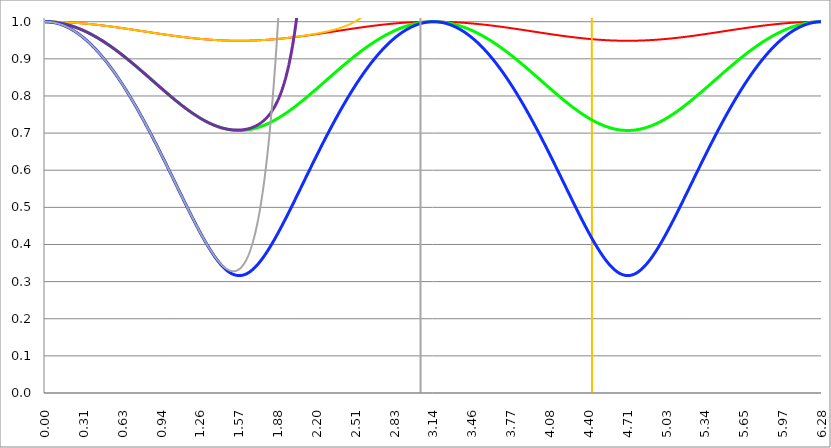
| Category | Series 1 | Series 0 | Series 3 | Series 4 | Series 5 | Series 2 |
|---|---|---|---|---|---|---|
| 0.0 | 1 | 1 | 1 | 1 | 1 | 1 |
| 0.00314159265358979 | 1 | 1 | 1 | 1 | 1 | 1 |
| 0.00628318530717958 | 1 | 1 | 1 | 1 | 1 | 1 |
| 0.00942477796076938 | 1 | 1 | 1 | 1 | 1 | 1 |
| 0.0125663706143592 | 1 | 1 | 1 | 1 | 1 | 1 |
| 0.015707963267949 | 1 | 1 | 1 | 1 | 1 | 1 |
| 0.0188495559215388 | 1 | 1 | 1 | 1 | 1 | 1 |
| 0.0219911485751285 | 1 | 1 | 1 | 1 | 1 | 1 |
| 0.0251327412287183 | 1 | 1 | 1 | 1 | 1 | 1 |
| 0.0282743338823081 | 1 | 1 | 1 | 1 | 1 | 1 |
| 0.0314159265358979 | 1 | 1 | 1 | 1 | 1 | 1 |
| 0.0345575191894877 | 1 | 1 | 1 | 1 | 0.999 | 0.999 |
| 0.0376991118430775 | 1 | 1 | 1 | 1 | 0.999 | 0.999 |
| 0.0408407044966673 | 1 | 1 | 1 | 1 | 0.999 | 0.999 |
| 0.0439822971502571 | 1 | 1 | 1 | 1 | 0.999 | 0.999 |
| 0.0471238898038469 | 1 | 1 | 0.999 | 0.999 | 0.999 | 0.999 |
| 0.0502654824574367 | 1 | 1 | 0.999 | 0.999 | 0.999 | 0.999 |
| 0.0534070751110265 | 1 | 1 | 0.999 | 0.999 | 0.999 | 0.999 |
| 0.0565486677646163 | 1 | 1 | 0.999 | 0.999 | 0.999 | 0.999 |
| 0.059690260418206 | 1 | 1 | 0.999 | 0.999 | 0.998 | 0.998 |
| 0.0628318530717958 | 1 | 1 | 0.999 | 0.999 | 0.998 | 0.998 |
| 0.0659734457253856 | 1 | 1 | 0.999 | 0.999 | 0.998 | 0.998 |
| 0.0691150383789754 | 1 | 1 | 0.999 | 0.999 | 0.998 | 0.998 |
| 0.0722566310325652 | 1 | 1 | 0.999 | 0.999 | 0.998 | 0.998 |
| 0.075398223686155 | 1 | 1 | 0.999 | 0.999 | 0.997 | 0.997 |
| 0.0785398163397448 | 1 | 1 | 0.998 | 0.998 | 0.997 | 0.997 |
| 0.0816814089933346 | 1 | 1 | 0.998 | 0.998 | 0.997 | 0.997 |
| 0.0848230016469244 | 1 | 1 | 0.998 | 0.998 | 0.997 | 0.997 |
| 0.0879645943005142 | 1 | 1 | 0.998 | 0.998 | 0.997 | 0.997 |
| 0.091106186954104 | 1 | 1 | 0.998 | 0.998 | 0.996 | 0.996 |
| 0.0942477796076937 | 1 | 1 | 0.998 | 0.998 | 0.996 | 0.996 |
| 0.0973893722612835 | 1 | 1 | 0.998 | 0.998 | 0.996 | 0.996 |
| 0.100530964914873 | 0.999 | 0.999 | 0.997 | 0.997 | 0.995 | 0.995 |
| 0.103672557568463 | 0.999 | 0.999 | 0.997 | 0.997 | 0.995 | 0.995 |
| 0.106814150222053 | 0.999 | 0.999 | 0.997 | 0.997 | 0.995 | 0.995 |
| 0.109955742875643 | 0.999 | 0.999 | 0.997 | 0.997 | 0.995 | 0.995 |
| 0.113097335529233 | 0.999 | 0.999 | 0.997 | 0.997 | 0.994 | 0.994 |
| 0.116238928182822 | 0.999 | 0.999 | 0.997 | 0.997 | 0.994 | 0.994 |
| 0.119380520836412 | 0.999 | 0.999 | 0.996 | 0.996 | 0.994 | 0.994 |
| 0.122522113490002 | 0.999 | 0.999 | 0.996 | 0.996 | 0.993 | 0.993 |
| 0.125663706143592 | 0.999 | 0.999 | 0.996 | 0.996 | 0.993 | 0.993 |
| 0.128805298797181 | 0.999 | 0.999 | 0.996 | 0.996 | 0.993 | 0.993 |
| 0.131946891450771 | 0.999 | 0.999 | 0.996 | 0.996 | 0.992 | 0.992 |
| 0.135088484104361 | 0.999 | 0.999 | 0.995 | 0.995 | 0.992 | 0.992 |
| 0.138230076757951 | 0.999 | 0.999 | 0.995 | 0.995 | 0.991 | 0.991 |
| 0.141371669411541 | 0.999 | 0.999 | 0.995 | 0.995 | 0.991 | 0.991 |
| 0.14451326206513 | 0.999 | 0.999 | 0.995 | 0.995 | 0.991 | 0.991 |
| 0.14765485471872 | 0.999 | 0.999 | 0.995 | 0.995 | 0.99 | 0.99 |
| 0.15079644737231 | 0.999 | 0.999 | 0.994 | 0.994 | 0.99 | 0.99 |
| 0.1539380400259 | 0.999 | 0.999 | 0.994 | 0.994 | 0.989 | 0.989 |
| 0.15707963267949 | 0.999 | 0.999 | 0.994 | 0.994 | 0.989 | 0.989 |
| 0.160221225333079 | 0.999 | 0.999 | 0.994 | 0.994 | 0.988 | 0.988 |
| 0.163362817986669 | 0.999 | 0.999 | 0.993 | 0.993 | 0.988 | 0.988 |
| 0.166504410640259 | 0.999 | 0.999 | 0.993 | 0.993 | 0.988 | 0.988 |
| 0.169646003293849 | 0.999 | 0.999 | 0.993 | 0.993 | 0.987 | 0.987 |
| 0.172787595947439 | 0.999 | 0.999 | 0.993 | 0.993 | 0.987 | 0.987 |
| 0.175929188601028 | 0.998 | 0.998 | 0.992 | 0.992 | 0.986 | 0.986 |
| 0.179070781254618 | 0.998 | 0.998 | 0.992 | 0.992 | 0.986 | 0.986 |
| 0.182212373908208 | 0.998 | 0.998 | 0.992 | 0.992 | 0.985 | 0.985 |
| 0.185353966561798 | 0.998 | 0.998 | 0.991 | 0.991 | 0.985 | 0.985 |
| 0.188495559215388 | 0.998 | 0.998 | 0.991 | 0.991 | 0.984 | 0.984 |
| 0.191637151868977 | 0.998 | 0.998 | 0.991 | 0.991 | 0.984 | 0.984 |
| 0.194778744522567 | 0.998 | 0.998 | 0.991 | 0.991 | 0.983 | 0.983 |
| 0.197920337176157 | 0.998 | 0.998 | 0.99 | 0.99 | 0.982 | 0.982 |
| 0.201061929829747 | 0.998 | 0.998 | 0.99 | 0.99 | 0.982 | 0.982 |
| 0.204203522483336 | 0.998 | 0.998 | 0.99 | 0.99 | 0.981 | 0.981 |
| 0.207345115136926 | 0.998 | 0.998 | 0.989 | 0.989 | 0.981 | 0.981 |
| 0.210486707790516 | 0.998 | 0.998 | 0.989 | 0.989 | 0.98 | 0.98 |
| 0.213628300444106 | 0.998 | 0.998 | 0.989 | 0.989 | 0.98 | 0.98 |
| 0.216769893097696 | 0.998 | 0.998 | 0.988 | 0.988 | 0.979 | 0.979 |
| 0.219911485751285 | 0.998 | 0.998 | 0.988 | 0.988 | 0.978 | 0.978 |
| 0.223053078404875 | 0.998 | 0.998 | 0.988 | 0.988 | 0.978 | 0.978 |
| 0.226194671058465 | 0.997 | 0.997 | 0.987 | 0.987 | 0.977 | 0.977 |
| 0.229336263712055 | 0.997 | 0.997 | 0.987 | 0.987 | 0.976 | 0.976 |
| 0.232477856365645 | 0.997 | 0.997 | 0.987 | 0.987 | 0.976 | 0.976 |
| 0.235619449019234 | 0.997 | 0.997 | 0.986 | 0.986 | 0.975 | 0.975 |
| 0.238761041672824 | 0.997 | 0.997 | 0.986 | 0.986 | 0.975 | 0.975 |
| 0.241902634326414 | 0.997 | 0.997 | 0.986 | 0.986 | 0.974 | 0.974 |
| 0.245044226980004 | 0.997 | 0.997 | 0.985 | 0.985 | 0.973 | 0.973 |
| 0.248185819633594 | 0.997 | 0.997 | 0.985 | 0.985 | 0.972 | 0.972 |
| 0.251327412287183 | 0.997 | 0.997 | 0.984 | 0.984 | 0.972 | 0.972 |
| 0.254469004940773 | 0.997 | 0.997 | 0.984 | 0.984 | 0.971 | 0.971 |
| 0.257610597594363 | 0.997 | 0.997 | 0.984 | 0.984 | 0.97 | 0.97 |
| 0.260752190247953 | 0.997 | 0.997 | 0.983 | 0.983 | 0.97 | 0.97 |
| 0.263893782901543 | 0.997 | 0.997 | 0.983 | 0.983 | 0.969 | 0.969 |
| 0.267035375555132 | 0.997 | 0.997 | 0.982 | 0.982 | 0.968 | 0.968 |
| 0.270176968208722 | 0.996 | 0.996 | 0.982 | 0.982 | 0.967 | 0.967 |
| 0.273318560862312 | 0.996 | 0.996 | 0.982 | 0.982 | 0.967 | 0.967 |
| 0.276460153515902 | 0.996 | 0.996 | 0.981 | 0.981 | 0.966 | 0.966 |
| 0.279601746169492 | 0.996 | 0.996 | 0.981 | 0.981 | 0.965 | 0.965 |
| 0.282743338823082 | 0.996 | 0.996 | 0.98 | 0.98 | 0.964 | 0.964 |
| 0.285884931476671 | 0.996 | 0.996 | 0.98 | 0.98 | 0.964 | 0.964 |
| 0.289026524130261 | 0.996 | 0.996 | 0.979 | 0.979 | 0.963 | 0.963 |
| 0.292168116783851 | 0.996 | 0.996 | 0.979 | 0.979 | 0.962 | 0.962 |
| 0.295309709437441 | 0.996 | 0.996 | 0.979 | 0.979 | 0.961 | 0.961 |
| 0.298451302091031 | 0.996 | 0.996 | 0.978 | 0.978 | 0.96 | 0.96 |
| 0.30159289474462 | 0.996 | 0.996 | 0.978 | 0.978 | 0.959 | 0.959 |
| 0.30473448739821 | 0.995 | 0.995 | 0.977 | 0.977 | 0.959 | 0.959 |
| 0.3078760800518 | 0.995 | 0.995 | 0.977 | 0.977 | 0.958 | 0.958 |
| 0.31101767270539 | 0.995 | 0.995 | 0.976 | 0.976 | 0.957 | 0.957 |
| 0.31415926535898 | 0.995 | 0.995 | 0.976 | 0.976 | 0.956 | 0.956 |
| 0.31730085801257 | 0.995 | 0.995 | 0.975 | 0.975 | 0.955 | 0.955 |
| 0.320442450666159 | 0.995 | 0.995 | 0.975 | 0.975 | 0.954 | 0.954 |
| 0.323584043319749 | 0.995 | 0.995 | 0.974 | 0.974 | 0.953 | 0.953 |
| 0.326725635973339 | 0.995 | 0.995 | 0.974 | 0.974 | 0.953 | 0.953 |
| 0.329867228626929 | 0.995 | 0.995 | 0.973 | 0.973 | 0.952 | 0.952 |
| 0.333008821280519 | 0.995 | 0.995 | 0.973 | 0.973 | 0.951 | 0.951 |
| 0.336150413934108 | 0.995 | 0.995 | 0.972 | 0.972 | 0.95 | 0.95 |
| 0.339292006587698 | 0.994 | 0.994 | 0.972 | 0.972 | 0.949 | 0.949 |
| 0.342433599241288 | 0.994 | 0.994 | 0.971 | 0.971 | 0.948 | 0.948 |
| 0.345575191894878 | 0.994 | 0.994 | 0.971 | 0.971 | 0.947 | 0.947 |
| 0.348716784548468 | 0.994 | 0.994 | 0.97 | 0.97 | 0.946 | 0.946 |
| 0.351858377202058 | 0.994 | 0.994 | 0.97 | 0.97 | 0.945 | 0.945 |
| 0.354999969855647 | 0.994 | 0.994 | 0.969 | 0.969 | 0.944 | 0.944 |
| 0.358141562509237 | 0.994 | 0.994 | 0.969 | 0.969 | 0.943 | 0.943 |
| 0.361283155162827 | 0.994 | 0.994 | 0.968 | 0.968 | 0.942 | 0.942 |
| 0.364424747816417 | 0.994 | 0.994 | 0.968 | 0.968 | 0.941 | 0.941 |
| 0.367566340470007 | 0.994 | 0.994 | 0.967 | 0.967 | 0.94 | 0.94 |
| 0.370707933123597 | 0.993 | 0.993 | 0.967 | 0.967 | 0.939 | 0.939 |
| 0.373849525777186 | 0.993 | 0.993 | 0.966 | 0.966 | 0.938 | 0.938 |
| 0.376991118430776 | 0.993 | 0.993 | 0.966 | 0.966 | 0.937 | 0.937 |
| 0.380132711084366 | 0.993 | 0.993 | 0.965 | 0.965 | 0.936 | 0.936 |
| 0.383274303737956 | 0.993 | 0.993 | 0.964 | 0.964 | 0.935 | 0.935 |
| 0.386415896391546 | 0.993 | 0.993 | 0.964 | 0.964 | 0.934 | 0.934 |
| 0.389557489045135 | 0.993 | 0.993 | 0.963 | 0.963 | 0.933 | 0.933 |
| 0.392699081698725 | 0.993 | 0.993 | 0.963 | 0.963 | 0.932 | 0.932 |
| 0.395840674352315 | 0.993 | 0.993 | 0.962 | 0.962 | 0.931 | 0.931 |
| 0.398982267005905 | 0.992 | 0.992 | 0.962 | 0.962 | 0.93 | 0.93 |
| 0.402123859659495 | 0.992 | 0.992 | 0.961 | 0.961 | 0.929 | 0.929 |
| 0.405265452313085 | 0.992 | 0.992 | 0.96 | 0.96 | 0.927 | 0.927 |
| 0.408407044966674 | 0.992 | 0.992 | 0.96 | 0.96 | 0.926 | 0.926 |
| 0.411548637620264 | 0.992 | 0.992 | 0.959 | 0.959 | 0.925 | 0.925 |
| 0.414690230273854 | 0.992 | 0.992 | 0.959 | 0.959 | 0.924 | 0.924 |
| 0.417831822927444 | 0.992 | 0.992 | 0.958 | 0.958 | 0.923 | 0.923 |
| 0.420973415581034 | 0.992 | 0.992 | 0.957 | 0.957 | 0.922 | 0.922 |
| 0.424115008234623 | 0.991 | 0.991 | 0.957 | 0.957 | 0.921 | 0.921 |
| 0.427256600888213 | 0.991 | 0.991 | 0.956 | 0.956 | 0.919 | 0.919 |
| 0.430398193541803 | 0.991 | 0.991 | 0.955 | 0.955 | 0.918 | 0.918 |
| 0.433539786195393 | 0.991 | 0.991 | 0.955 | 0.955 | 0.917 | 0.917 |
| 0.436681378848983 | 0.991 | 0.991 | 0.954 | 0.954 | 0.916 | 0.916 |
| 0.439822971502573 | 0.991 | 0.991 | 0.954 | 0.954 | 0.915 | 0.915 |
| 0.442964564156162 | 0.991 | 0.991 | 0.953 | 0.953 | 0.914 | 0.914 |
| 0.446106156809752 | 0.991 | 0.991 | 0.952 | 0.952 | 0.912 | 0.912 |
| 0.449247749463342 | 0.991 | 0.991 | 0.952 | 0.952 | 0.911 | 0.911 |
| 0.452389342116932 | 0.99 | 0.99 | 0.951 | 0.951 | 0.91 | 0.91 |
| 0.455530934770522 | 0.99 | 0.99 | 0.95 | 0.95 | 0.909 | 0.909 |
| 0.458672527424111 | 0.99 | 0.99 | 0.95 | 0.95 | 0.908 | 0.908 |
| 0.461814120077701 | 0.99 | 0.99 | 0.949 | 0.949 | 0.906 | 0.906 |
| 0.464955712731291 | 0.99 | 0.99 | 0.948 | 0.948 | 0.905 | 0.905 |
| 0.468097305384881 | 0.99 | 0.99 | 0.948 | 0.948 | 0.904 | 0.904 |
| 0.471238898038471 | 0.99 | 0.99 | 0.947 | 0.947 | 0.902 | 0.902 |
| 0.474380490692061 | 0.99 | 0.99 | 0.946 | 0.946 | 0.901 | 0.901 |
| 0.47752208334565 | 0.989 | 0.989 | 0.946 | 0.946 | 0.9 | 0.9 |
| 0.48066367599924 | 0.989 | 0.989 | 0.945 | 0.945 | 0.899 | 0.899 |
| 0.48380526865283 | 0.989 | 0.989 | 0.944 | 0.944 | 0.897 | 0.897 |
| 0.48694686130642 | 0.989 | 0.989 | 0.944 | 0.944 | 0.896 | 0.896 |
| 0.49008845396001 | 0.989 | 0.989 | 0.943 | 0.943 | 0.895 | 0.895 |
| 0.493230046613599 | 0.989 | 0.989 | 0.942 | 0.942 | 0.893 | 0.893 |
| 0.496371639267189 | 0.989 | 0.989 | 0.942 | 0.942 | 0.892 | 0.892 |
| 0.499513231920779 | 0.988 | 0.988 | 0.941 | 0.941 | 0.891 | 0.891 |
| 0.502654824574369 | 0.988 | 0.988 | 0.94 | 0.94 | 0.889 | 0.889 |
| 0.505796417227959 | 0.988 | 0.988 | 0.939 | 0.939 | 0.888 | 0.888 |
| 0.508938009881549 | 0.988 | 0.988 | 0.939 | 0.939 | 0.887 | 0.887 |
| 0.512079602535138 | 0.988 | 0.988 | 0.938 | 0.938 | 0.885 | 0.885 |
| 0.515221195188728 | 0.988 | 0.988 | 0.937 | 0.937 | 0.884 | 0.884 |
| 0.518362787842318 | 0.988 | 0.988 | 0.937 | 0.937 | 0.883 | 0.883 |
| 0.521504380495908 | 0.988 | 0.988 | 0.936 | 0.936 | 0.881 | 0.881 |
| 0.524645973149498 | 0.987 | 0.987 | 0.935 | 0.935 | 0.88 | 0.88 |
| 0.527787565803087 | 0.987 | 0.987 | 0.934 | 0.934 | 0.878 | 0.878 |
| 0.530929158456677 | 0.987 | 0.987 | 0.934 | 0.934 | 0.877 | 0.877 |
| 0.534070751110267 | 0.987 | 0.987 | 0.933 | 0.933 | 0.876 | 0.876 |
| 0.537212343763857 | 0.987 | 0.987 | 0.932 | 0.932 | 0.874 | 0.874 |
| 0.540353936417447 | 0.987 | 0.987 | 0.931 | 0.931 | 0.873 | 0.873 |
| 0.543495529071037 | 0.987 | 0.987 | 0.931 | 0.931 | 0.871 | 0.871 |
| 0.546637121724626 | 0.986 | 0.986 | 0.93 | 0.93 | 0.87 | 0.87 |
| 0.549778714378216 | 0.986 | 0.986 | 0.929 | 0.929 | 0.869 | 0.869 |
| 0.552920307031806 | 0.986 | 0.986 | 0.928 | 0.928 | 0.867 | 0.867 |
| 0.556061899685396 | 0.986 | 0.986 | 0.928 | 0.928 | 0.866 | 0.866 |
| 0.559203492338986 | 0.986 | 0.986 | 0.927 | 0.927 | 0.864 | 0.864 |
| 0.562345084992576 | 0.986 | 0.986 | 0.926 | 0.926 | 0.863 | 0.863 |
| 0.565486677646165 | 0.986 | 0.986 | 0.925 | 0.925 | 0.861 | 0.861 |
| 0.568628270299755 | 0.985 | 0.985 | 0.925 | 0.925 | 0.86 | 0.86 |
| 0.571769862953345 | 0.985 | 0.985 | 0.924 | 0.924 | 0.858 | 0.858 |
| 0.574911455606935 | 0.985 | 0.985 | 0.923 | 0.923 | 0.857 | 0.857 |
| 0.578053048260525 | 0.985 | 0.985 | 0.922 | 0.922 | 0.855 | 0.855 |
| 0.581194640914114 | 0.985 | 0.985 | 0.922 | 0.922 | 0.854 | 0.854 |
| 0.584336233567704 | 0.985 | 0.985 | 0.921 | 0.921 | 0.852 | 0.852 |
| 0.587477826221294 | 0.985 | 0.985 | 0.92 | 0.92 | 0.851 | 0.851 |
| 0.590619418874884 | 0.984 | 0.984 | 0.919 | 0.919 | 0.849 | 0.849 |
| 0.593761011528474 | 0.984 | 0.984 | 0.918 | 0.918 | 0.848 | 0.848 |
| 0.596902604182064 | 0.984 | 0.984 | 0.918 | 0.918 | 0.846 | 0.846 |
| 0.600044196835653 | 0.984 | 0.984 | 0.917 | 0.917 | 0.844 | 0.844 |
| 0.603185789489243 | 0.984 | 0.984 | 0.916 | 0.916 | 0.843 | 0.843 |
| 0.606327382142833 | 0.984 | 0.984 | 0.915 | 0.915 | 0.841 | 0.841 |
| 0.609468974796423 | 0.983 | 0.983 | 0.914 | 0.914 | 0.84 | 0.84 |
| 0.612610567450013 | 0.983 | 0.983 | 0.914 | 0.914 | 0.838 | 0.838 |
| 0.615752160103602 | 0.983 | 0.983 | 0.913 | 0.913 | 0.837 | 0.837 |
| 0.618893752757192 | 0.983 | 0.983 | 0.912 | 0.912 | 0.835 | 0.835 |
| 0.622035345410782 | 0.983 | 0.983 | 0.911 | 0.911 | 0.833 | 0.833 |
| 0.625176938064372 | 0.983 | 0.983 | 0.91 | 0.91 | 0.832 | 0.832 |
| 0.628318530717962 | 0.983 | 0.983 | 0.91 | 0.91 | 0.83 | 0.83 |
| 0.631460123371551 | 0.982 | 0.982 | 0.909 | 0.909 | 0.828 | 0.828 |
| 0.634601716025141 | 0.982 | 0.982 | 0.908 | 0.908 | 0.827 | 0.827 |
| 0.637743308678731 | 0.982 | 0.982 | 0.907 | 0.907 | 0.825 | 0.825 |
| 0.640884901332321 | 0.982 | 0.982 | 0.906 | 0.906 | 0.824 | 0.824 |
| 0.644026493985911 | 0.982 | 0.982 | 0.905 | 0.905 | 0.822 | 0.822 |
| 0.647168086639501 | 0.982 | 0.982 | 0.905 | 0.905 | 0.82 | 0.82 |
| 0.65030967929309 | 0.982 | 0.982 | 0.904 | 0.904 | 0.819 | 0.819 |
| 0.65345127194668 | 0.981 | 0.981 | 0.903 | 0.903 | 0.817 | 0.817 |
| 0.65659286460027 | 0.981 | 0.981 | 0.902 | 0.902 | 0.815 | 0.815 |
| 0.65973445725386 | 0.981 | 0.981 | 0.901 | 0.901 | 0.814 | 0.814 |
| 0.66287604990745 | 0.981 | 0.981 | 0.9 | 0.9 | 0.812 | 0.812 |
| 0.666017642561039 | 0.981 | 0.981 | 0.9 | 0.9 | 0.81 | 0.81 |
| 0.669159235214629 | 0.981 | 0.981 | 0.899 | 0.899 | 0.809 | 0.809 |
| 0.672300827868219 | 0.98 | 0.98 | 0.898 | 0.898 | 0.807 | 0.807 |
| 0.675442420521809 | 0.98 | 0.98 | 0.897 | 0.897 | 0.805 | 0.805 |
| 0.678584013175399 | 0.98 | 0.98 | 0.896 | 0.896 | 0.803 | 0.803 |
| 0.681725605828989 | 0.98 | 0.98 | 0.895 | 0.895 | 0.802 | 0.802 |
| 0.684867198482578 | 0.98 | 0.98 | 0.894 | 0.894 | 0.8 | 0.8 |
| 0.688008791136168 | 0.98 | 0.98 | 0.894 | 0.894 | 0.798 | 0.798 |
| 0.691150383789758 | 0.979 | 0.979 | 0.893 | 0.893 | 0.796 | 0.796 |
| 0.694291976443348 | 0.979 | 0.979 | 0.892 | 0.892 | 0.795 | 0.795 |
| 0.697433569096938 | 0.979 | 0.979 | 0.891 | 0.891 | 0.793 | 0.793 |
| 0.700575161750528 | 0.979 | 0.979 | 0.89 | 0.89 | 0.791 | 0.791 |
| 0.703716754404117 | 0.979 | 0.979 | 0.889 | 0.889 | 0.789 | 0.789 |
| 0.706858347057707 | 0.979 | 0.979 | 0.888 | 0.888 | 0.788 | 0.788 |
| 0.709999939711297 | 0.979 | 0.979 | 0.887 | 0.887 | 0.786 | 0.786 |
| 0.713141532364887 | 0.978 | 0.978 | 0.887 | 0.887 | 0.784 | 0.784 |
| 0.716283125018477 | 0.978 | 0.978 | 0.886 | 0.886 | 0.782 | 0.782 |
| 0.719424717672066 | 0.978 | 0.978 | 0.885 | 0.885 | 0.781 | 0.781 |
| 0.722566310325656 | 0.978 | 0.978 | 0.884 | 0.884 | 0.779 | 0.779 |
| 0.725707902979246 | 0.978 | 0.978 | 0.883 | 0.883 | 0.777 | 0.777 |
| 0.728849495632836 | 0.978 | 0.978 | 0.882 | 0.882 | 0.775 | 0.775 |
| 0.731991088286426 | 0.977 | 0.977 | 0.881 | 0.881 | 0.773 | 0.773 |
| 0.735132680940016 | 0.977 | 0.977 | 0.88 | 0.88 | 0.771 | 0.771 |
| 0.738274273593605 | 0.977 | 0.977 | 0.88 | 0.88 | 0.77 | 0.77 |
| 0.741415866247195 | 0.977 | 0.977 | 0.879 | 0.879 | 0.768 | 0.768 |
| 0.744557458900785 | 0.977 | 0.977 | 0.878 | 0.878 | 0.766 | 0.766 |
| 0.747699051554375 | 0.977 | 0.977 | 0.877 | 0.877 | 0.764 | 0.764 |
| 0.750840644207965 | 0.976 | 0.976 | 0.876 | 0.876 | 0.762 | 0.762 |
| 0.753982236861554 | 0.976 | 0.976 | 0.875 | 0.875 | 0.76 | 0.76 |
| 0.757123829515144 | 0.976 | 0.976 | 0.874 | 0.874 | 0.759 | 0.759 |
| 0.760265422168734 | 0.976 | 0.976 | 0.873 | 0.873 | 0.757 | 0.757 |
| 0.763407014822324 | 0.976 | 0.976 | 0.872 | 0.872 | 0.755 | 0.755 |
| 0.766548607475914 | 0.976 | 0.976 | 0.871 | 0.871 | 0.753 | 0.753 |
| 0.769690200129504 | 0.975 | 0.975 | 0.871 | 0.871 | 0.751 | 0.751 |
| 0.772831792783093 | 0.975 | 0.975 | 0.87 | 0.87 | 0.749 | 0.749 |
| 0.775973385436683 | 0.975 | 0.975 | 0.869 | 0.869 | 0.747 | 0.747 |
| 0.779114978090273 | 0.975 | 0.975 | 0.868 | 0.868 | 0.745 | 0.745 |
| 0.782256570743863 | 0.975 | 0.975 | 0.867 | 0.867 | 0.744 | 0.744 |
| 0.785398163397453 | 0.975 | 0.975 | 0.866 | 0.866 | 0.742 | 0.742 |
| 0.788539756051042 | 0.975 | 0.975 | 0.865 | 0.865 | 0.74 | 0.74 |
| 0.791681348704632 | 0.974 | 0.974 | 0.864 | 0.864 | 0.738 | 0.738 |
| 0.794822941358222 | 0.974 | 0.974 | 0.863 | 0.863 | 0.736 | 0.736 |
| 0.797964534011812 | 0.974 | 0.974 | 0.862 | 0.862 | 0.734 | 0.734 |
| 0.801106126665402 | 0.974 | 0.974 | 0.861 | 0.861 | 0.732 | 0.732 |
| 0.804247719318992 | 0.974 | 0.974 | 0.861 | 0.861 | 0.73 | 0.73 |
| 0.807389311972581 | 0.974 | 0.974 | 0.86 | 0.86 | 0.728 | 0.728 |
| 0.810530904626171 | 0.973 | 0.973 | 0.859 | 0.859 | 0.726 | 0.726 |
| 0.813672497279761 | 0.973 | 0.973 | 0.858 | 0.858 | 0.724 | 0.724 |
| 0.816814089933351 | 0.973 | 0.973 | 0.857 | 0.857 | 0.722 | 0.722 |
| 0.819955682586941 | 0.973 | 0.973 | 0.856 | 0.856 | 0.72 | 0.72 |
| 0.823097275240531 | 0.973 | 0.973 | 0.855 | 0.855 | 0.718 | 0.718 |
| 0.82623886789412 | 0.973 | 0.973 | 0.854 | 0.854 | 0.716 | 0.716 |
| 0.82938046054771 | 0.972 | 0.972 | 0.853 | 0.853 | 0.714 | 0.714 |
| 0.8325220532013 | 0.972 | 0.972 | 0.852 | 0.852 | 0.712 | 0.712 |
| 0.83566364585489 | 0.972 | 0.972 | 0.851 | 0.851 | 0.711 | 0.711 |
| 0.83880523850848 | 0.972 | 0.972 | 0.85 | 0.85 | 0.709 | 0.709 |
| 0.841946831162069 | 0.972 | 0.972 | 0.85 | 0.85 | 0.707 | 0.707 |
| 0.845088423815659 | 0.972 | 0.972 | 0.849 | 0.849 | 0.705 | 0.705 |
| 0.848230016469249 | 0.971 | 0.971 | 0.848 | 0.848 | 0.703 | 0.703 |
| 0.851371609122839 | 0.971 | 0.971 | 0.847 | 0.847 | 0.701 | 0.701 |
| 0.854513201776429 | 0.971 | 0.971 | 0.846 | 0.846 | 0.699 | 0.699 |
| 0.857654794430019 | 0.971 | 0.971 | 0.845 | 0.845 | 0.697 | 0.697 |
| 0.860796387083608 | 0.971 | 0.971 | 0.844 | 0.844 | 0.695 | 0.695 |
| 0.863937979737198 | 0.971 | 0.971 | 0.843 | 0.843 | 0.693 | 0.693 |
| 0.867079572390788 | 0.97 | 0.97 | 0.842 | 0.842 | 0.691 | 0.691 |
| 0.870221165044378 | 0.97 | 0.97 | 0.841 | 0.841 | 0.688 | 0.688 |
| 0.873362757697968 | 0.97 | 0.97 | 0.84 | 0.84 | 0.686 | 0.686 |
| 0.876504350351557 | 0.97 | 0.97 | 0.839 | 0.839 | 0.684 | 0.684 |
| 0.879645943005147 | 0.97 | 0.97 | 0.839 | 0.839 | 0.682 | 0.682 |
| 0.882787535658737 | 0.97 | 0.97 | 0.838 | 0.838 | 0.68 | 0.68 |
| 0.885929128312327 | 0.97 | 0.97 | 0.837 | 0.837 | 0.678 | 0.678 |
| 0.889070720965917 | 0.969 | 0.969 | 0.836 | 0.836 | 0.676 | 0.676 |
| 0.892212313619507 | 0.969 | 0.969 | 0.835 | 0.835 | 0.674 | 0.674 |
| 0.895353906273096 | 0.969 | 0.969 | 0.834 | 0.834 | 0.672 | 0.672 |
| 0.898495498926686 | 0.969 | 0.969 | 0.833 | 0.833 | 0.67 | 0.67 |
| 0.901637091580276 | 0.969 | 0.969 | 0.832 | 0.832 | 0.668 | 0.668 |
| 0.904778684233866 | 0.969 | 0.969 | 0.831 | 0.831 | 0.666 | 0.666 |
| 0.907920276887456 | 0.968 | 0.968 | 0.83 | 0.83 | 0.664 | 0.664 |
| 0.911061869541045 | 0.968 | 0.968 | 0.829 | 0.829 | 0.662 | 0.662 |
| 0.914203462194635 | 0.968 | 0.968 | 0.828 | 0.828 | 0.66 | 0.66 |
| 0.917345054848225 | 0.968 | 0.968 | 0.828 | 0.828 | 0.658 | 0.658 |
| 0.920486647501815 | 0.968 | 0.968 | 0.827 | 0.827 | 0.656 | 0.656 |
| 0.923628240155405 | 0.968 | 0.968 | 0.826 | 0.826 | 0.654 | 0.654 |
| 0.926769832808995 | 0.967 | 0.967 | 0.825 | 0.825 | 0.652 | 0.652 |
| 0.929911425462584 | 0.967 | 0.967 | 0.824 | 0.824 | 0.649 | 0.649 |
| 0.933053018116174 | 0.967 | 0.967 | 0.823 | 0.823 | 0.647 | 0.647 |
| 0.936194610769764 | 0.967 | 0.967 | 0.822 | 0.822 | 0.645 | 0.645 |
| 0.939336203423354 | 0.967 | 0.967 | 0.821 | 0.821 | 0.643 | 0.643 |
| 0.942477796076944 | 0.967 | 0.967 | 0.82 | 0.82 | 0.641 | 0.641 |
| 0.945619388730533 | 0.967 | 0.967 | 0.819 | 0.819 | 0.639 | 0.639 |
| 0.948760981384123 | 0.966 | 0.966 | 0.818 | 0.818 | 0.637 | 0.637 |
| 0.951902574037713 | 0.966 | 0.966 | 0.817 | 0.817 | 0.635 | 0.635 |
| 0.955044166691303 | 0.966 | 0.966 | 0.817 | 0.817 | 0.633 | 0.633 |
| 0.958185759344893 | 0.966 | 0.966 | 0.816 | 0.816 | 0.631 | 0.631 |
| 0.961327351998483 | 0.966 | 0.966 | 0.815 | 0.815 | 0.628 | 0.628 |
| 0.964468944652072 | 0.966 | 0.966 | 0.814 | 0.814 | 0.626 | 0.626 |
| 0.967610537305662 | 0.965 | 0.965 | 0.813 | 0.813 | 0.624 | 0.624 |
| 0.970752129959252 | 0.965 | 0.965 | 0.812 | 0.812 | 0.622 | 0.622 |
| 0.973893722612842 | 0.965 | 0.965 | 0.811 | 0.811 | 0.62 | 0.62 |
| 0.977035315266432 | 0.965 | 0.965 | 0.81 | 0.81 | 0.618 | 0.618 |
| 0.980176907920022 | 0.965 | 0.965 | 0.809 | 0.809 | 0.616 | 0.616 |
| 0.983318500573611 | 0.965 | 0.965 | 0.808 | 0.808 | 0.614 | 0.614 |
| 0.986460093227201 | 0.965 | 0.965 | 0.808 | 0.808 | 0.611 | 0.611 |
| 0.989601685880791 | 0.964 | 0.964 | 0.807 | 0.807 | 0.609 | 0.609 |
| 0.992743278534381 | 0.964 | 0.964 | 0.806 | 0.806 | 0.607 | 0.607 |
| 0.995884871187971 | 0.964 | 0.964 | 0.805 | 0.805 | 0.605 | 0.605 |
| 0.99902646384156 | 0.964 | 0.964 | 0.804 | 0.804 | 0.603 | 0.603 |
| 1.00216805649515 | 0.964 | 0.964 | 0.803 | 0.803 | 0.601 | 0.601 |
| 1.00530964914874 | 0.964 | 0.964 | 0.802 | 0.802 | 0.599 | 0.599 |
| 1.00845124180233 | 0.964 | 0.964 | 0.801 | 0.801 | 0.597 | 0.597 |
| 1.01159283445592 | 0.963 | 0.963 | 0.8 | 0.8 | 0.594 | 0.594 |
| 1.01473442710951 | 0.963 | 0.963 | 0.8 | 0.8 | 0.592 | 0.592 |
| 1.017876019763099 | 0.963 | 0.963 | 0.799 | 0.799 | 0.59 | 0.59 |
| 1.021017612416689 | 0.963 | 0.963 | 0.798 | 0.798 | 0.588 | 0.588 |
| 1.02415920507028 | 0.963 | 0.963 | 0.797 | 0.797 | 0.586 | 0.586 |
| 1.027300797723869 | 0.963 | 0.963 | 0.796 | 0.796 | 0.584 | 0.584 |
| 1.030442390377459 | 0.963 | 0.963 | 0.795 | 0.795 | 0.582 | 0.582 |
| 1.033583983031048 | 0.962 | 0.962 | 0.794 | 0.794 | 0.579 | 0.579 |
| 1.036725575684638 | 0.962 | 0.962 | 0.793 | 0.793 | 0.577 | 0.577 |
| 1.039867168338228 | 0.962 | 0.962 | 0.793 | 0.793 | 0.575 | 0.575 |
| 1.043008760991818 | 0.962 | 0.962 | 0.792 | 0.792 | 0.573 | 0.573 |
| 1.046150353645408 | 0.962 | 0.962 | 0.791 | 0.791 | 0.571 | 0.571 |
| 1.049291946298998 | 0.962 | 0.962 | 0.79 | 0.79 | 0.569 | 0.569 |
| 1.052433538952587 | 0.962 | 0.962 | 0.789 | 0.789 | 0.567 | 0.567 |
| 1.055575131606177 | 0.961 | 0.961 | 0.788 | 0.788 | 0.564 | 0.564 |
| 1.058716724259767 | 0.961 | 0.961 | 0.787 | 0.787 | 0.562 | 0.562 |
| 1.061858316913357 | 0.961 | 0.961 | 0.787 | 0.787 | 0.56 | 0.56 |
| 1.064999909566947 | 0.961 | 0.961 | 0.786 | 0.786 | 0.558 | 0.558 |
| 1.068141502220536 | 0.961 | 0.961 | 0.785 | 0.785 | 0.556 | 0.556 |
| 1.071283094874126 | 0.961 | 0.961 | 0.784 | 0.784 | 0.554 | 0.554 |
| 1.074424687527716 | 0.961 | 0.961 | 0.783 | 0.783 | 0.551 | 0.551 |
| 1.077566280181306 | 0.96 | 0.96 | 0.782 | 0.782 | 0.549 | 0.549 |
| 1.080707872834896 | 0.96 | 0.96 | 0.782 | 0.782 | 0.547 | 0.547 |
| 1.083849465488486 | 0.96 | 0.96 | 0.781 | 0.781 | 0.545 | 0.545 |
| 1.086991058142075 | 0.96 | 0.96 | 0.78 | 0.78 | 0.543 | 0.543 |
| 1.090132650795665 | 0.96 | 0.96 | 0.779 | 0.779 | 0.541 | 0.541 |
| 1.093274243449255 | 0.96 | 0.96 | 0.778 | 0.778 | 0.539 | 0.539 |
| 1.096415836102845 | 0.96 | 0.96 | 0.777 | 0.777 | 0.536 | 0.536 |
| 1.099557428756435 | 0.959 | 0.959 | 0.777 | 0.777 | 0.534 | 0.534 |
| 1.102699021410025 | 0.959 | 0.959 | 0.776 | 0.776 | 0.532 | 0.532 |
| 1.105840614063614 | 0.959 | 0.959 | 0.775 | 0.775 | 0.53 | 0.53 |
| 1.108982206717204 | 0.959 | 0.959 | 0.774 | 0.774 | 0.528 | 0.528 |
| 1.112123799370794 | 0.959 | 0.959 | 0.773 | 0.773 | 0.526 | 0.526 |
| 1.115265392024384 | 0.959 | 0.959 | 0.773 | 0.773 | 0.524 | 0.524 |
| 1.118406984677974 | 0.959 | 0.959 | 0.772 | 0.772 | 0.522 | 0.522 |
| 1.121548577331563 | 0.959 | 0.959 | 0.771 | 0.771 | 0.519 | 0.519 |
| 1.124690169985153 | 0.958 | 0.958 | 0.77 | 0.77 | 0.517 | 0.517 |
| 1.127831762638743 | 0.958 | 0.958 | 0.769 | 0.769 | 0.515 | 0.515 |
| 1.130973355292333 | 0.958 | 0.958 | 0.769 | 0.769 | 0.513 | 0.513 |
| 1.134114947945923 | 0.958 | 0.958 | 0.768 | 0.768 | 0.511 | 0.511 |
| 1.137256540599513 | 0.958 | 0.958 | 0.767 | 0.767 | 0.509 | 0.509 |
| 1.140398133253102 | 0.958 | 0.958 | 0.766 | 0.766 | 0.507 | 0.507 |
| 1.143539725906692 | 0.958 | 0.958 | 0.765 | 0.765 | 0.505 | 0.505 |
| 1.146681318560282 | 0.958 | 0.958 | 0.765 | 0.765 | 0.502 | 0.502 |
| 1.149822911213872 | 0.957 | 0.957 | 0.764 | 0.764 | 0.5 | 0.5 |
| 1.152964503867462 | 0.957 | 0.957 | 0.763 | 0.763 | 0.498 | 0.498 |
| 1.156106096521051 | 0.957 | 0.957 | 0.762 | 0.762 | 0.496 | 0.496 |
| 1.159247689174641 | 0.957 | 0.957 | 0.762 | 0.762 | 0.494 | 0.494 |
| 1.162389281828231 | 0.957 | 0.957 | 0.761 | 0.761 | 0.492 | 0.492 |
| 1.165530874481821 | 0.957 | 0.957 | 0.76 | 0.76 | 0.49 | 0.49 |
| 1.168672467135411 | 0.957 | 0.957 | 0.759 | 0.759 | 0.488 | 0.488 |
| 1.171814059789001 | 0.957 | 0.957 | 0.759 | 0.759 | 0.486 | 0.486 |
| 1.17495565244259 | 0.956 | 0.956 | 0.758 | 0.758 | 0.484 | 0.484 |
| 1.17809724509618 | 0.956 | 0.956 | 0.757 | 0.757 | 0.481 | 0.481 |
| 1.18123883774977 | 0.956 | 0.956 | 0.756 | 0.756 | 0.479 | 0.479 |
| 1.18438043040336 | 0.956 | 0.956 | 0.756 | 0.756 | 0.477 | 0.477 |
| 1.18752202305695 | 0.956 | 0.956 | 0.755 | 0.755 | 0.475 | 0.475 |
| 1.190663615710539 | 0.956 | 0.956 | 0.754 | 0.754 | 0.473 | 0.473 |
| 1.193805208364129 | 0.956 | 0.956 | 0.753 | 0.753 | 0.471 | 0.471 |
| 1.19694680101772 | 0.956 | 0.956 | 0.753 | 0.753 | 0.469 | 0.469 |
| 1.200088393671309 | 0.956 | 0.956 | 0.752 | 0.752 | 0.467 | 0.467 |
| 1.203229986324899 | 0.955 | 0.955 | 0.751 | 0.751 | 0.465 | 0.465 |
| 1.206371578978489 | 0.955 | 0.955 | 0.751 | 0.751 | 0.463 | 0.463 |
| 1.209513171632078 | 0.955 | 0.955 | 0.75 | 0.75 | 0.461 | 0.461 |
| 1.212654764285668 | 0.955 | 0.955 | 0.749 | 0.749 | 0.459 | 0.459 |
| 1.215796356939258 | 0.955 | 0.955 | 0.749 | 0.749 | 0.457 | 0.457 |
| 1.218937949592848 | 0.955 | 0.955 | 0.748 | 0.748 | 0.455 | 0.455 |
| 1.222079542246438 | 0.955 | 0.955 | 0.747 | 0.747 | 0.453 | 0.453 |
| 1.225221134900027 | 0.955 | 0.955 | 0.747 | 0.747 | 0.451 | 0.451 |
| 1.228362727553617 | 0.955 | 0.955 | 0.746 | 0.746 | 0.449 | 0.449 |
| 1.231504320207207 | 0.955 | 0.955 | 0.745 | 0.745 | 0.447 | 0.447 |
| 1.234645912860797 | 0.954 | 0.954 | 0.745 | 0.745 | 0.445 | 0.445 |
| 1.237787505514387 | 0.954 | 0.954 | 0.744 | 0.744 | 0.443 | 0.443 |
| 1.240929098167977 | 0.954 | 0.954 | 0.743 | 0.743 | 0.441 | 0.441 |
| 1.244070690821566 | 0.954 | 0.954 | 0.743 | 0.743 | 0.439 | 0.439 |
| 1.247212283475156 | 0.954 | 0.954 | 0.742 | 0.742 | 0.437 | 0.437 |
| 1.250353876128746 | 0.954 | 0.954 | 0.741 | 0.741 | 0.435 | 0.435 |
| 1.253495468782336 | 0.954 | 0.954 | 0.741 | 0.741 | 0.433 | 0.433 |
| 1.256637061435926 | 0.954 | 0.954 | 0.74 | 0.74 | 0.431 | 0.431 |
| 1.259778654089515 | 0.954 | 0.954 | 0.739 | 0.739 | 0.429 | 0.429 |
| 1.262920246743105 | 0.954 | 0.954 | 0.739 | 0.739 | 0.427 | 0.427 |
| 1.266061839396695 | 0.953 | 0.953 | 0.738 | 0.738 | 0.425 | 0.426 |
| 1.269203432050285 | 0.953 | 0.953 | 0.738 | 0.738 | 0.424 | 0.424 |
| 1.272345024703875 | 0.953 | 0.953 | 0.737 | 0.737 | 0.422 | 0.422 |
| 1.275486617357465 | 0.953 | 0.953 | 0.736 | 0.736 | 0.42 | 0.42 |
| 1.278628210011054 | 0.953 | 0.953 | 0.736 | 0.736 | 0.418 | 0.418 |
| 1.281769802664644 | 0.953 | 0.953 | 0.735 | 0.735 | 0.416 | 0.416 |
| 1.284911395318234 | 0.953 | 0.953 | 0.735 | 0.735 | 0.414 | 0.414 |
| 1.288052987971824 | 0.953 | 0.953 | 0.734 | 0.734 | 0.412 | 0.413 |
| 1.291194580625414 | 0.953 | 0.953 | 0.734 | 0.734 | 0.411 | 0.411 |
| 1.294336173279003 | 0.953 | 0.953 | 0.733 | 0.733 | 0.409 | 0.409 |
| 1.297477765932593 | 0.953 | 0.953 | 0.732 | 0.732 | 0.407 | 0.407 |
| 1.300619358586183 | 0.952 | 0.952 | 0.732 | 0.732 | 0.405 | 0.405 |
| 1.303760951239773 | 0.952 | 0.952 | 0.731 | 0.731 | 0.403 | 0.404 |
| 1.306902543893363 | 0.952 | 0.952 | 0.731 | 0.731 | 0.402 | 0.402 |
| 1.310044136546953 | 0.952 | 0.952 | 0.73 | 0.73 | 0.4 | 0.4 |
| 1.313185729200542 | 0.952 | 0.952 | 0.73 | 0.73 | 0.398 | 0.398 |
| 1.316327321854132 | 0.952 | 0.952 | 0.729 | 0.729 | 0.396 | 0.397 |
| 1.319468914507722 | 0.952 | 0.952 | 0.729 | 0.729 | 0.395 | 0.395 |
| 1.322610507161312 | 0.952 | 0.952 | 0.728 | 0.728 | 0.393 | 0.393 |
| 1.325752099814902 | 0.952 | 0.952 | 0.728 | 0.728 | 0.391 | 0.391 |
| 1.328893692468491 | 0.952 | 0.952 | 0.727 | 0.727 | 0.389 | 0.39 |
| 1.332035285122081 | 0.952 | 0.952 | 0.727 | 0.727 | 0.388 | 0.388 |
| 1.335176877775671 | 0.952 | 0.952 | 0.726 | 0.726 | 0.386 | 0.386 |
| 1.338318470429261 | 0.951 | 0.951 | 0.726 | 0.726 | 0.384 | 0.385 |
| 1.341460063082851 | 0.951 | 0.951 | 0.725 | 0.725 | 0.383 | 0.383 |
| 1.344601655736441 | 0.951 | 0.951 | 0.725 | 0.725 | 0.381 | 0.382 |
| 1.34774324839003 | 0.951 | 0.951 | 0.724 | 0.724 | 0.38 | 0.38 |
| 1.35088484104362 | 0.951 | 0.951 | 0.724 | 0.724 | 0.378 | 0.378 |
| 1.35402643369721 | 0.951 | 0.951 | 0.723 | 0.723 | 0.376 | 0.377 |
| 1.3571680263508 | 0.951 | 0.951 | 0.723 | 0.723 | 0.375 | 0.375 |
| 1.36030961900439 | 0.951 | 0.951 | 0.722 | 0.722 | 0.373 | 0.374 |
| 1.363451211657979 | 0.951 | 0.951 | 0.722 | 0.722 | 0.372 | 0.372 |
| 1.36659280431157 | 0.951 | 0.951 | 0.721 | 0.722 | 0.37 | 0.371 |
| 1.369734396965159 | 0.951 | 0.951 | 0.721 | 0.721 | 0.369 | 0.369 |
| 1.372875989618749 | 0.951 | 0.951 | 0.721 | 0.721 | 0.367 | 0.368 |
| 1.376017582272339 | 0.951 | 0.951 | 0.72 | 0.72 | 0.366 | 0.366 |
| 1.379159174925929 | 0.951 | 0.951 | 0.72 | 0.72 | 0.364 | 0.365 |
| 1.382300767579518 | 0.951 | 0.951 | 0.719 | 0.719 | 0.363 | 0.364 |
| 1.385442360233108 | 0.95 | 0.95 | 0.719 | 0.719 | 0.361 | 0.362 |
| 1.388583952886698 | 0.95 | 0.95 | 0.719 | 0.719 | 0.36 | 0.361 |
| 1.391725545540288 | 0.95 | 0.95 | 0.718 | 0.718 | 0.359 | 0.36 |
| 1.394867138193878 | 0.95 | 0.95 | 0.718 | 0.718 | 0.357 | 0.358 |
| 1.398008730847468 | 0.95 | 0.95 | 0.717 | 0.718 | 0.356 | 0.357 |
| 1.401150323501057 | 0.95 | 0.95 | 0.717 | 0.717 | 0.354 | 0.356 |
| 1.404291916154647 | 0.95 | 0.95 | 0.717 | 0.717 | 0.353 | 0.354 |
| 1.407433508808237 | 0.95 | 0.95 | 0.716 | 0.716 | 0.352 | 0.353 |
| 1.410575101461827 | 0.95 | 0.95 | 0.716 | 0.716 | 0.351 | 0.352 |
| 1.413716694115417 | 0.95 | 0.95 | 0.716 | 0.716 | 0.349 | 0.351 |
| 1.416858286769006 | 0.95 | 0.95 | 0.715 | 0.715 | 0.348 | 0.35 |
| 1.419999879422596 | 0.95 | 0.95 | 0.715 | 0.715 | 0.347 | 0.348 |
| 1.423141472076186 | 0.95 | 0.95 | 0.715 | 0.715 | 0.346 | 0.347 |
| 1.426283064729776 | 0.95 | 0.95 | 0.714 | 0.715 | 0.344 | 0.346 |
| 1.429424657383366 | 0.95 | 0.95 | 0.714 | 0.714 | 0.343 | 0.345 |
| 1.432566250036956 | 0.95 | 0.95 | 0.714 | 0.714 | 0.342 | 0.344 |
| 1.435707842690545 | 0.95 | 0.95 | 0.713 | 0.714 | 0.341 | 0.343 |
| 1.438849435344135 | 0.95 | 0.95 | 0.713 | 0.713 | 0.34 | 0.342 |
| 1.441991027997725 | 0.95 | 0.95 | 0.713 | 0.713 | 0.339 | 0.341 |
| 1.445132620651315 | 0.95 | 0.95 | 0.713 | 0.713 | 0.338 | 0.34 |
| 1.448274213304905 | 0.949 | 0.949 | 0.712 | 0.713 | 0.337 | 0.339 |
| 1.451415805958494 | 0.949 | 0.949 | 0.712 | 0.712 | 0.336 | 0.339 |
| 1.454557398612084 | 0.949 | 0.949 | 0.712 | 0.712 | 0.335 | 0.338 |
| 1.457698991265674 | 0.949 | 0.949 | 0.712 | 0.712 | 0.334 | 0.337 |
| 1.460840583919264 | 0.949 | 0.949 | 0.711 | 0.712 | 0.333 | 0.336 |
| 1.463982176572854 | 0.949 | 0.949 | 0.711 | 0.711 | 0.332 | 0.335 |
| 1.467123769226444 | 0.949 | 0.949 | 0.711 | 0.711 | 0.331 | 0.335 |
| 1.470265361880033 | 0.949 | 0.949 | 0.711 | 0.711 | 0.33 | 0.334 |
| 1.473406954533623 | 0.949 | 0.949 | 0.71 | 0.711 | 0.329 | 0.333 |
| 1.476548547187213 | 0.949 | 0.949 | 0.71 | 0.71 | 0.329 | 0.333 |
| 1.479690139840803 | 0.949 | 0.949 | 0.71 | 0.71 | 0.328 | 0.332 |
| 1.482831732494393 | 0.949 | 0.949 | 0.71 | 0.71 | 0.327 | 0.332 |
| 1.485973325147982 | 0.949 | 0.949 | 0.71 | 0.71 | 0.326 | 0.331 |
| 1.489114917801572 | 0.949 | 0.949 | 0.709 | 0.71 | 0.326 | 0.331 |
| 1.492256510455162 | 0.949 | 0.949 | 0.709 | 0.71 | 0.325 | 0.33 |
| 1.495398103108752 | 0.949 | 0.949 | 0.709 | 0.709 | 0.324 | 0.33 |
| 1.498539695762342 | 0.949 | 0.949 | 0.709 | 0.709 | 0.324 | 0.329 |
| 1.501681288415932 | 0.949 | 0.949 | 0.709 | 0.709 | 0.323 | 0.329 |
| 1.504822881069521 | 0.949 | 0.949 | 0.709 | 0.709 | 0.322 | 0.329 |
| 1.507964473723111 | 0.949 | 0.949 | 0.708 | 0.709 | 0.322 | 0.329 |
| 1.511106066376701 | 0.949 | 0.949 | 0.708 | 0.709 | 0.321 | 0.328 |
| 1.514247659030291 | 0.949 | 0.949 | 0.708 | 0.709 | 0.321 | 0.328 |
| 1.517389251683881 | 0.949 | 0.949 | 0.708 | 0.709 | 0.32 | 0.328 |
| 1.520530844337471 | 0.949 | 0.949 | 0.708 | 0.709 | 0.32 | 0.328 |
| 1.52367243699106 | 0.949 | 0.949 | 0.708 | 0.708 | 0.319 | 0.328 |
| 1.52681402964465 | 0.949 | 0.949 | 0.708 | 0.708 | 0.319 | 0.328 |
| 1.52995562229824 | 0.949 | 0.949 | 0.708 | 0.708 | 0.319 | 0.328 |
| 1.53309721495183 | 0.949 | 0.949 | 0.708 | 0.708 | 0.318 | 0.328 |
| 1.53623880760542 | 0.949 | 0.949 | 0.708 | 0.708 | 0.318 | 0.328 |
| 1.539380400259009 | 0.949 | 0.949 | 0.707 | 0.708 | 0.318 | 0.329 |
| 1.542521992912599 | 0.949 | 0.949 | 0.707 | 0.708 | 0.317 | 0.329 |
| 1.545663585566189 | 0.949 | 0.949 | 0.707 | 0.708 | 0.317 | 0.329 |
| 1.548805178219779 | 0.949 | 0.949 | 0.707 | 0.708 | 0.317 | 0.329 |
| 1.551946770873369 | 0.949 | 0.949 | 0.707 | 0.708 | 0.317 | 0.33 |
| 1.555088363526959 | 0.949 | 0.949 | 0.707 | 0.708 | 0.317 | 0.33 |
| 1.558229956180548 | 0.949 | 0.949 | 0.707 | 0.708 | 0.316 | 0.331 |
| 1.561371548834138 | 0.949 | 0.949 | 0.707 | 0.708 | 0.316 | 0.331 |
| 1.564513141487728 | 0.949 | 0.949 | 0.707 | 0.708 | 0.316 | 0.332 |
| 1.567654734141318 | 0.949 | 0.949 | 0.707 | 0.708 | 0.316 | 0.333 |
| 1.570796326794908 | 0.949 | 0.949 | 0.707 | 0.708 | 0.316 | 0.334 |
| 1.573937919448497 | 0.949 | 0.949 | 0.707 | 0.708 | 0.316 | 0.334 |
| 1.577079512102087 | 0.949 | 0.949 | 0.707 | 0.708 | 0.316 | 0.335 |
| 1.580221104755677 | 0.949 | 0.949 | 0.707 | 0.708 | 0.316 | 0.336 |
| 1.583362697409267 | 0.949 | 0.949 | 0.707 | 0.708 | 0.316 | 0.337 |
| 1.586504290062857 | 0.949 | 0.949 | 0.707 | 0.708 | 0.317 | 0.338 |
| 1.589645882716447 | 0.949 | 0.949 | 0.707 | 0.709 | 0.317 | 0.339 |
| 1.592787475370036 | 0.949 | 0.949 | 0.707 | 0.709 | 0.317 | 0.34 |
| 1.595929068023626 | 0.949 | 0.949 | 0.707 | 0.709 | 0.317 | 0.342 |
| 1.599070660677216 | 0.949 | 0.949 | 0.707 | 0.709 | 0.317 | 0.343 |
| 1.602212253330806 | 0.949 | 0.949 | 0.707 | 0.709 | 0.318 | 0.344 |
| 1.605353845984396 | 0.949 | 0.949 | 0.708 | 0.709 | 0.318 | 0.346 |
| 1.608495438637985 | 0.949 | 0.949 | 0.708 | 0.709 | 0.318 | 0.347 |
| 1.611637031291575 | 0.949 | 0.949 | 0.708 | 0.71 | 0.319 | 0.349 |
| 1.614778623945165 | 0.949 | 0.949 | 0.708 | 0.71 | 0.319 | 0.351 |
| 1.617920216598755 | 0.949 | 0.949 | 0.708 | 0.71 | 0.319 | 0.353 |
| 1.621061809252345 | 0.949 | 0.949 | 0.708 | 0.71 | 0.32 | 0.354 |
| 1.624203401905935 | 0.949 | 0.949 | 0.708 | 0.71 | 0.32 | 0.356 |
| 1.627344994559524 | 0.949 | 0.949 | 0.708 | 0.71 | 0.321 | 0.358 |
| 1.630486587213114 | 0.949 | 0.949 | 0.708 | 0.711 | 0.321 | 0.36 |
| 1.633628179866704 | 0.949 | 0.949 | 0.708 | 0.711 | 0.322 | 0.363 |
| 1.636769772520294 | 0.949 | 0.949 | 0.709 | 0.711 | 0.322 | 0.365 |
| 1.639911365173884 | 0.949 | 0.949 | 0.709 | 0.711 | 0.323 | 0.367 |
| 1.643052957827473 | 0.949 | 0.949 | 0.709 | 0.712 | 0.324 | 0.37 |
| 1.646194550481063 | 0.949 | 0.949 | 0.709 | 0.712 | 0.324 | 0.372 |
| 1.649336143134653 | 0.949 | 0.949 | 0.709 | 0.712 | 0.325 | 0.375 |
| 1.652477735788243 | 0.949 | 0.949 | 0.709 | 0.713 | 0.326 | 0.377 |
| 1.655619328441833 | 0.949 | 0.949 | 0.71 | 0.713 | 0.326 | 0.38 |
| 1.658760921095423 | 0.949 | 0.949 | 0.71 | 0.713 | 0.327 | 0.383 |
| 1.661902513749012 | 0.949 | 0.949 | 0.71 | 0.714 | 0.328 | 0.386 |
| 1.665044106402602 | 0.949 | 0.949 | 0.71 | 0.714 | 0.329 | 0.389 |
| 1.668185699056192 | 0.949 | 0.949 | 0.71 | 0.714 | 0.329 | 0.392 |
| 1.671327291709782 | 0.949 | 0.949 | 0.711 | 0.715 | 0.33 | 0.396 |
| 1.674468884363372 | 0.949 | 0.949 | 0.711 | 0.715 | 0.331 | 0.399 |
| 1.677610477016961 | 0.949 | 0.949 | 0.711 | 0.715 | 0.332 | 0.403 |
| 1.680752069670551 | 0.949 | 0.949 | 0.711 | 0.716 | 0.333 | 0.406 |
| 1.683893662324141 | 0.949 | 0.949 | 0.712 | 0.716 | 0.334 | 0.41 |
| 1.687035254977731 | 0.949 | 0.949 | 0.712 | 0.717 | 0.335 | 0.414 |
| 1.690176847631321 | 0.949 | 0.949 | 0.712 | 0.717 | 0.336 | 0.418 |
| 1.693318440284911 | 0.949 | 0.949 | 0.712 | 0.718 | 0.337 | 0.422 |
| 1.6964600329385 | 0.95 | 0.95 | 0.713 | 0.718 | 0.338 | 0.426 |
| 1.69960162559209 | 0.95 | 0.95 | 0.713 | 0.719 | 0.339 | 0.43 |
| 1.70274321824568 | 0.95 | 0.95 | 0.713 | 0.719 | 0.34 | 0.435 |
| 1.70588481089927 | 0.95 | 0.95 | 0.713 | 0.72 | 0.341 | 0.439 |
| 1.70902640355286 | 0.95 | 0.95 | 0.714 | 0.72 | 0.342 | 0.444 |
| 1.712167996206449 | 0.95 | 0.95 | 0.714 | 0.721 | 0.343 | 0.449 |
| 1.715309588860039 | 0.95 | 0.95 | 0.714 | 0.721 | 0.344 | 0.454 |
| 1.71845118151363 | 0.95 | 0.95 | 0.715 | 0.722 | 0.346 | 0.459 |
| 1.721592774167219 | 0.95 | 0.95 | 0.715 | 0.723 | 0.347 | 0.464 |
| 1.724734366820809 | 0.95 | 0.95 | 0.715 | 0.723 | 0.348 | 0.47 |
| 1.727875959474399 | 0.95 | 0.95 | 0.716 | 0.724 | 0.349 | 0.475 |
| 1.731017552127988 | 0.95 | 0.95 | 0.716 | 0.724 | 0.351 | 0.481 |
| 1.734159144781578 | 0.95 | 0.95 | 0.716 | 0.725 | 0.352 | 0.487 |
| 1.737300737435168 | 0.95 | 0.95 | 0.717 | 0.726 | 0.353 | 0.493 |
| 1.740442330088758 | 0.95 | 0.95 | 0.717 | 0.727 | 0.354 | 0.499 |
| 1.743583922742348 | 0.95 | 0.95 | 0.717 | 0.727 | 0.356 | 0.505 |
| 1.746725515395937 | 0.95 | 0.95 | 0.718 | 0.728 | 0.357 | 0.511 |
| 1.749867108049527 | 0.95 | 0.95 | 0.718 | 0.729 | 0.359 | 0.518 |
| 1.753008700703117 | 0.95 | 0.95 | 0.719 | 0.73 | 0.36 | 0.525 |
| 1.756150293356707 | 0.95 | 0.95 | 0.719 | 0.73 | 0.361 | 0.532 |
| 1.759291886010297 | 0.951 | 0.951 | 0.719 | 0.731 | 0.363 | 0.539 |
| 1.762433478663887 | 0.951 | 0.951 | 0.72 | 0.732 | 0.364 | 0.546 |
| 1.765575071317476 | 0.951 | 0.951 | 0.72 | 0.733 | 0.366 | 0.553 |
| 1.768716663971066 | 0.951 | 0.951 | 0.721 | 0.734 | 0.367 | 0.561 |
| 1.771858256624656 | 0.951 | 0.951 | 0.721 | 0.735 | 0.369 | 0.569 |
| 1.774999849278246 | 0.951 | 0.951 | 0.721 | 0.736 | 0.37 | 0.577 |
| 1.778141441931836 | 0.951 | 0.951 | 0.722 | 0.737 | 0.372 | 0.585 |
| 1.781283034585426 | 0.951 | 0.951 | 0.722 | 0.738 | 0.373 | 0.593 |
| 1.784424627239015 | 0.951 | 0.951 | 0.723 | 0.739 | 0.375 | 0.602 |
| 1.787566219892605 | 0.951 | 0.951 | 0.723 | 0.74 | 0.376 | 0.611 |
| 1.790707812546195 | 0.951 | 0.951 | 0.724 | 0.741 | 0.378 | 0.62 |
| 1.793849405199785 | 0.951 | 0.951 | 0.724 | 0.742 | 0.38 | 0.629 |
| 1.796990997853375 | 0.951 | 0.951 | 0.725 | 0.743 | 0.381 | 0.638 |
| 1.800132590506964 | 0.951 | 0.951 | 0.725 | 0.744 | 0.383 | 0.648 |
| 1.803274183160554 | 0.951 | 0.952 | 0.726 | 0.745 | 0.384 | 0.658 |
| 1.806415775814144 | 0.952 | 0.952 | 0.726 | 0.747 | 0.386 | 0.668 |
| 1.809557368467734 | 0.952 | 0.952 | 0.727 | 0.748 | 0.388 | 0.678 |
| 1.812698961121324 | 0.952 | 0.952 | 0.727 | 0.749 | 0.389 | 0.688 |
| 1.815840553774914 | 0.952 | 0.952 | 0.728 | 0.751 | 0.391 | 0.699 |
| 1.818982146428503 | 0.952 | 0.952 | 0.728 | 0.752 | 0.393 | 0.71 |
| 1.822123739082093 | 0.952 | 0.952 | 0.729 | 0.753 | 0.395 | 0.721 |
| 1.825265331735683 | 0.952 | 0.952 | 0.729 | 0.755 | 0.396 | 0.733 |
| 1.828406924389273 | 0.952 | 0.952 | 0.73 | 0.756 | 0.398 | 0.744 |
| 1.831548517042863 | 0.952 | 0.952 | 0.73 | 0.758 | 0.4 | 0.756 |
| 1.834690109696452 | 0.952 | 0.952 | 0.731 | 0.759 | 0.402 | 0.769 |
| 1.837831702350042 | 0.952 | 0.952 | 0.731 | 0.761 | 0.403 | 0.781 |
| 1.840973295003632 | 0.952 | 0.952 | 0.732 | 0.762 | 0.405 | 0.794 |
| 1.844114887657222 | 0.953 | 0.953 | 0.732 | 0.764 | 0.407 | 0.807 |
| 1.847256480310812 | 0.953 | 0.953 | 0.733 | 0.766 | 0.409 | 0.82 |
| 1.850398072964402 | 0.953 | 0.953 | 0.734 | 0.767 | 0.411 | 0.834 |
| 1.853539665617991 | 0.953 | 0.953 | 0.734 | 0.769 | 0.412 | 0.847 |
| 1.856681258271581 | 0.953 | 0.953 | 0.735 | 0.771 | 0.414 | 0.862 |
| 1.859822850925171 | 0.953 | 0.953 | 0.735 | 0.773 | 0.416 | 0.876 |
| 1.862964443578761 | 0.953 | 0.953 | 0.736 | 0.775 | 0.418 | 0.891 |
| 1.866106036232351 | 0.953 | 0.953 | 0.736 | 0.777 | 0.42 | 0.906 |
| 1.86924762888594 | 0.953 | 0.953 | 0.737 | 0.779 | 0.422 | 0.921 |
| 1.87238922153953 | 0.953 | 0.953 | 0.738 | 0.781 | 0.424 | 0.937 |
| 1.87553081419312 | 0.953 | 0.953 | 0.738 | 0.783 | 0.425 | 0.953 |
| 1.87867240684671 | 0.954 | 0.954 | 0.739 | 0.785 | 0.427 | 0.969 |
| 1.8818139995003 | 0.954 | 0.954 | 0.739 | 0.788 | 0.429 | 0.986 |
| 1.88495559215389 | 0.954 | 0.954 | 0.74 | 0.79 | 0.431 | 1.003 |
| 1.888097184807479 | 0.954 | 0.954 | 0.741 | 0.792 | 0.433 | 1.02 |
| 1.891238777461069 | 0.954 | 0.954 | 0.741 | 0.795 | 0.435 | 1.038 |
| 1.89438037011466 | 0.954 | 0.954 | 0.742 | 0.797 | 0.437 | 1.056 |
| 1.897521962768249 | 0.954 | 0.954 | 0.743 | 0.8 | 0.439 | 1.074 |
| 1.900663555421839 | 0.954 | 0.954 | 0.743 | 0.802 | 0.441 | 1.093 |
| 1.903805148075429 | 0.954 | 0.954 | 0.744 | 0.805 | 0.443 | 1.112 |
| 1.906946740729018 | 0.954 | 0.954 | 0.745 | 0.808 | 0.445 | 1.131 |
| 1.910088333382608 | 0.955 | 0.955 | 0.745 | 0.811 | 0.447 | 1.151 |
| 1.913229926036198 | 0.955 | 0.955 | 0.746 | 0.813 | 0.449 | 1.172 |
| 1.916371518689788 | 0.955 | 0.955 | 0.747 | 0.816 | 0.451 | 1.192 |
| 1.919513111343378 | 0.955 | 0.955 | 0.747 | 0.819 | 0.453 | 1.213 |
| 1.922654703996967 | 0.955 | 0.955 | 0.748 | 0.823 | 0.455 | 1.235 |
| 1.925796296650557 | 0.955 | 0.955 | 0.749 | 0.826 | 0.457 | 1.257 |
| 1.928937889304147 | 0.955 | 0.955 | 0.749 | 0.829 | 0.459 | 1.279 |
| 1.932079481957737 | 0.955 | 0.955 | 0.75 | 0.832 | 0.461 | 1.302 |
| 1.935221074611327 | 0.955 | 0.955 | 0.751 | 0.836 | 0.463 | 1.325 |
| 1.938362667264917 | 0.955 | 0.956 | 0.751 | 0.84 | 0.465 | 1.349 |
| 1.941504259918506 | 0.956 | 0.956 | 0.752 | 0.843 | 0.467 | 1.373 |
| 1.944645852572096 | 0.956 | 0.956 | 0.753 | 0.847 | 0.469 | 1.397 |
| 1.947787445225686 | 0.956 | 0.956 | 0.753 | 0.851 | 0.471 | 1.423 |
| 1.950929037879276 | 0.956 | 0.956 | 0.754 | 0.855 | 0.473 | 1.448 |
| 1.954070630532866 | 0.956 | 0.956 | 0.755 | 0.859 | 0.475 | 1.474 |
| 1.957212223186455 | 0.956 | 0.956 | 0.756 | 0.863 | 0.477 | 1.501 |
| 1.960353815840045 | 0.956 | 0.956 | 0.756 | 0.867 | 0.479 | 1.528 |
| 1.963495408493635 | 0.956 | 0.957 | 0.757 | 0.872 | 0.481 | 1.555 |
| 1.966637001147225 | 0.956 | 0.957 | 0.758 | 0.876 | 0.484 | 1.583 |
| 1.969778593800815 | 0.957 | 0.957 | 0.759 | 0.881 | 0.486 | 1.612 |
| 1.972920186454405 | 0.957 | 0.957 | 0.759 | 0.886 | 0.488 | 1.641 |
| 1.976061779107994 | 0.957 | 0.957 | 0.76 | 0.89 | 0.49 | 1.671 |
| 1.979203371761584 | 0.957 | 0.957 | 0.761 | 0.895 | 0.492 | 1.701 |
| 1.982344964415174 | 0.957 | 0.957 | 0.762 | 0.901 | 0.494 | 1.732 |
| 1.985486557068764 | 0.957 | 0.957 | 0.762 | 0.906 | 0.496 | 1.763 |
| 1.988628149722354 | 0.957 | 0.958 | 0.763 | 0.911 | 0.498 | 1.795 |
| 1.991769742375943 | 0.957 | 0.958 | 0.764 | 0.917 | 0.5 | 1.827 |
| 1.994911335029533 | 0.958 | 0.958 | 0.765 | 0.923 | 0.502 | 1.86 |
| 1.998052927683123 | 0.958 | 0.958 | 0.765 | 0.928 | 0.505 | 1.894 |
| 2.001194520336712 | 0.958 | 0.958 | 0.766 | 0.934 | 0.507 | 1.929 |
| 2.004336112990302 | 0.958 | 0.958 | 0.767 | 0.941 | 0.509 | 1.964 |
| 2.007477705643892 | 0.958 | 0.958 | 0.768 | 0.947 | 0.511 | 1.999 |
| 2.010619298297482 | 0.958 | 0.958 | 0.769 | 0.953 | 0.513 | 2.035 |
| 2.013760890951071 | 0.958 | 0.959 | 0.769 | 0.96 | 0.515 | 2.072 |
| 2.016902483604661 | 0.958 | 0.959 | 0.77 | 0.967 | 0.517 | 2.11 |
| 2.02004407625825 | 0.959 | 0.959 | 0.771 | 0.974 | 0.519 | 2.148 |
| 2.02318566891184 | 0.959 | 0.959 | 0.772 | 0.981 | 0.522 | 2.187 |
| 2.02632726156543 | 0.959 | 0.959 | 0.773 | 0.989 | 0.524 | 2.227 |
| 2.029468854219019 | 0.959 | 0.959 | 0.773 | 0.996 | 0.526 | 2.267 |
| 2.032610446872609 | 0.959 | 0.959 | 0.774 | 1.004 | 0.528 | 2.308 |
| 2.035752039526198 | 0.959 | 0.96 | 0.775 | 1.012 | 0.53 | 2.35 |
| 2.038893632179788 | 0.959 | 0.96 | 0.776 | 1.02 | 0.532 | 2.393 |
| 2.042035224833378 | 0.959 | 0.96 | 0.777 | 1.029 | 0.534 | 2.436 |
| 2.045176817486967 | 0.96 | 0.96 | 0.777 | 1.038 | 0.536 | 2.48 |
| 2.048318410140557 | 0.96 | 0.96 | 0.778 | 1.046 | 0.539 | 2.525 |
| 2.051460002794146 | 0.96 | 0.96 | 0.779 | 1.056 | 0.541 | 2.571 |
| 2.054601595447736 | 0.96 | 0.96 | 0.78 | 1.065 | 0.543 | 2.617 |
| 2.057743188101325 | 0.96 | 0.961 | 0.781 | 1.075 | 0.545 | 2.665 |
| 2.060884780754915 | 0.96 | 0.961 | 0.782 | 1.085 | 0.547 | 2.713 |
| 2.064026373408505 | 0.96 | 0.961 | 0.782 | 1.095 | 0.549 | 2.762 |
| 2.067167966062094 | 0.961 | 0.961 | 0.783 | 1.105 | 0.551 | 2.812 |
| 2.070309558715684 | 0.961 | 0.961 | 0.784 | 1.116 | 0.554 | 2.862 |
| 2.073451151369273 | 0.961 | 0.961 | 0.785 | 1.127 | 0.556 | 2.914 |
| 2.076592744022863 | 0.961 | 0.961 | 0.786 | 1.138 | 0.558 | 2.967 |
| 2.079734336676452 | 0.961 | 0.962 | 0.787 | 1.15 | 0.56 | 3.02 |
| 2.082875929330042 | 0.961 | 0.962 | 0.787 | 1.162 | 0.562 | 3.074 |
| 2.086017521983632 | 0.961 | 0.962 | 0.788 | 1.174 | 0.564 | 3.13 |
| 2.089159114637221 | 0.962 | 0.962 | 0.789 | 1.187 | 0.567 | 3.186 |
| 2.092300707290811 | 0.962 | 0.962 | 0.79 | 1.199 | 0.569 | 3.243 |
| 2.095442299944401 | 0.962 | 0.962 | 0.791 | 1.213 | 0.571 | 3.301 |
| 2.09858389259799 | 0.962 | 0.963 | 0.792 | 1.226 | 0.573 | 3.361 |
| 2.10172548525158 | 0.962 | 0.963 | 0.793 | 1.24 | 0.575 | 3.421 |
| 2.104867077905169 | 0.962 | 0.963 | 0.793 | 1.254 | 0.577 | 3.482 |
| 2.108008670558759 | 0.962 | 0.963 | 0.794 | 1.269 | 0.579 | 3.544 |
| 2.111150263212349 | 0.963 | 0.963 | 0.795 | 1.284 | 0.582 | 3.608 |
| 2.114291855865938 | 0.963 | 0.963 | 0.796 | 1.3 | 0.584 | 3.672 |
| 2.117433448519528 | 0.963 | 0.963 | 0.797 | 1.316 | 0.586 | 3.738 |
| 2.120575041173117 | 0.963 | 0.964 | 0.798 | 1.332 | 0.588 | 3.804 |
| 2.123716633826707 | 0.963 | 0.964 | 0.799 | 1.348 | 0.59 | 3.872 |
| 2.126858226480297 | 0.963 | 0.964 | 0.8 | 1.366 | 0.592 | 3.941 |
| 2.129999819133886 | 0.963 | 0.964 | 0.8 | 1.383 | 0.594 | 4.011 |
| 2.133141411787476 | 0.964 | 0.964 | 0.801 | 1.401 | 0.597 | 4.082 |
| 2.136283004441065 | 0.964 | 0.964 | 0.802 | 1.42 | 0.599 | 4.154 |
| 2.139424597094655 | 0.964 | 0.965 | 0.803 | 1.439 | 0.601 | 4.228 |
| 2.142566189748245 | 0.964 | 0.965 | 0.804 | 1.458 | 0.603 | 4.303 |
| 2.145707782401834 | 0.964 | 0.965 | 0.805 | 1.478 | 0.605 | 4.379 |
| 2.148849375055424 | 0.964 | 0.965 | 0.806 | 1.499 | 0.607 | 4.456 |
| 2.151990967709013 | 0.964 | 0.965 | 0.807 | 1.52 | 0.609 | 4.535 |
| 2.155132560362603 | 0.965 | 0.966 | 0.808 | 1.542 | 0.611 | 4.615 |
| 2.158274153016193 | 0.965 | 0.966 | 0.808 | 1.564 | 0.614 | 4.696 |
| 2.161415745669782 | 0.965 | 0.966 | 0.809 | 1.587 | 0.616 | 4.778 |
| 2.164557338323372 | 0.965 | 0.966 | 0.81 | 1.61 | 0.618 | 4.862 |
| 2.167698930976961 | 0.965 | 0.966 | 0.811 | 1.634 | 0.62 | 4.948 |
| 2.170840523630551 | 0.965 | 0.966 | 0.812 | 1.658 | 0.622 | 5.034 |
| 2.173982116284141 | 0.965 | 0.967 | 0.813 | 1.684 | 0.624 | 5.122 |
| 2.17712370893773 | 0.966 | 0.967 | 0.814 | 1.709 | 0.626 | 5.212 |
| 2.18026530159132 | 0.966 | 0.967 | 0.815 | 1.736 | 0.628 | 5.303 |
| 2.183406894244909 | 0.966 | 0.967 | 0.816 | 1.763 | 0.631 | 5.395 |
| 2.186548486898499 | 0.966 | 0.967 | 0.817 | 1.791 | 0.633 | 5.489 |
| 2.189690079552089 | 0.966 | 0.968 | 0.817 | 1.82 | 0.635 | 5.584 |
| 2.192831672205678 | 0.966 | 0.968 | 0.818 | 1.849 | 0.637 | 5.681 |
| 2.195973264859268 | 0.967 | 0.968 | 0.819 | 1.879 | 0.639 | 5.78 |
| 2.199114857512857 | 0.967 | 0.968 | 0.82 | 1.91 | 0.641 | 5.88 |
| 2.202256450166447 | 0.967 | 0.968 | 0.821 | 1.942 | 0.643 | 5.981 |
| 2.205398042820036 | 0.967 | 0.969 | 0.822 | 1.974 | 0.645 | 6.084 |
| 2.208539635473626 | 0.967 | 0.969 | 0.823 | 2.008 | 0.647 | 6.189 |
| 2.211681228127216 | 0.967 | 0.969 | 0.824 | 2.042 | 0.649 | 6.296 |
| 2.214822820780805 | 0.967 | 0.969 | 0.825 | 2.077 | 0.652 | 6.404 |
| 2.217964413434395 | 0.968 | 0.969 | 0.826 | 2.113 | 0.654 | 6.514 |
| 2.221106006087984 | 0.968 | 0.97 | 0.827 | 2.15 | 0.656 | 6.625 |
| 2.224247598741574 | 0.968 | 0.97 | 0.828 | 2.187 | 0.658 | 6.739 |
| 2.227389191395164 | 0.968 | 0.97 | 0.828 | 2.226 | 0.66 | 6.854 |
| 2.230530784048753 | 0.968 | 0.97 | 0.829 | 2.266 | 0.662 | 6.971 |
| 2.233672376702343 | 0.968 | 0.97 | 0.83 | 2.306 | 0.664 | 7.089 |
| 2.236813969355933 | 0.969 | 0.971 | 0.831 | 2.348 | 0.666 | 7.21 |
| 2.239955562009522 | 0.969 | 0.971 | 0.832 | 2.391 | 0.668 | 7.332 |
| 2.243097154663112 | 0.969 | 0.971 | 0.833 | 2.435 | 0.67 | 7.456 |
| 2.246238747316701 | 0.969 | 0.971 | 0.834 | 2.48 | 0.672 | 7.583 |
| 2.249380339970291 | 0.969 | 0.971 | 0.835 | 2.526 | 0.674 | 7.711 |
| 2.252521932623881 | 0.969 | 0.972 | 0.836 | 2.573 | 0.676 | 7.841 |
| 2.25566352527747 | 0.97 | 0.972 | 0.837 | 2.621 | 0.678 | 7.973 |
| 2.25880511793106 | 0.97 | 0.972 | 0.838 | 2.671 | 0.68 | 8.107 |
| 2.261946710584649 | 0.97 | 0.972 | 0.839 | 2.722 | 0.682 | 8.243 |
| 2.265088303238239 | 0.97 | 0.973 | 0.839 | 2.774 | 0.684 | 8.381 |
| 2.268229895891829 | 0.97 | 0.973 | 0.84 | 2.828 | 0.686 | 8.521 |
| 2.271371488545418 | 0.97 | 0.973 | 0.841 | 2.882 | 0.688 | 8.663 |
| 2.274513081199008 | 0.97 | 0.973 | 0.842 | 2.938 | 0.691 | 8.808 |
| 2.277654673852597 | 0.971 | 0.973 | 0.843 | 2.996 | 0.693 | 8.954 |
| 2.280796266506186 | 0.971 | 0.974 | 0.844 | 3.055 | 0.695 | 9.103 |
| 2.283937859159776 | 0.971 | 0.974 | 0.845 | 3.115 | 0.697 | 9.254 |
| 2.287079451813366 | 0.971 | 0.974 | 0.846 | 3.177 | 0.699 | 9.407 |
| 2.290221044466955 | 0.971 | 0.974 | 0.847 | 3.241 | 0.701 | 9.562 |
| 2.293362637120545 | 0.971 | 0.975 | 0.848 | 3.306 | 0.703 | 9.72 |
| 2.296504229774135 | 0.972 | 0.975 | 0.849 | 3.372 | 0.705 | 9.88 |
| 2.299645822427724 | 0.972 | 0.975 | 0.85 | 3.44 | 0.707 | 10.042 |
| 2.302787415081314 | 0.972 | 0.975 | 0.85 | 3.51 | 0.709 | 10.207 |
| 2.305929007734904 | 0.972 | 0.976 | 0.851 | 3.582 | 0.711 | 10.374 |
| 2.309070600388493 | 0.972 | 0.976 | 0.852 | 3.655 | 0.712 | 10.543 |
| 2.312212193042083 | 0.972 | 0.976 | 0.853 | 3.73 | 0.714 | 10.715 |
| 2.315353785695672 | 0.973 | 0.976 | 0.854 | 3.807 | 0.716 | 10.89 |
| 2.318495378349262 | 0.973 | 0.977 | 0.855 | 3.886 | 0.718 | 11.067 |
| 2.321636971002852 | 0.973 | 0.977 | 0.856 | 3.967 | 0.72 | 11.246 |
| 2.324778563656441 | 0.973 | 0.977 | 0.857 | 4.049 | 0.722 | 11.428 |
| 2.327920156310031 | 0.973 | 0.978 | 0.858 | 4.134 | 0.724 | 11.612 |
| 2.33106174896362 | 0.973 | 0.978 | 0.859 | 4.221 | 0.726 | 11.799 |
| 2.33420334161721 | 0.974 | 0.978 | 0.86 | 4.31 | 0.728 | 11.989 |
| 2.3373449342708 | 0.974 | 0.978 | 0.861 | 4.401 | 0.73 | 12.181 |
| 2.340486526924389 | 0.974 | 0.979 | 0.861 | 4.494 | 0.732 | 12.377 |
| 2.343628119577979 | 0.974 | 0.979 | 0.862 | 4.589 | 0.734 | 12.574 |
| 2.346769712231568 | 0.974 | 0.979 | 0.863 | 4.687 | 0.736 | 12.775 |
| 2.349911304885158 | 0.974 | 0.98 | 0.864 | 4.787 | 0.738 | 12.978 |
| 2.353052897538748 | 0.975 | 0.98 | 0.865 | 4.89 | 0.74 | 13.184 |
| 2.356194490192337 | 0.975 | 0.98 | 0.866 | 4.994 | 0.742 | 13.393 |
| 2.359336082845927 | 0.975 | 0.98 | 0.867 | 5.102 | 0.744 | 13.605 |
| 2.362477675499516 | 0.975 | 0.981 | 0.868 | 5.212 | 0.745 | 13.819 |
| 2.365619268153106 | 0.975 | 0.981 | 0.869 | 5.324 | 0.747 | 14.037 |
| 2.368760860806696 | 0.975 | 0.981 | 0.87 | 5.44 | 0.749 | 14.257 |
| 2.371902453460285 | 0.975 | 0.982 | 0.871 | 5.558 | 0.751 | 14.48 |
| 2.375044046113875 | 0.976 | 0.982 | 0.871 | 5.679 | 0.753 | 14.707 |
| 2.378185638767464 | 0.976 | 0.982 | 0.872 | 5.802 | 0.755 | 14.936 |
| 2.381327231421054 | 0.976 | 0.983 | 0.873 | 5.929 | 0.757 | 15.168 |
| 2.384468824074644 | 0.976 | 0.983 | 0.874 | 6.058 | 0.759 | 15.404 |
| 2.387610416728233 | 0.976 | 0.983 | 0.875 | 6.191 | 0.76 | 15.642 |
| 2.390752009381823 | 0.976 | 0.984 | 0.876 | 6.327 | 0.762 | 15.884 |
| 2.393893602035412 | 0.977 | 0.984 | 0.877 | 6.466 | 0.764 | 16.129 |
| 2.397035194689002 | 0.977 | 0.984 | 0.878 | 6.608 | 0.766 | 16.377 |
| 2.400176787342591 | 0.977 | 0.985 | 0.879 | 6.754 | 0.768 | 16.628 |
| 2.403318379996181 | 0.977 | 0.985 | 0.88 | 6.902 | 0.77 | 16.882 |
| 2.406459972649771 | 0.977 | 0.986 | 0.88 | 7.055 | 0.771 | 17.14 |
| 2.40960156530336 | 0.977 | 0.986 | 0.881 | 7.211 | 0.773 | 17.401 |
| 2.41274315795695 | 0.978 | 0.986 | 0.882 | 7.371 | 0.775 | 17.665 |
| 2.41588475061054 | 0.978 | 0.987 | 0.883 | 7.534 | 0.777 | 17.932 |
| 2.419026343264129 | 0.978 | 0.987 | 0.884 | 7.701 | 0.779 | 18.203 |
| 2.422167935917719 | 0.978 | 0.987 | 0.885 | 7.872 | 0.781 | 18.477 |
| 2.425309528571308 | 0.978 | 0.988 | 0.886 | 8.047 | 0.782 | 18.755 |
| 2.428451121224898 | 0.978 | 0.988 | 0.887 | 8.226 | 0.784 | 19.036 |
| 2.431592713878488 | 0.979 | 0.989 | 0.887 | 8.409 | 0.786 | 19.32 |
| 2.434734306532077 | 0.979 | 0.989 | 0.888 | 8.597 | 0.788 | 19.608 |
| 2.437875899185667 | 0.979 | 0.989 | 0.889 | 8.788 | 0.789 | 19.9 |
| 2.441017491839256 | 0.979 | 0.99 | 0.89 | 8.985 | 0.791 | 20.194 |
| 2.444159084492846 | 0.979 | 0.99 | 0.891 | 9.185 | 0.793 | 20.493 |
| 2.447300677146435 | 0.979 | 0.991 | 0.892 | 9.39 | 0.795 | 20.795 |
| 2.450442269800025 | 0.979 | 0.991 | 0.893 | 9.6 | 0.796 | 21.1 |
| 2.453583862453615 | 0.98 | 0.992 | 0.894 | 9.815 | 0.798 | 21.409 |
| 2.456725455107204 | 0.98 | 0.992 | 0.894 | 10.035 | 0.8 | 21.722 |
| 2.459867047760794 | 0.98 | 0.993 | 0.895 | 10.259 | 0.802 | 22.039 |
| 2.463008640414384 | 0.98 | 0.993 | 0.896 | 10.489 | 0.803 | 22.359 |
| 2.466150233067973 | 0.98 | 0.994 | 0.897 | 10.724 | 0.805 | 22.682 |
| 2.469291825721563 | 0.98 | 0.994 | 0.898 | 10.965 | 0.807 | 23.01 |
| 2.472433418375152 | 0.981 | 0.995 | 0.899 | 11.21 | 0.809 | 23.341 |
| 2.475575011028742 | 0.981 | 0.995 | 0.9 | 11.462 | 0.81 | 23.675 |
| 2.478716603682332 | 0.981 | 0.996 | 0.9 | 11.719 | 0.812 | 24.014 |
| 2.481858196335921 | 0.981 | 0.996 | 0.901 | 11.982 | 0.814 | 24.356 |
| 2.48499978898951 | 0.981 | 0.997 | 0.902 | 12.25 | 0.815 | 24.702 |
| 2.4881413816431 | 0.981 | 0.997 | 0.903 | 12.525 | 0.817 | 25.052 |
| 2.49128297429669 | 0.982 | 0.998 | 0.904 | 12.806 | 0.819 | 25.405 |
| 2.49442456695028 | 0.982 | 0.998 | 0.905 | 13.094 | 0.82 | 25.763 |
| 2.497566159603869 | 0.982 | 0.999 | 0.905 | 13.387 | 0.822 | 26.124 |
| 2.500707752257458 | 0.982 | 0.999 | 0.906 | 13.688 | 0.824 | 26.489 |
| 2.503849344911048 | 0.982 | 1 | 0.907 | 13.995 | 0.825 | 26.857 |
| 2.506990937564638 | 0.982 | 1 | 0.908 | 14.309 | 0.827 | 27.23 |
| 2.510132530218228 | 0.982 | 1.001 | 0.909 | 14.63 | 0.828 | 27.606 |
| 2.513274122871817 | 0.983 | 1.002 | 0.91 | 14.958 | 0.83 | 27.986 |
| 2.516415715525407 | 0.983 | 1.002 | 0.91 | 15.293 | 0.832 | 28.37 |
| 2.519557308178996 | 0.983 | 1.003 | 0.911 | 15.636 | 0.833 | 28.758 |
| 2.522698900832586 | 0.983 | 1.004 | 0.912 | 15.987 | 0.835 | 29.15 |
| 2.525840493486176 | 0.983 | 1.004 | 0.913 | 16.345 | 0.837 | 29.545 |
| 2.528982086139765 | 0.983 | 1.005 | 0.914 | 16.711 | 0.838 | 29.945 |
| 2.532123678793355 | 0.983 | 1.006 | 0.914 | 17.085 | 0.84 | 30.348 |
| 2.535265271446944 | 0.984 | 1.006 | 0.915 | 17.468 | 0.841 | 30.755 |
| 2.538406864100534 | 0.984 | 1.007 | 0.916 | 17.859 | 0.843 | 31.166 |
| 2.541548456754124 | 0.984 | 1.008 | 0.917 | 18.258 | 0.844 | 31.58 |
| 2.544690049407713 | 0.984 | 1.008 | 0.918 | 18.667 | 0.846 | 31.999 |
| 2.547831642061302 | 0.984 | 1.009 | 0.918 | 19.084 | 0.848 | 32.421 |
| 2.550973234714892 | 0.984 | 1.01 | 0.919 | 19.51 | 0.849 | 32.847 |
| 2.554114827368482 | 0.985 | 1.011 | 0.92 | 19.946 | 0.851 | 33.276 |
| 2.557256420022072 | 0.985 | 1.011 | 0.921 | 20.391 | 0.852 | 33.71 |
| 2.560398012675661 | 0.985 | 1.012 | 0.922 | 20.846 | 0.854 | 34.147 |
| 2.563539605329251 | 0.985 | 1.013 | 0.922 | 21.311 | 0.855 | 34.588 |
| 2.56668119798284 | 0.985 | 1.014 | 0.923 | 21.786 | 0.857 | 35.032 |
| 2.56982279063643 | 0.985 | 1.014 | 0.924 | 22.272 | 0.858 | 35.48 |
| 2.57296438329002 | 0.985 | 1.015 | 0.925 | 22.768 | 0.86 | 35.932 |
| 2.576105975943609 | 0.986 | 1.016 | 0.925 | 23.274 | 0.861 | 36.387 |
| 2.579247568597199 | 0.986 | 1.017 | 0.926 | 23.792 | 0.863 | 36.846 |
| 2.582389161250788 | 0.986 | 1.018 | 0.927 | 24.321 | 0.864 | 37.309 |
| 2.585530753904377 | 0.986 | 1.019 | 0.928 | 24.861 | 0.866 | 37.775 |
| 2.588672346557967 | 0.986 | 1.02 | 0.928 | 25.413 | 0.867 | 38.244 |
| 2.591813939211557 | 0.986 | 1.021 | 0.929 | 25.976 | 0.869 | 38.717 |
| 2.594955531865147 | 0.986 | 1.022 | 0.93 | 26.552 | 0.87 | 39.193 |
| 2.598097124518736 | 0.987 | 1.023 | 0.931 | 27.141 | 0.871 | 39.672 |
| 2.601238717172326 | 0.987 | 1.023 | 0.931 | 27.741 | 0.873 | 40.155 |
| 2.604380309825915 | 0.987 | 1.024 | 0.932 | 28.355 | 0.874 | 40.641 |
| 2.607521902479505 | 0.987 | 1.025 | 0.933 | 28.982 | 0.876 | 41.13 |
| 2.610663495133095 | 0.987 | 1.027 | 0.934 | 29.622 | 0.877 | 41.622 |
| 2.613805087786684 | 0.987 | 1.028 | 0.934 | 30.276 | 0.878 | 42.117 |
| 2.616946680440274 | 0.987 | 1.029 | 0.935 | 30.944 | 0.88 | 42.615 |
| 2.620088273093863 | 0.988 | 1.03 | 0.936 | 31.626 | 0.881 | 43.116 |
| 2.623229865747452 | 0.988 | 1.031 | 0.937 | 32.322 | 0.883 | 43.62 |
| 2.626371458401042 | 0.988 | 1.032 | 0.937 | 33.034 | 0.884 | 44.126 |
| 2.629513051054632 | 0.988 | 1.033 | 0.938 | 33.76 | 0.885 | 44.635 |
| 2.632654643708222 | 0.988 | 1.034 | 0.939 | 34.502 | 0.887 | 45.147 |
| 2.635796236361811 | 0.988 | 1.035 | 0.939 | 35.259 | 0.888 | 45.661 |
| 2.638937829015401 | 0.988 | 1.037 | 0.94 | 36.033 | 0.889 | 46.178 |
| 2.642079421668991 | 0.988 | 1.038 | 0.941 | 36.823 | 0.891 | 46.697 |
| 2.64522101432258 | 0.989 | 1.039 | 0.942 | 37.629 | 0.892 | 47.218 |
| 2.64836260697617 | 0.989 | 1.04 | 0.942 | 38.452 | 0.893 | 47.741 |
| 2.651504199629759 | 0.989 | 1.042 | 0.943 | 39.293 | 0.895 | 48.266 |
| 2.654645792283349 | 0.989 | 1.043 | 0.944 | 40.151 | 0.896 | 48.793 |
| 2.657787384936938 | 0.989 | 1.044 | 0.944 | 41.027 | 0.897 | 49.322 |
| 2.660928977590528 | 0.989 | 1.046 | 0.945 | 41.922 | 0.899 | 49.852 |
| 2.664070570244118 | 0.989 | 1.047 | 0.946 | 42.835 | 0.9 | 50.384 |
| 2.667212162897707 | 0.99 | 1.049 | 0.946 | 43.768 | 0.901 | 50.918 |
| 2.670353755551297 | 0.99 | 1.05 | 0.947 | 44.719 | 0.902 | 51.452 |
| 2.673495348204887 | 0.99 | 1.051 | 0.948 | 45.691 | 0.904 | 51.988 |
| 2.676636940858476 | 0.99 | 1.053 | 0.948 | 46.683 | 0.905 | 52.524 |
| 2.679778533512066 | 0.99 | 1.054 | 0.949 | 47.695 | 0.906 | 53.061 |
| 2.682920126165655 | 0.99 | 1.056 | 0.95 | 48.729 | 0.908 | 53.599 |
| 2.686061718819245 | 0.99 | 1.058 | 0.95 | 49.783 | 0.909 | 54.138 |
| 2.689203311472835 | 0.99 | 1.059 | 0.951 | 50.86 | 0.91 | 54.676 |
| 2.692344904126424 | 0.991 | 1.061 | 0.952 | 51.959 | 0.911 | 55.215 |
| 2.695486496780014 | 0.991 | 1.063 | 0.952 | 53.08 | 0.912 | 55.754 |
| 2.698628089433603 | 0.991 | 1.064 | 0.953 | 54.225 | 0.914 | 56.292 |
| 2.701769682087193 | 0.991 | 1.066 | 0.954 | 55.393 | 0.915 | 56.83 |
| 2.704911274740782 | 0.991 | 1.068 | 0.954 | 56.585 | 0.916 | 57.367 |
| 2.708052867394372 | 0.991 | 1.07 | 0.955 | 57.802 | 0.917 | 57.903 |
| 2.711194460047962 | 0.991 | 1.071 | 0.955 | 59.043 | 0.918 | 58.439 |
| 2.714336052701551 | 0.991 | 1.073 | 0.956 | 60.31 | 0.919 | 58.972 |
| 2.717477645355141 | 0.991 | 1.075 | 0.957 | 61.603 | 0.921 | 59.505 |
| 2.720619238008731 | 0.992 | 1.077 | 0.957 | 62.923 | 0.922 | 60.035 |
| 2.72376083066232 | 0.992 | 1.079 | 0.958 | 64.269 | 0.923 | 60.563 |
| 2.72690242331591 | 0.992 | 1.081 | 0.959 | 65.643 | 0.924 | 61.089 |
| 2.730044015969499 | 0.992 | 1.083 | 0.959 | 67.044 | 0.925 | 61.613 |
| 2.733185608623089 | 0.992 | 1.085 | 0.96 | 68.475 | 0.926 | 62.133 |
| 2.736327201276678 | 0.992 | 1.087 | 0.96 | 69.934 | 0.927 | 62.651 |
| 2.739468793930268 | 0.992 | 1.09 | 0.961 | 71.423 | 0.929 | 63.165 |
| 2.742610386583858 | 0.992 | 1.092 | 0.962 | 72.942 | 0.93 | 63.675 |
| 2.745751979237447 | 0.993 | 1.094 | 0.962 | 74.491 | 0.931 | 64.181 |
| 2.748893571891036 | 0.993 | 1.096 | 0.963 | 76.072 | 0.932 | 64.683 |
| 2.752035164544627 | 0.993 | 1.099 | 0.963 | 77.685 | 0.933 | 65.18 |
| 2.755176757198216 | 0.993 | 1.101 | 0.964 | 79.331 | 0.934 | 65.671 |
| 2.758318349851806 | 0.993 | 1.103 | 0.964 | 81.009 | 0.935 | 66.158 |
| 2.761459942505395 | 0.993 | 1.106 | 0.965 | 82.721 | 0.936 | 66.639 |
| 2.764601535158985 | 0.993 | 1.108 | 0.966 | 84.468 | 0.937 | 67.113 |
| 2.767743127812574 | 0.993 | 1.111 | 0.966 | 86.25 | 0.938 | 67.581 |
| 2.770884720466164 | 0.993 | 1.114 | 0.967 | 88.067 | 0.939 | 68.042 |
| 2.774026313119754 | 0.994 | 1.116 | 0.967 | 89.921 | 0.94 | 68.496 |
| 2.777167905773343 | 0.994 | 1.119 | 0.968 | 91.812 | 0.941 | 68.942 |
| 2.780309498426932 | 0.994 | 1.122 | 0.968 | 93.74 | 0.942 | 69.38 |
| 2.783451091080522 | 0.994 | 1.124 | 0.969 | 95.707 | 0.943 | 69.809 |
| 2.786592683734112 | 0.994 | 1.127 | 0.969 | 97.713 | 0.944 | 70.229 |
| 2.789734276387701 | 0.994 | 1.13 | 0.97 | 99.76 | 0.945 | 70.64 |
| 2.792875869041291 | 0.994 | 1.133 | 0.97 | 101.846 | 0.946 | 71.041 |
| 2.796017461694881 | 0.994 | 1.136 | 0.971 | 103.974 | 0.947 | 71.431 |
| 2.79915905434847 | 0.994 | 1.139 | 0.971 | 106.145 | 0.948 | 71.81 |
| 2.80230064700206 | 0.994 | 1.142 | 0.972 | 108.358 | 0.949 | 72.177 |
| 2.80544223965565 | 0.995 | 1.146 | 0.972 | 110.615 | 0.95 | 72.532 |
| 2.808583832309239 | 0.995 | 1.149 | 0.973 | 112.917 | 0.951 | 72.875 |
| 2.811725424962829 | 0.995 | 1.152 | 0.973 | 115.264 | 0.952 | 73.204 |
| 2.814867017616419 | 0.995 | 1.155 | 0.974 | 117.657 | 0.953 | 73.52 |
| 2.818008610270008 | 0.995 | 1.159 | 0.974 | 120.098 | 0.953 | 73.821 |
| 2.821150202923598 | 0.995 | 1.162 | 0.975 | 122.586 | 0.954 | 74.107 |
| 2.824291795577187 | 0.995 | 1.166 | 0.975 | 125.123 | 0.955 | 74.378 |
| 2.827433388230777 | 0.995 | 1.169 | 0.976 | 127.71 | 0.956 | 74.632 |
| 2.830574980884366 | 0.995 | 1.173 | 0.976 | 130.348 | 0.957 | 74.869 |
| 2.833716573537956 | 0.995 | 1.177 | 0.977 | 133.037 | 0.958 | 75.089 |
| 2.836858166191546 | 0.995 | 1.181 | 0.977 | 135.779 | 0.959 | 75.29 |
| 2.839999758845135 | 0.996 | 1.185 | 0.978 | 138.574 | 0.959 | 75.472 |
| 2.843141351498725 | 0.996 | 1.189 | 0.978 | 141.424 | 0.96 | 75.634 |
| 2.846282944152314 | 0.996 | 1.193 | 0.979 | 144.33 | 0.961 | 75.776 |
| 2.849424536805904 | 0.996 | 1.197 | 0.979 | 147.292 | 0.962 | 75.896 |
| 2.852566129459494 | 0.996 | 1.201 | 0.979 | 150.311 | 0.963 | 75.994 |
| 2.855707722113083 | 0.996 | 1.205 | 0.98 | 153.389 | 0.964 | 76.07 |
| 2.858849314766673 | 0.996 | 1.209 | 0.98 | 156.527 | 0.964 | 76.121 |
| 2.861990907420262 | 0.996 | 1.214 | 0.981 | 159.726 | 0.965 | 76.148 |
| 2.865132500073852 | 0.996 | 1.218 | 0.981 | 162.986 | 0.966 | 76.149 |
| 2.868274092727442 | 0.996 | 1.223 | 0.982 | 166.31 | 0.967 | 76.123 |
| 2.871415685381031 | 0.996 | 1.227 | 0.982 | 169.697 | 0.967 | 76.071 |
| 2.874557278034621 | 0.997 | 1.232 | 0.982 | 173.15 | 0.968 | 75.99 |
| 2.87769887068821 | 0.997 | 1.237 | 0.983 | 176.669 | 0.969 | 75.879 |
| 2.8808404633418 | 0.997 | 1.242 | 0.983 | 180.256 | 0.97 | 75.738 |
| 2.88398205599539 | 0.997 | 1.247 | 0.984 | 183.912 | 0.97 | 75.566 |
| 2.88712364864898 | 0.997 | 1.252 | 0.984 | 187.639 | 0.971 | 75.362 |
| 2.890265241302569 | 0.997 | 1.257 | 0.984 | 191.436 | 0.972 | 75.124 |
| 2.893406833956158 | 0.997 | 1.262 | 0.985 | 195.306 | 0.972 | 74.851 |
| 2.896548426609748 | 0.997 | 1.268 | 0.985 | 199.251 | 0.973 | 74.543 |
| 2.899690019263338 | 0.997 | 1.273 | 0.986 | 203.271 | 0.974 | 74.198 |
| 2.902831611916927 | 0.997 | 1.279 | 0.986 | 207.367 | 0.975 | 73.815 |
| 2.905973204570517 | 0.997 | 1.284 | 0.986 | 211.541 | 0.975 | 73.392 |
| 2.909114797224106 | 0.997 | 1.29 | 0.987 | 215.795 | 0.976 | 72.929 |
| 2.912256389877696 | 0.997 | 1.296 | 0.987 | 220.13 | 0.976 | 72.425 |
| 2.915397982531286 | 0.997 | 1.302 | 0.987 | 224.548 | 0.977 | 71.877 |
| 2.918539575184875 | 0.998 | 1.308 | 0.988 | 229.049 | 0.978 | 71.285 |
| 2.921681167838465 | 0.998 | 1.314 | 0.988 | 233.635 | 0.978 | 70.647 |
| 2.924822760492054 | 0.998 | 1.32 | 0.988 | 238.309 | 0.979 | 69.962 |
| 2.927964353145644 | 0.998 | 1.327 | 0.989 | 243.07 | 0.98 | 69.228 |
| 2.931105945799234 | 0.998 | 1.333 | 0.989 | 247.922 | 0.98 | 68.444 |
| 2.934247538452823 | 0.998 | 1.34 | 0.989 | 252.865 | 0.981 | 67.609 |
| 2.937389131106413 | 0.998 | 1.346 | 0.99 | 257.902 | 0.981 | 66.72 |
| 2.940530723760002 | 0.998 | 1.353 | 0.99 | 263.033 | 0.982 | 65.777 |
| 2.943672316413592 | 0.998 | 1.36 | 0.99 | 268.261 | 0.982 | 64.777 |
| 2.946813909067182 | 0.998 | 1.367 | 0.991 | 273.587 | 0.983 | 63.72 |
| 2.949955501720771 | 0.998 | 1.375 | 0.991 | 279.013 | 0.984 | 62.603 |
| 2.953097094374361 | 0.998 | 1.382 | 0.991 | 284.541 | 0.984 | 61.424 |
| 2.95623868702795 | 0.998 | 1.389 | 0.991 | 290.172 | 0.985 | 60.183 |
| 2.95938027968154 | 0.998 | 1.397 | 0.992 | 295.909 | 0.985 | 58.877 |
| 2.96252187233513 | 0.998 | 1.405 | 0.992 | 301.753 | 0.986 | 57.503 |
| 2.965663464988719 | 0.998 | 1.412 | 0.992 | 307.706 | 0.986 | 56.062 |
| 2.968805057642309 | 0.999 | 1.42 | 0.993 | 313.771 | 0.987 | 54.549 |
| 2.971946650295898 | 0.999 | 1.429 | 0.993 | 319.948 | 0.987 | 52.965 |
| 2.975088242949488 | 0.999 | 1.437 | 0.993 | 326.24 | 0.988 | 51.305 |
| 2.978229835603078 | 0.999 | 1.445 | 0.993 | 332.649 | 0.988 | 49.569 |
| 2.981371428256667 | 0.999 | 1.454 | 0.994 | 339.177 | 0.988 | 47.755 |
| 2.984513020910257 | 0.999 | 1.462 | 0.994 | 345.826 | 0.989 | 45.859 |
| 2.987654613563846 | 0.999 | 1.471 | 0.994 | 352.599 | 0.989 | 43.881 |
| 2.990796206217436 | 0.999 | 1.48 | 0.994 | 359.497 | 0.99 | 41.817 |
| 2.993937798871025 | 0.999 | 1.489 | 0.995 | 366.522 | 0.99 | 39.666 |
| 2.997079391524615 | 0.999 | 1.499 | 0.995 | 373.677 | 0.991 | 37.424 |
| 3.000220984178205 | 0.999 | 1.508 | 0.995 | 380.964 | 0.991 | 35.091 |
| 3.003362576831794 | 0.999 | 1.518 | 0.995 | 388.386 | 0.991 | 32.662 |
| 3.006504169485384 | 0.999 | 1.528 | 0.995 | 395.944 | 0.992 | 30.136 |
| 3.009645762138974 | 0.999 | 1.538 | 0.996 | 403.641 | 0.992 | 27.51 |
| 3.012787354792563 | 0.999 | 1.548 | 0.996 | 411.48 | 0.993 | 24.782 |
| 3.015928947446153 | 0.999 | 1.558 | 0.996 | 419.463 | 0.993 | 21.949 |
| 3.019070540099742 | 0.999 | 1.568 | 0.996 | 427.592 | 0.993 | 19.007 |
| 3.022212132753332 | 0.999 | 1.579 | 0.996 | 435.87 | 0.994 | 15.955 |
| 3.025353725406922 | 0.999 | 1.59 | 0.997 | 444.299 | 0.994 | 12.79 |
| 3.028495318060511 | 0.999 | 1.601 | 0.997 | 452.882 | 0.994 | 9.508 |
| 3.031636910714101 | 0.999 | 1.612 | 0.997 | 461.623 | 0.995 | 6.106 |
| 3.03477850336769 | 0.999 | 1.623 | 0.997 | 470.522 | 0.995 | 2.582 |
| 3.03792009602128 | 0.999 | 1.635 | 0.997 | 479.584 | 0.995 | -1.068 |
| 3.04106168867487 | 0.999 | 1.647 | 0.997 | 488.811 | 0.995 | -4.847 |
| 3.04420328132846 | 1 | 1.659 | 0.998 | 498.205 | 0.996 | -8.757 |
| 3.047344873982049 | 1 | 1.671 | 0.998 | 507.771 | 0.996 | -12.803 |
| 3.050486466635638 | 1 | 1.683 | 0.998 | 517.509 | 0.996 | -16.988 |
| 3.053628059289228 | 1 | 1.696 | 0.998 | 527.425 | 0.997 | -21.315 |
| 3.056769651942818 | 1 | 1.709 | 0.998 | 537.52 | 0.997 | -25.788 |
| 3.059911244596407 | 1 | 1.722 | 0.998 | 547.797 | 0.997 | -30.41 |
| 3.063052837249997 | 1 | 1.735 | 0.998 | 558.261 | 0.997 | -35.185 |
| 3.066194429903586 | 1 | 1.748 | 0.999 | 568.913 | 0.997 | -40.117 |
| 3.069336022557176 | 1 | 1.762 | 0.999 | 579.757 | 0.998 | -45.21 |
| 3.072477615210766 | 1 | 1.776 | 0.999 | 590.797 | 0.998 | -50.467 |
| 3.075619207864355 | 1 | 1.79 | 0.999 | 602.036 | 0.998 | -55.893 |
| 3.078760800517945 | 1 | 1.804 | 0.999 | 613.476 | 0.998 | -61.491 |
| 3.081902393171534 | 1 | 1.819 | 0.999 | 625.122 | 0.998 | -67.266 |
| 3.085043985825124 | 1 | 1.833 | 0.999 | 636.977 | 0.999 | -73.222 |
| 3.088185578478713 | 1 | 1.848 | 0.999 | 649.045 | 0.999 | -79.363 |
| 3.091327171132303 | 1 | 1.864 | 0.999 | 661.329 | 0.999 | -85.694 |
| 3.094468763785893 | 1 | 1.879 | 0.999 | 673.832 | 0.999 | -92.22 |
| 3.097610356439482 | 1 | 1.895 | 1 | 686.559 | 0.999 | -98.945 |
| 3.100751949093072 | 1 | 1.911 | 1 | 699.513 | 0.999 | -105.873 |
| 3.103893541746661 | 1 | 1.927 | 1 | 712.699 | 0.999 | -113.009 |
| 3.107035134400251 | 1 | 1.944 | 1 | 726.119 | 0.999 | -120.359 |
| 3.110176727053841 | 1 | 1.961 | 1 | 739.778 | 1 | -127.928 |
| 3.11331831970743 | 1 | 1.978 | 1 | 753.68 | 1 | -135.719 |
| 3.11645991236102 | 1 | 1.995 | 1 | 767.829 | 1 | -143.74 |
| 3.11960150501461 | 1 | 2.013 | 1 | 782.229 | 1 | -151.994 |
| 3.122743097668199 | 1 | 2.031 | 1 | 796.884 | 1 | -160.488 |
| 3.125884690321789 | 1 | 2.049 | 1 | 811.799 | 1 | -169.227 |
| 3.129026282975378 | 1 | 2.067 | 1 | 826.978 | 1 | -178.216 |
| 3.132167875628968 | 1 | 2.086 | 1 | 842.425 | 1 | -187.462 |
| 3.135309468282557 | 1 | 2.105 | 1 | 858.145 | 1 | -196.969 |
| 3.138451060936147 | 1 | 2.124 | 1 | 874.143 | 1 | -206.745 |
| 3.141592653589737 | 1 | 2.144 | 1 | 890.422 | 1 | -216.796 |
| 3.144734246243326 | 1 | 2.164 | 1 | 906.988 | 1 | -227.126 |
| 3.147875838896916 | 1 | 2.184 | 1 | 923.845 | 1 | -237.744 |
| 3.151017431550505 | 1 | 2.205 | 1 | 940.999 | 1 | -248.655 |
| 3.154159024204095 | 1 | 2.226 | 1 | 958.453 | 1 | -259.866 |
| 3.157300616857685 | 1 | 2.247 | 1 | 976.214 | 1 | -271.384 |
| 3.160442209511274 | 1 | 2.269 | 1 | 994.286 | 1 | -283.215 |
| 3.163583802164864 | 1 | 2.291 | 1 | 1012.674 | 1 | -295.367 |
| 3.166725394818453 | 1 | 2.313 | 1 | 1031.384 | 1 | -307.846 |
| 3.169866987472043 | 1 | 2.336 | 1 | 1050.421 | 1 | -320.661 |
| 3.173008580125633 | 1 | 2.359 | 1 | 1069.79 | 1 | -333.818 |
| 3.176150172779222 | 1 | 2.382 | 1 | 1089.496 | 0.999 | -347.324 |
| 3.179291765432812 | 1 | 2.406 | 1 | 1109.546 | 0.999 | -361.189 |
| 3.182433358086401 | 1 | 2.43 | 1 | 1129.945 | 0.999 | -375.419 |
| 3.185574950739991 | 1 | 2.454 | 1 | 1150.698 | 0.999 | -390.023 |
| 3.188716543393581 | 1 | 2.479 | 0.999 | 1171.812 | 0.999 | -405.008 |
| 3.19185813604717 | 1 | 2.504 | 0.999 | 1193.293 | 0.999 | -420.384 |
| 3.19499972870076 | 1 | 2.53 | 0.999 | 1215.145 | 0.999 | -436.158 |
| 3.198141321354349 | 1 | 2.556 | 0.999 | 1237.376 | 0.999 | -452.34 |
| 3.20128291400794 | 1 | 2.582 | 0.999 | 1259.992 | 0.998 | -468.937 |
| 3.204424506661528 | 1 | 2.609 | 0.999 | 1282.999 | 0.998 | -485.96 |
| 3.207566099315118 | 1 | 2.636 | 0.999 | 1306.403 | 0.998 | -503.417 |
| 3.210707691968708 | 1 | 2.664 | 0.999 | 1330.21 | 0.998 | -521.318 |
| 3.213849284622297 | 1 | 2.692 | 0.999 | 1354.428 | 0.998 | -539.672 |
| 3.216990877275887 | 1 | 2.72 | 0.999 | 1379.063 | 0.997 | -558.488 |
| 3.220132469929476 | 1 | 2.749 | 0.998 | 1404.122 | 0.997 | -577.777 |
| 3.223274062583066 | 1 | 2.778 | 0.998 | 1429.611 | 0.997 | -597.55 |
| 3.226415655236656 | 1 | 2.808 | 0.998 | 1455.538 | 0.997 | -617.815 |
| 3.229557247890245 | 1 | 2.838 | 0.998 | 1481.91 | 0.997 | -638.584 |
| 3.232698840543835 | 1 | 2.869 | 0.998 | 1508.734 | 0.996 | -659.867 |
| 3.235840433197425 | 1 | 2.9 | 0.998 | 1536.017 | 0.996 | -681.675 |
| 3.238982025851014 | 1 | 2.931 | 0.998 | 1563.766 | 0.996 | -704.019 |
| 3.242123618504604 | 0.999 | 2.963 | 0.997 | 1591.99 | 0.995 | -726.911 |
| 3.245265211158193 | 0.999 | 2.996 | 0.997 | 1620.696 | 0.995 | -750.362 |
| 3.248406803811783 | 0.999 | 3.029 | 0.997 | 1649.891 | 0.995 | -774.383 |
| 3.251548396465373 | 0.999 | 3.062 | 0.997 | 1679.584 | 0.995 | -798.987 |
| 3.254689989118962 | 0.999 | 3.096 | 0.997 | 1709.782 | 0.994 | -824.186 |
| 3.257831581772551 | 0.999 | 3.131 | 0.997 | 1740.494 | 0.994 | -849.992 |
| 3.260973174426141 | 0.999 | 3.166 | 0.996 | 1771.728 | 0.994 | -876.417 |
| 3.26411476707973 | 0.999 | 3.201 | 0.996 | 1803.492 | 0.993 | -903.475 |
| 3.267256359733321 | 0.999 | 3.237 | 0.996 | 1835.795 | 0.993 | -931.179 |
| 3.27039795238691 | 0.999 | 3.273 | 0.996 | 1868.645 | 0.993 | -959.542 |
| 3.2735395450405 | 0.999 | 3.31 | 0.996 | 1902.051 | 0.992 | -988.577 |
| 3.276681137694089 | 0.999 | 3.348 | 0.995 | 1936.022 | 0.992 | -1018.299 |
| 3.279822730347679 | 0.999 | 3.386 | 0.995 | 1970.567 | 0.991 | -1048.721 |
| 3.282964323001269 | 0.999 | 3.425 | 0.995 | 2005.696 | 0.991 | -1079.858 |
| 3.286105915654858 | 0.999 | 3.464 | 0.995 | 2041.417 | 0.991 | -1111.725 |
| 3.289247508308448 | 0.999 | 3.504 | 0.995 | 2077.74 | 0.99 | -1144.335 |
| 3.292389100962037 | 0.999 | 3.544 | 0.994 | 2114.674 | 0.99 | -1177.705 |
| 3.295530693615627 | 0.999 | 3.585 | 0.994 | 2152.229 | 0.989 | -1211.85 |
| 3.298672286269217 | 0.999 | 3.626 | 0.994 | 2190.416 | 0.989 | -1246.786 |
| 3.301813878922806 | 0.999 | 3.669 | 0.994 | 2229.244 | 0.988 | -1282.528 |
| 3.304955471576396 | 0.999 | 3.711 | 0.993 | 2268.723 | 0.988 | -1319.093 |
| 3.308097064229985 | 0.999 | 3.755 | 0.993 | 2308.863 | 0.988 | -1356.497 |
| 3.311238656883575 | 0.999 | 3.798 | 0.993 | 2349.676 | 0.987 | -1394.758 |
| 3.314380249537165 | 0.999 | 3.843 | 0.993 | 2391.171 | 0.987 | -1433.892 |
| 3.317521842190754 | 0.998 | 3.888 | 0.992 | 2433.359 | 0.986 | -1473.917 |
| 3.320663434844344 | 0.998 | 3.934 | 0.992 | 2476.252 | 0.986 | -1514.851 |
| 3.323805027497933 | 0.998 | 3.98 | 0.992 | 2519.861 | 0.985 | -1556.712 |
| 3.326946620151523 | 0.998 | 4.028 | 0.991 | 2564.196 | 0.985 | -1599.518 |
| 3.330088212805113 | 0.998 | 4.075 | 0.991 | 2609.27 | 0.984 | -1643.288 |
| 3.333229805458702 | 0.998 | 4.124 | 0.991 | 2655.093 | 0.984 | -1688.042 |
| 3.336371398112292 | 0.998 | 4.173 | 0.991 | 2701.678 | 0.983 | -1733.799 |
| 3.339512990765881 | 0.998 | 4.223 | 0.99 | 2749.036 | 0.982 | -1780.578 |
| 3.342654583419471 | 0.998 | 4.273 | 0.99 | 2797.18 | 0.982 | -1828.401 |
| 3.345796176073061 | 0.998 | 4.324 | 0.99 | 2846.122 | 0.981 | -1877.286 |
| 3.34893776872665 | 0.998 | 4.376 | 0.989 | 2895.875 | 0.981 | -1927.256 |
| 3.35207936138024 | 0.998 | 4.429 | 0.989 | 2946.45 | 0.98 | -1978.332 |
| 3.355220954033829 | 0.998 | 4.482 | 0.989 | 2997.862 | 0.98 | -2030.535 |
| 3.358362546687419 | 0.998 | 4.536 | 0.988 | 3050.123 | 0.979 | -2083.887 |
| 3.361504139341009 | 0.998 | 4.591 | 0.988 | 3103.246 | 0.978 | -2138.411 |
| 3.364645731994598 | 0.998 | 4.646 | 0.988 | 3157.245 | 0.978 | -2194.13 |
| 3.367787324648188 | 0.997 | 4.702 | 0.987 | 3212.133 | 0.977 | -2251.066 |
| 3.370928917301777 | 0.997 | 4.759 | 0.987 | 3267.925 | 0.976 | -2309.244 |
| 3.374070509955367 | 0.997 | 4.817 | 0.987 | 3324.634 | 0.976 | -2368.688 |
| 3.377212102608956 | 0.997 | 4.876 | 0.986 | 3382.274 | 0.975 | -2429.422 |
| 3.380353695262546 | 0.997 | 4.935 | 0.986 | 3440.861 | 0.975 | -2491.471 |
| 3.383495287916136 | 0.997 | 4.995 | 0.986 | 3500.408 | 0.974 | -2554.86 |
| 3.386636880569725 | 0.997 | 5.056 | 0.985 | 3560.93 | 0.973 | -2619.616 |
| 3.389778473223315 | 0.997 | 5.118 | 0.985 | 3622.443 | 0.972 | -2685.764 |
| 3.392920065876904 | 0.997 | 5.181 | 0.984 | 3684.962 | 0.972 | -2753.331 |
| 3.396061658530494 | 0.997 | 5.244 | 0.984 | 3748.503 | 0.971 | -2822.345 |
| 3.399203251184084 | 0.997 | 5.308 | 0.984 | 3813.081 | 0.97 | -2892.833 |
| 3.402344843837673 | 0.997 | 5.374 | 0.983 | 3878.712 | 0.97 | -2964.823 |
| 3.405486436491263 | 0.997 | 5.44 | 0.983 | 3945.413 | 0.969 | -3038.344 |
| 3.408628029144852 | 0.997 | 5.506 | 0.982 | 4013.2 | 0.968 | -3113.425 |
| 3.411769621798442 | 0.996 | 5.574 | 0.982 | 4082.089 | 0.967 | -3190.096 |
| 3.414911214452032 | 0.996 | 5.643 | 0.982 | 4152.098 | 0.967 | -3268.386 |
| 3.418052807105621 | 0.996 | 5.712 | 0.981 | 4223.244 | 0.966 | -3348.328 |
| 3.421194399759211 | 0.996 | 5.783 | 0.981 | 4295.544 | 0.965 | -3429.951 |
| 3.4243359924128 | 0.996 | 5.854 | 0.98 | 4369.016 | 0.964 | -3513.287 |
| 3.42747758506639 | 0.996 | 5.926 | 0.98 | 4443.678 | 0.964 | -3598.369 |
| 3.43061917771998 | 0.996 | 6 | 0.979 | 4519.548 | 0.963 | -3685.23 |
| 3.433760770373569 | 0.996 | 6.074 | 0.979 | 4596.644 | 0.962 | -3773.904 |
| 3.436902363027159 | 0.996 | 6.149 | 0.979 | 4674.986 | 0.961 | -3864.423 |
| 3.440043955680748 | 0.996 | 6.225 | 0.978 | 4754.593 | 0.96 | -3956.823 |
| 3.443185548334338 | 0.996 | 6.302 | 0.978 | 4835.483 | 0.959 | -4051.139 |
| 3.446327140987927 | 0.995 | 6.38 | 0.977 | 4917.676 | 0.959 | -4147.406 |
| 3.449468733641517 | 0.995 | 6.459 | 0.977 | 5001.192 | 0.958 | -4245.662 |
| 3.452610326295107 | 0.995 | 6.539 | 0.976 | 5086.051 | 0.957 | -4345.942 |
| 3.455751918948696 | 0.995 | 6.62 | 0.976 | 5172.274 | 0.956 | -4448.285 |
| 3.458893511602286 | 0.995 | 6.702 | 0.975 | 5259.882 | 0.955 | -4552.73 |
| 3.462035104255876 | 0.995 | 6.785 | 0.975 | 5348.894 | 0.954 | -4659.314 |
| 3.465176696909465 | 0.995 | 6.869 | 0.974 | 5439.333 | 0.953 | -4768.077 |
| 3.468318289563055 | 0.995 | 6.954 | 0.974 | 5531.221 | 0.953 | -4879.06 |
| 3.471459882216644 | 0.995 | 7.041 | 0.973 | 5624.578 | 0.952 | -4992.304 |
| 3.474601474870234 | 0.995 | 7.128 | 0.973 | 5719.428 | 0.951 | -5107.851 |
| 3.477743067523824 | 0.995 | 7.216 | 0.972 | 5815.793 | 0.95 | -5225.742 |
| 3.480884660177413 | 0.994 | 7.306 | 0.972 | 5913.695 | 0.949 | -5346.02 |
| 3.484026252831002 | 0.994 | 7.396 | 0.971 | 6013.159 | 0.948 | -5468.73 |
| 3.487167845484592 | 0.994 | 7.488 | 0.971 | 6114.207 | 0.947 | -5593.916 |
| 3.490309438138182 | 0.994 | 7.581 | 0.97 | 6216.863 | 0.946 | -5721.624 |
| 3.493451030791772 | 0.994 | 7.675 | 0.97 | 6321.153 | 0.945 | -5851.898 |
| 3.496592623445361 | 0.994 | 7.77 | 0.969 | 6427.099 | 0.944 | -5984.787 |
| 3.499734216098951 | 0.994 | 7.866 | 0.969 | 6534.727 | 0.943 | -6120.337 |
| 3.50287580875254 | 0.994 | 7.964 | 0.968 | 6644.062 | 0.942 | -6258.597 |
| 3.50601740140613 | 0.994 | 8.062 | 0.968 | 6755.131 | 0.941 | -6399.617 |
| 3.50915899405972 | 0.994 | 8.162 | 0.967 | 6867.958 | 0.94 | -6543.445 |
| 3.512300586713309 | 0.993 | 8.263 | 0.967 | 6982.57 | 0.939 | -6690.134 |
| 3.515442179366899 | 0.993 | 8.365 | 0.966 | 7098.994 | 0.938 | -6839.734 |
| 3.518583772020488 | 0.993 | 8.469 | 0.966 | 7217.257 | 0.937 | -6992.299 |
| 3.521725364674078 | 0.993 | 8.573 | 0.965 | 7337.387 | 0.936 | -7147.881 |
| 3.524866957327668 | 0.993 | 8.679 | 0.964 | 7459.41 | 0.935 | -7306.535 |
| 3.528008549981257 | 0.993 | 8.786 | 0.964 | 7583.357 | 0.934 | -7468.316 |
| 3.531150142634847 | 0.993 | 8.895 | 0.963 | 7709.254 | 0.933 | -7633.28 |
| 3.534291735288436 | 0.993 | 9.004 | 0.963 | 7837.131 | 0.932 | -7801.484 |
| 3.537433327942026 | 0.993 | 9.115 | 0.962 | 7967.019 | 0.931 | -7972.987 |
| 3.540574920595616 | 0.992 | 9.228 | 0.962 | 8098.945 | 0.93 | -8147.846 |
| 3.543716513249205 | 0.992 | 9.341 | 0.961 | 8232.942 | 0.929 | -8326.123 |
| 3.546858105902795 | 0.992 | 9.456 | 0.96 | 8369.039 | 0.927 | -8507.877 |
| 3.549999698556384 | 0.992 | 9.572 | 0.96 | 8507.267 | 0.926 | -8693.172 |
| 3.553141291209974 | 0.992 | 9.69 | 0.959 | 8647.659 | 0.925 | -8882.068 |
| 3.556282883863564 | 0.992 | 9.809 | 0.959 | 8790.245 | 0.924 | -9074.631 |
| 3.559424476517153 | 0.992 | 9.929 | 0.958 | 8935.06 | 0.923 | -9270.926 |
| 3.562566069170743 | 0.992 | 10.05 | 0.957 | 9082.135 | 0.922 | -9471.018 |
| 3.565707661824332 | 0.991 | 10.173 | 0.957 | 9231.504 | 0.921 | -9674.975 |
| 3.568849254477922 | 0.991 | 10.298 | 0.956 | 9383.201 | 0.919 | -9882.864 |
| 3.571990847131511 | 0.991 | 10.423 | 0.955 | 9537.259 | 0.918 | -10094.755 |
| 3.575132439785101 | 0.991 | 10.551 | 0.955 | 9693.715 | 0.917 | -10310.719 |
| 3.578274032438691 | 0.991 | 10.679 | 0.954 | 9852.603 | 0.916 | -10530.827 |
| 3.58141562509228 | 0.991 | 10.809 | 0.954 | 10013.958 | 0.915 | -10755.151 |
| 3.58455721774587 | 0.991 | 10.941 | 0.953 | 10177.818 | 0.914 | -10983.766 |
| 3.58769881039946 | 0.991 | 11.074 | 0.952 | 10344.218 | 0.912 | -11216.747 |
| 3.590840403053049 | 0.991 | 11.208 | 0.952 | 10513.197 | 0.911 | -11454.169 |
| 3.593981995706639 | 0.99 | 11.344 | 0.951 | 10684.791 | 0.91 | -11696.112 |
| 3.597123588360228 | 0.99 | 11.481 | 0.95 | 10859.04 | 0.909 | -11942.652 |
| 3.600265181013818 | 0.99 | 11.62 | 0.95 | 11035.982 | 0.908 | -12193.871 |
| 3.603406773667407 | 0.99 | 11.76 | 0.949 | 11215.656 | 0.906 | -12449.85 |
| 3.606548366320997 | 0.99 | 11.902 | 0.948 | 11398.103 | 0.905 | -12710.671 |
| 3.609689958974587 | 0.99 | 12.046 | 0.948 | 11583.362 | 0.904 | -12976.418 |
| 3.612831551628176 | 0.99 | 12.191 | 0.947 | 11771.475 | 0.902 | -13247.177 |
| 3.615973144281766 | 0.99 | 12.337 | 0.946 | 11962.483 | 0.901 | -13523.034 |
| 3.619114736935355 | 0.989 | 12.485 | 0.946 | 12156.429 | 0.9 | -13804.078 |
| 3.622256329588945 | 0.989 | 12.635 | 0.945 | 12353.355 | 0.899 | -14090.397 |
| 3.625397922242534 | 0.989 | 12.786 | 0.944 | 12553.305 | 0.897 | -14382.084 |
| 3.628539514896124 | 0.989 | 12.938 | 0.944 | 12756.322 | 0.896 | -14679.229 |
| 3.631681107549714 | 0.989 | 13.093 | 0.943 | 12962.452 | 0.895 | -14981.927 |
| 3.634822700203303 | 0.989 | 13.249 | 0.942 | 13171.738 | 0.893 | -15290.273 |
| 3.637964292856893 | 0.989 | 13.406 | 0.942 | 13384.227 | 0.892 | -15604.365 |
| 3.641105885510483 | 0.988 | 13.565 | 0.941 | 13599.965 | 0.891 | -15924.299 |
| 3.644247478164072 | 0.988 | 13.726 | 0.94 | 13819 | 0.889 | -16250.177 |
| 3.647389070817662 | 0.988 | 13.889 | 0.939 | 14041.378 | 0.888 | -16582.1 |
| 3.650530663471251 | 0.988 | 14.053 | 0.939 | 14267.149 | 0.887 | -16920.17 |
| 3.653672256124841 | 0.988 | 14.219 | 0.938 | 14496.36 | 0.885 | -17264.493 |
| 3.656813848778431 | 0.988 | 14.386 | 0.937 | 14729.063 | 0.884 | -17615.175 |
| 3.65995544143202 | 0.988 | 14.555 | 0.937 | 14965.306 | 0.883 | -17972.324 |
| 3.66309703408561 | 0.988 | 14.726 | 0.936 | 15205.142 | 0.881 | -18336.049 |
| 3.666238626739199 | 0.987 | 14.898 | 0.935 | 15448.621 | 0.88 | -18706.463 |
| 3.66938021939279 | 0.987 | 15.072 | 0.934 | 15695.796 | 0.878 | -19083.678 |
| 3.672521812046378 | 0.987 | 15.248 | 0.934 | 15946.72 | 0.877 | -19467.809 |
| 3.675663404699968 | 0.987 | 15.426 | 0.933 | 16201.447 | 0.876 | -19858.974 |
| 3.678804997353558 | 0.987 | 15.605 | 0.932 | 16460.031 | 0.874 | -20257.29 |
| 3.681946590007147 | 0.987 | 15.786 | 0.931 | 16722.528 | 0.873 | -20662.878 |
| 3.685088182660737 | 0.987 | 15.969 | 0.931 | 16988.994 | 0.871 | -21075.861 |
| 3.688229775314326 | 0.986 | 16.154 | 0.93 | 17259.485 | 0.87 | -21496.363 |
| 3.691371367967916 | 0.986 | 16.34 | 0.929 | 17534.059 | 0.869 | -21924.51 |
| 3.694512960621506 | 0.986 | 16.528 | 0.928 | 17812.775 | 0.867 | -22360.429 |
| 3.697654553275095 | 0.986 | 16.718 | 0.928 | 18095.691 | 0.866 | -22804.253 |
| 3.700796145928685 | 0.986 | 16.91 | 0.927 | 18382.867 | 0.864 | -23256.111 |
| 3.703937738582274 | 0.986 | 17.103 | 0.926 | 18674.364 | 0.863 | -23716.139 |
| 3.707079331235864 | 0.986 | 17.298 | 0.925 | 18970.244 | 0.861 | -24184.473 |
| 3.710220923889454 | 0.985 | 17.495 | 0.925 | 19270.569 | 0.86 | -24661.251 |
| 3.713362516543043 | 0.985 | 17.694 | 0.924 | 19575.401 | 0.858 | -25146.614 |
| 3.716504109196633 | 0.985 | 17.894 | 0.923 | 19884.806 | 0.857 | -25640.705 |
| 3.719645701850223 | 0.985 | 18.097 | 0.922 | 20198.848 | 0.855 | -26143.668 |
| 3.722787294503812 | 0.985 | 18.301 | 0.922 | 20517.592 | 0.854 | -26655.65 |
| 3.725928887157402 | 0.985 | 18.507 | 0.921 | 20841.106 | 0.852 | -27176.802 |
| 3.729070479810991 | 0.985 | 18.715 | 0.92 | 21169.457 | 0.851 | -27707.274 |
| 3.732212072464581 | 0.984 | 18.924 | 0.919 | 21502.713 | 0.849 | -28247.22 |
| 3.735353665118171 | 0.984 | 19.136 | 0.918 | 21840.943 | 0.848 | -28796.798 |
| 3.73849525777176 | 0.984 | 19.349 | 0.918 | 22184.219 | 0.846 | -29356.165 |
| 3.74163685042535 | 0.984 | 19.564 | 0.917 | 22532.61 | 0.844 | -29925.484 |
| 3.744778443078939 | 0.984 | 19.781 | 0.916 | 22886.19 | 0.843 | -30504.917 |
| 3.747920035732529 | 0.984 | 20 | 0.915 | 23245.032 | 0.841 | -31094.631 |
| 3.751061628386119 | 0.983 | 20.221 | 0.914 | 23609.209 | 0.84 | -31694.794 |
| 3.754203221039708 | 0.983 | 20.443 | 0.914 | 23978.796 | 0.838 | -32305.578 |
| 3.757344813693298 | 0.983 | 20.668 | 0.913 | 24353.87 | 0.837 | -32927.157 |
| 3.760486406346887 | 0.983 | 20.894 | 0.912 | 24734.508 | 0.835 | -33559.706 |
| 3.763627999000477 | 0.983 | 21.122 | 0.911 | 25120.787 | 0.833 | -34203.407 |
| 3.766769591654067 | 0.983 | 21.352 | 0.91 | 25512.788 | 0.832 | -34858.439 |
| 3.769911184307656 | 0.983 | 21.584 | 0.91 | 25910.59 | 0.83 | -35524.988 |
| 3.773052776961246 | 0.982 | 21.817 | 0.909 | 26314.274 | 0.828 | -36203.242 |
| 3.776194369614835 | 0.982 | 22.053 | 0.908 | 26723.922 | 0.827 | -36893.391 |
| 3.779335962268425 | 0.982 | 22.29 | 0.907 | 27139.619 | 0.825 | -37595.627 |
| 3.782477554922014 | 0.982 | 22.529 | 0.906 | 27561.449 | 0.824 | -38310.147 |
| 3.785619147575604 | 0.982 | 22.77 | 0.905 | 27989.497 | 0.822 | -39037.15 |
| 3.788760740229193 | 0.982 | 23.013 | 0.905 | 28423.849 | 0.82 | -39776.839 |
| 3.791902332882783 | 0.982 | 23.258 | 0.904 | 28864.595 | 0.819 | -40529.417 |
| 3.795043925536373 | 0.981 | 23.504 | 0.903 | 29311.823 | 0.817 | -41295.094 |
| 3.798185518189962 | 0.981 | 23.753 | 0.902 | 29765.623 | 0.815 | -42074.08 |
| 3.801327110843552 | 0.981 | 24.003 | 0.901 | 30226.086 | 0.814 | -42866.591 |
| 3.804468703497142 | 0.981 | 24.255 | 0.9 | 30693.306 | 0.812 | -43672.843 |
| 3.807610296150731 | 0.981 | 24.508 | 0.9 | 31167.375 | 0.81 | -44493.057 |
| 3.810751888804321 | 0.981 | 24.764 | 0.899 | 31648.39 | 0.809 | -45327.459 |
| 3.813893481457911 | 0.98 | 25.021 | 0.898 | 32136.446 | 0.807 | -46176.275 |
| 3.8170350741115 | 0.98 | 25.28 | 0.897 | 32631.641 | 0.805 | -47039.737 |
| 3.82017666676509 | 0.98 | 25.541 | 0.896 | 33134.074 | 0.803 | -47918.078 |
| 3.823318259418679 | 0.98 | 25.804 | 0.895 | 33643.845 | 0.802 | -48811.538 |
| 3.826459852072269 | 0.98 | 26.068 | 0.894 | 34161.055 | 0.8 | -49720.356 |
| 3.829601444725859 | 0.98 | 26.335 | 0.894 | 34685.807 | 0.798 | -50644.779 |
| 3.832743037379448 | 0.979 | 26.603 | 0.893 | 35218.205 | 0.796 | -51585.054 |
| 3.835884630033038 | 0.979 | 26.872 | 0.892 | 35758.355 | 0.795 | -52541.435 |
| 3.839026222686627 | 0.979 | 27.144 | 0.891 | 36306.364 | 0.793 | -53514.177 |
| 3.842167815340217 | 0.979 | 27.417 | 0.89 | 36862.339 | 0.791 | -54503.541 |
| 3.845309407993807 | 0.979 | 27.691 | 0.889 | 37426.391 | 0.789 | -55509.79 |
| 3.848451000647396 | 0.979 | 27.968 | 0.888 | 37998.63 | 0.788 | -56533.191 |
| 3.851592593300986 | 0.979 | 28.246 | 0.887 | 38579.169 | 0.786 | -57574.016 |
| 3.854734185954575 | 0.978 | 28.526 | 0.887 | 39168.122 | 0.784 | -58632.542 |
| 3.857875778608165 | 0.978 | 28.807 | 0.886 | 39765.605 | 0.782 | -59709.046 |
| 3.861017371261755 | 0.978 | 29.09 | 0.885 | 40371.733 | 0.781 | -60803.814 |
| 3.864158963915344 | 0.978 | 29.375 | 0.884 | 40986.626 | 0.779 | -61917.133 |
| 3.867300556568933 | 0.978 | 29.661 | 0.883 | 41610.404 | 0.777 | -63049.295 |
| 3.870442149222523 | 0.978 | 29.948 | 0.882 | 42243.188 | 0.775 | -64200.597 |
| 3.873583741876112 | 0.977 | 30.238 | 0.881 | 42885.102 | 0.773 | -65371.339 |
| 3.876725334529703 | 0.977 | 30.528 | 0.88 | 43536.269 | 0.771 | -66561.827 |
| 3.879866927183292 | 0.977 | 30.821 | 0.88 | 44196.817 | 0.77 | -67772.37 |
| 3.883008519836882 | 0.977 | 31.114 | 0.879 | 44866.872 | 0.768 | -69003.283 |
| 3.886150112490471 | 0.977 | 31.409 | 0.878 | 45546.566 | 0.766 | -70254.883 |
| 3.889291705144061 | 0.977 | 31.706 | 0.877 | 46236.028 | 0.764 | -71527.495 |
| 3.892433297797651 | 0.976 | 32.004 | 0.876 | 46935.393 | 0.762 | -72821.447 |
| 3.89557489045124 | 0.976 | 32.303 | 0.875 | 47644.794 | 0.76 | -74137.071 |
| 3.89871648310483 | 0.976 | 32.604 | 0.874 | 48364.368 | 0.759 | -75474.706 |
| 3.901858075758419 | 0.976 | 32.906 | 0.873 | 49094.252 | 0.757 | -76834.693 |
| 3.904999668412009 | 0.976 | 33.209 | 0.872 | 49834.588 | 0.755 | -78217.381 |
| 3.908141261065598 | 0.976 | 33.513 | 0.871 | 50585.517 | 0.753 | -79623.122 |
| 3.911282853719188 | 0.975 | 33.819 | 0.871 | 51347.181 | 0.751 | -81052.273 |
| 3.914424446372778 | 0.975 | 34.125 | 0.87 | 52119.727 | 0.749 | -82505.198 |
| 3.917566039026367 | 0.975 | 34.433 | 0.869 | 52903.301 | 0.747 | -83982.265 |
| 3.920707631679957 | 0.975 | 34.742 | 0.868 | 53698.053 | 0.745 | -85483.847 |
| 3.923849224333547 | 0.975 | 35.052 | 0.867 | 54504.133 | 0.744 | -87010.324 |
| 3.926990816987136 | 0.975 | 35.363 | 0.866 | 55321.695 | 0.742 | -88562.078 |
| 3.930132409640726 | 0.975 | 35.675 | 0.865 | 56150.893 | 0.74 | -90139.502 |
| 3.933274002294315 | 0.974 | 35.988 | 0.864 | 56991.885 | 0.738 | -91742.988 |
| 3.936415594947905 | 0.974 | 36.302 | 0.863 | 57844.828 | 0.736 | -93372.94 |
| 3.939557187601495 | 0.974 | 36.617 | 0.862 | 58709.884 | 0.734 | -95029.763 |
| 3.942698780255084 | 0.974 | 36.932 | 0.861 | 59587.215 | 0.732 | -96713.871 |
| 3.945840372908674 | 0.974 | 37.249 | 0.861 | 60476.987 | 0.73 | -98425.681 |
| 3.948981965562263 | 0.974 | 37.565 | 0.86 | 61379.367 | 0.728 | -100165.62 |
| 3.952123558215853 | 0.973 | 37.883 | 0.859 | 62294.523 | 0.726 | -101934.117 |
| 3.955265150869442 | 0.973 | 38.201 | 0.858 | 63222.627 | 0.724 | -103731.609 |
| 3.958406743523032 | 0.973 | 38.52 | 0.857 | 64163.853 | 0.722 | -105558.539 |
| 3.961548336176622 | 0.973 | 38.839 | 0.856 | 65118.376 | 0.72 | -107415.357 |
| 3.964689928830211 | 0.973 | 39.159 | 0.855 | 66086.373 | 0.718 | -109302.518 |
| 3.967831521483801 | 0.973 | 39.479 | 0.854 | 67068.026 | 0.716 | -111220.485 |
| 3.97097311413739 | 0.972 | 39.799 | 0.853 | 68063.517 | 0.714 | -113169.727 |
| 3.97411470679098 | 0.972 | 40.12 | 0.852 | 69073.029 | 0.712 | -115150.719 |
| 3.97725629944457 | 0.972 | 40.44 | 0.851 | 70096.751 | 0.711 | -117163.943 |
| 3.98039789209816 | 0.972 | 40.761 | 0.85 | 71134.871 | 0.709 | -119209.888 |
| 3.983539484751749 | 0.972 | 41.082 | 0.85 | 72187.582 | 0.707 | -121289.051 |
| 3.986681077405338 | 0.972 | 41.403 | 0.849 | 73255.077 | 0.705 | -123401.935 |
| 3.989822670058928 | 0.971 | 41.724 | 0.848 | 74337.553 | 0.703 | -125549.049 |
| 3.992964262712517 | 0.971 | 42.045 | 0.847 | 75435.209 | 0.701 | -127730.911 |
| 3.996105855366107 | 0.971 | 42.365 | 0.846 | 76548.247 | 0.699 | -129948.046 |
| 3.999247448019697 | 0.971 | 42.685 | 0.845 | 77676.872 | 0.697 | -132200.986 |
| 4.002389040673287 | 0.971 | 43.005 | 0.844 | 78821.288 | 0.695 | -134490.269 |
| 4.005530633326877 | 0.971 | 43.324 | 0.843 | 79981.707 | 0.693 | -136816.445 |
| 4.008672225980466 | 0.97 | 43.643 | 0.842 | 81158.339 | 0.691 | -139180.066 |
| 4.011813818634056 | 0.97 | 43.961 | 0.841 | 82351.4 | 0.688 | -141581.696 |
| 4.014955411287645 | 0.97 | 44.279 | 0.84 | 83561.106 | 0.686 | -144021.906 |
| 4.018097003941234 | 0.97 | 44.595 | 0.839 | 84787.677 | 0.684 | -146501.273 |
| 4.021238596594824 | 0.97 | 44.911 | 0.839 | 86031.337 | 0.682 | -149020.385 |
| 4.024380189248414 | 0.97 | 45.226 | 0.838 | 87292.309 | 0.68 | -151579.836 |
| 4.027521781902004 | 0.97 | 45.539 | 0.837 | 88570.824 | 0.678 | -154180.229 |
| 4.030663374555593 | 0.969 | 45.851 | 0.836 | 89867.112 | 0.676 | -156822.177 |
| 4.033804967209183 | 0.969 | 46.162 | 0.835 | 91181.406 | 0.674 | -159506.298 |
| 4.036946559862773 | 0.969 | 46.472 | 0.834 | 92513.944 | 0.672 | -162233.222 |
| 4.040088152516362 | 0.969 | 46.78 | 0.833 | 93864.966 | 0.67 | -165003.587 |
| 4.043229745169951 | 0.969 | 47.087 | 0.832 | 95234.713 | 0.668 | -167818.037 |
| 4.046371337823541 | 0.969 | 47.392 | 0.831 | 96623.433 | 0.666 | -170677.23 |
| 4.049512930477131 | 0.968 | 47.695 | 0.83 | 98031.374 | 0.664 | -173581.829 |
| 4.05265452313072 | 0.968 | 47.996 | 0.829 | 99458.788 | 0.662 | -176532.509 |
| 4.05579611578431 | 0.968 | 48.294 | 0.828 | 100905.93 | 0.66 | -179529.951 |
| 4.0589377084379 | 0.968 | 48.591 | 0.828 | 102373.058 | 0.658 | -182574.849 |
| 4.062079301091489 | 0.968 | 48.886 | 0.827 | 103860.434 | 0.656 | -185667.904 |
| 4.065220893745079 | 0.968 | 49.178 | 0.826 | 105368.322 | 0.654 | -188809.829 |
| 4.068362486398668 | 0.967 | 49.467 | 0.825 | 106896.991 | 0.652 | -192001.344 |
| 4.071504079052258 | 0.967 | 49.753 | 0.824 | 108446.71 | 0.649 | -195243.182 |
| 4.074645671705848 | 0.967 | 50.037 | 0.823 | 110017.756 | 0.647 | -198536.084 |
| 4.077787264359437 | 0.967 | 50.318 | 0.822 | 111610.405 | 0.645 | -201880.801 |
| 4.080928857013027 | 0.967 | 50.596 | 0.821 | 113224.94 | 0.643 | -205278.097 |
| 4.084070449666616 | 0.967 | 50.87 | 0.82 | 114861.645 | 0.641 | -208728.744 |
| 4.087212042320206 | 0.967 | 51.141 | 0.819 | 116520.809 | 0.639 | -212233.524 |
| 4.090353634973795 | 0.966 | 51.408 | 0.818 | 118202.723 | 0.637 | -215793.233 |
| 4.093495227627385 | 0.966 | 51.672 | 0.817 | 119907.682 | 0.635 | -219408.674 |
| 4.096636820280975 | 0.966 | 51.931 | 0.817 | 121635.986 | 0.633 | -223080.665 |
| 4.099778412934564 | 0.966 | 52.187 | 0.816 | 123387.938 | 0.631 | -226810.031 |
| 4.102920005588154 | 0.966 | 52.438 | 0.815 | 125163.844 | 0.628 | -230597.612 |
| 4.106061598241744 | 0.966 | 52.685 | 0.814 | 126964.014 | 0.626 | -234444.258 |
| 4.109203190895333 | 0.965 | 52.927 | 0.813 | 128788.763 | 0.624 | -238350.829 |
| 4.112344783548923 | 0.965 | 53.165 | 0.812 | 130638.408 | 0.622 | -242318.199 |
| 4.115486376202512 | 0.965 | 53.397 | 0.811 | 132513.27 | 0.62 | -246347.254 |
| 4.118627968856102 | 0.965 | 53.625 | 0.81 | 134413.676 | 0.618 | -250438.89 |
| 4.121769561509692 | 0.965 | 53.847 | 0.809 | 136339.955 | 0.616 | -254594.017 |
| 4.124911154163281 | 0.965 | 54.064 | 0.808 | 138292.44 | 0.614 | -258813.557 |
| 4.128052746816871 | 0.965 | 54.275 | 0.808 | 140271.47 | 0.611 | -263098.443 |
| 4.13119433947046 | 0.964 | 54.479 | 0.807 | 142277.387 | 0.609 | -267449.624 |
| 4.13433593212405 | 0.964 | 54.678 | 0.806 | 144310.535 | 0.607 | -271868.058 |
| 4.13747752477764 | 0.964 | 54.871 | 0.805 | 146371.266 | 0.605 | -276354.718 |
| 4.14061911743123 | 0.964 | 55.057 | 0.804 | 148459.934 | 0.603 | -280910.591 |
| 4.143760710084818 | 0.964 | 55.236 | 0.803 | 150576.897 | 0.601 | -285536.676 |
| 4.146902302738408 | 0.964 | 55.408 | 0.802 | 152722.519 | 0.599 | -290233.985 |
| 4.150043895391998 | 0.964 | 55.573 | 0.801 | 154897.167 | 0.597 | -295003.545 |
| 4.153185488045588 | 0.963 | 55.73 | 0.8 | 157101.213 | 0.594 | -299846.396 |
| 4.156327080699177 | 0.963 | 55.88 | 0.8 | 159335.034 | 0.592 | -304763.593 |
| 4.159468673352766 | 0.963 | 56.022 | 0.799 | 161599.01 | 0.59 | -309756.204 |
| 4.162610266006356 | 0.963 | 56.156 | 0.798 | 163893.527 | 0.588 | -314825.312 |
| 4.165751858659946 | 0.963 | 56.281 | 0.797 | 166218.976 | 0.586 | -319972.014 |
| 4.168893451313535 | 0.963 | 56.397 | 0.796 | 168575.751 | 0.584 | -325197.423 |
| 4.172035043967125 | 0.963 | 56.505 | 0.795 | 170964.253 | 0.582 | -330502.665 |
| 4.175176636620715 | 0.962 | 56.603 | 0.794 | 173384.885 | 0.579 | -335888.883 |
| 4.178318229274304 | 0.962 | 56.692 | 0.793 | 175838.057 | 0.577 | -341357.234 |
| 4.181459821927894 | 0.962 | 56.771 | 0.793 | 178324.183 | 0.575 | -346908.891 |
| 4.184601414581484 | 0.962 | 56.839 | 0.792 | 180843.683 | 0.573 | -352545.043 |
| 4.187743007235073 | 0.962 | 56.898 | 0.791 | 183396.982 | 0.571 | -358266.895 |
| 4.190884599888663 | 0.962 | 56.946 | 0.79 | 185984.508 | 0.569 | -364075.666 |
| 4.194026192542252 | 0.962 | 56.982 | 0.789 | 188606.696 | 0.567 | -369972.594 |
| 4.197167785195842 | 0.961 | 57.008 | 0.788 | 191263.987 | 0.564 | -375958.932 |
| 4.200309377849432 | 0.961 | 57.022 | 0.787 | 193956.825 | 0.562 | -382035.951 |
| 4.203450970503021 | 0.961 | 57.024 | 0.787 | 196685.661 | 0.56 | -388204.936 |
| 4.206592563156611 | 0.961 | 57.014 | 0.786 | 199450.95 | 0.558 | -394467.193 |
| 4.2097341558102 | 0.961 | 56.991 | 0.785 | 202253.155 | 0.556 | -400824.041 |
| 4.21287574846379 | 0.961 | 56.955 | 0.784 | 205092.741 | 0.554 | -407276.821 |
| 4.21601734111738 | 0.961 | 56.906 | 0.783 | 207970.181 | 0.551 | -413826.889 |
| 4.21915893377097 | 0.96 | 56.844 | 0.782 | 210885.953 | 0.549 | -420475.619 |
| 4.222300526424559 | 0.96 | 56.767 | 0.782 | 213840.542 | 0.547 | -427224.404 |
| 4.225442119078148 | 0.96 | 56.676 | 0.781 | 216834.436 | 0.545 | -434074.656 |
| 4.228583711731738 | 0.96 | 56.571 | 0.78 | 219868.13 | 0.543 | -441027.803 |
| 4.231725304385327 | 0.96 | 56.45 | 0.779 | 222942.127 | 0.541 | -448085.295 |
| 4.234866897038917 | 0.96 | 56.314 | 0.778 | 226056.933 | 0.539 | -455248.599 |
| 4.238008489692506 | 0.96 | 56.162 | 0.777 | 229213.062 | 0.536 | -462519.203 |
| 4.241150082346096 | 0.959 | 55.994 | 0.777 | 232411.032 | 0.534 | -469898.613 |
| 4.244291674999685 | 0.959 | 55.809 | 0.776 | 235651.37 | 0.532 | -477388.355 |
| 4.247433267653276 | 0.959 | 55.607 | 0.775 | 238934.607 | 0.53 | -484989.977 |
| 4.250574860306865 | 0.959 | 55.387 | 0.774 | 242261.281 | 0.528 | -492705.045 |
| 4.253716452960455 | 0.959 | 55.15 | 0.773 | 245631.937 | 0.526 | -500535.146 |
| 4.256858045614044 | 0.959 | 54.894 | 0.773 | 249047.125 | 0.524 | -508481.888 |
| 4.259999638267634 | 0.959 | 54.619 | 0.772 | 252507.403 | 0.522 | -516546.902 |
| 4.263141230921224 | 0.959 | 54.325 | 0.771 | 256013.334 | 0.519 | -524731.836 |
| 4.266282823574813 | 0.958 | 54.011 | 0.77 | 259565.491 | 0.517 | -533038.365 |
| 4.269424416228403 | 0.958 | 53.677 | 0.769 | 263164.449 | 0.515 | -541468.181 |
| 4.272566008881992 | 0.958 | 53.322 | 0.769 | 266810.793 | 0.513 | -550023 |
| 4.275707601535582 | 0.958 | 52.946 | 0.768 | 270505.114 | 0.511 | -558704.562 |
| 4.27884919418917 | 0.958 | 52.549 | 0.767 | 274248.011 | 0.509 | -567514.627 |
| 4.28199078684276 | 0.958 | 52.129 | 0.766 | 278040.088 | 0.507 | -576454.98 |
| 4.285132379496351 | 0.958 | 51.686 | 0.765 | 281881.957 | 0.505 | -585527.427 |
| 4.28827397214994 | 0.958 | 51.22 | 0.765 | 285774.239 | 0.502 | -594733.799 |
| 4.29141556480353 | 0.957 | 50.73 | 0.764 | 289717.559 | 0.5 | -604075.952 |
| 4.294557157457119 | 0.957 | 50.216 | 0.763 | 293712.552 | 0.498 | -613555.763 |
| 4.29769875011071 | 0.957 | 49.678 | 0.762 | 297759.859 | 0.496 | -623175.136 |
| 4.300840342764299 | 0.957 | 49.113 | 0.762 | 301860.129 | 0.494 | -632935.998 |
| 4.303981935417888 | 0.957 | 48.523 | 0.761 | 306014.019 | 0.492 | -642840.302 |
| 4.307123528071478 | 0.957 | 47.906 | 0.76 | 310222.194 | 0.49 | -652890.025 |
| 4.310265120725067 | 0.957 | 47.262 | 0.759 | 314485.325 | 0.488 | -663087.172 |
| 4.313406713378657 | 0.957 | 46.59 | 0.759 | 318804.092 | 0.486 | -673433.771 |
| 4.316548306032247 | 0.956 | 45.889 | 0.758 | 323179.184 | 0.484 | -683931.877 |
| 4.319689898685836 | 0.956 | 45.16 | 0.757 | 327611.296 | 0.481 | -694583.573 |
| 4.322831491339426 | 0.956 | 44.4 | 0.756 | 332101.132 | 0.479 | -705390.968 |
| 4.325973083993015 | 0.956 | 43.611 | 0.756 | 336649.405 | 0.477 | -716356.197 |
| 4.329114676646605 | 0.956 | 42.79 | 0.755 | 341256.835 | 0.475 | -727481.423 |
| 4.332256269300195 | 0.956 | 41.938 | 0.754 | 345924.152 | 0.473 | -738768.838 |
| 4.335397861953784 | 0.956 | 41.053 | 0.753 | 350652.092 | 0.471 | -750220.662 |
| 4.338539454607374 | 0.956 | 40.136 | 0.753 | 355441.402 | 0.469 | -761839.141 |
| 4.341681047260963 | 0.956 | 39.184 | 0.752 | 360292.837 | 0.467 | -773626.553 |
| 4.344822639914553 | 0.955 | 38.198 | 0.751 | 365207.159 | 0.465 | -785585.202 |
| 4.347964232568143 | 0.955 | 37.177 | 0.751 | 370185.143 | 0.463 | -797717.425 |
| 4.351105825221732 | 0.955 | 36.12 | 0.75 | 375227.568 | 0.461 | -810025.586 |
| 4.354247417875322 | 0.955 | 35.027 | 0.749 | 380335.226 | 0.459 | -822512.081 |
| 4.357389010528911 | 0.955 | 33.895 | 0.749 | 385508.915 | 0.457 | -835179.336 |
| 4.360530603182501 | 0.955 | 32.726 | 0.748 | 390749.445 | 0.455 | -848029.806 |
| 4.36367219583609 | 0.955 | 31.517 | 0.747 | 396057.634 | 0.453 | -861065.981 |
| 4.36681378848968 | 0.955 | 30.269 | 0.747 | 401434.31 | 0.451 | -874290.381 |
| 4.36995538114327 | 0.955 | 28.98 | 0.746 | 406880.31 | 0.449 | -887705.556 |
| 4.373096973796859 | 0.955 | 27.649 | 0.745 | 412396.48 | 0.447 | -901314.092 |
| 4.376238566450449 | 0.954 | 26.276 | 0.745 | 417983.678 | 0.445 | -915118.605 |
| 4.379380159104038 | 0.954 | 24.86 | 0.744 | 423642.769 | 0.443 | -929121.746 |
| 4.382521751757628 | 0.954 | 23.399 | 0.743 | 429374.632 | 0.441 | -943326.199 |
| 4.385663344411217 | 0.954 | 21.894 | 0.743 | 435180.151 | 0.439 | -957734.681 |
| 4.388804937064807 | 0.954 | 20.343 | 0.742 | 441060.225 | 0.437 | -972349.946 |
| 4.391946529718397 | 0.954 | 18.745 | 0.741 | 447015.759 | 0.435 | -987174.78 |
| 4.395088122371987 | 0.954 | 17.099 | 0.741 | 453047.673 | 0.433 | -1002212.005 |
| 4.398229715025576 | 0.954 | 15.404 | 0.74 | 459156.894 | 0.431 | -1017464.481 |
| 4.401371307679165 | 0.954 | 13.66 | 0.739 | 465344.36 | 0.429 | -1032935.1 |
| 4.404512900332755 | 0.954 | 11.865 | 0.739 | 471611.022 | 0.427 | -1048626.794 |
| 4.407654492986345 | 0.953 | 10.018 | 0.738 | 477957.84 | 0.425 | -1064542.53 |
| 4.410796085639934 | 0.953 | 8.119 | 0.738 | 484385.785 | 0.424 | -1080685.314 |
| 4.413937678293524 | 0.953 | 6.166 | 0.737 | 490895.841 | 0.422 | -1097058.187 |
| 4.417079270947114 | 0.953 | 4.158 | 0.736 | 497489 | 0.42 | -1113664.231 |
| 4.420220863600703 | 0.953 | 2.094 | 0.736 | 504166.268 | 0.418 | -1130506.566 |
| 4.423362456254293 | 0.953 | -0.027 | 0.735 | 510928.662 | 0.416 | -1147588.351 |
| 4.426504048907883 | 0.953 | -2.206 | 0.735 | 517777.211 | 0.414 | -1164912.783 |
| 4.429645641561472 | 0.953 | -4.443 | 0.734 | 524712.953 | 0.412 | -1182483.102 |
| 4.432787234215062 | 0.953 | -6.742 | 0.734 | 531736.942 | 0.411 | -1200302.587 |
| 4.435928826868651 | 0.953 | -9.101 | 0.733 | 538850.241 | 0.409 | -1218374.557 |
| 4.43907041952224 | 0.953 | -11.524 | 0.732 | 546053.926 | 0.407 | -1236702.375 |
| 4.44221201217583 | 0.952 | -14.01 | 0.732 | 553349.085 | 0.405 | -1255289.445 |
| 4.44535360482942 | 0.952 | -16.561 | 0.731 | 560736.82 | 0.403 | -1274139.211 |
| 4.44849519748301 | 0.952 | -19.179 | 0.731 | 568218.243 | 0.402 | -1293255.164 |
| 4.4516367901366 | 0.952 | -21.864 | 0.73 | 575794.48 | 0.4 | -1312640.835 |
| 4.454778382790188 | 0.952 | -24.617 | 0.73 | 583466.67 | 0.398 | -1332299.802 |
| 4.457919975443779 | 0.952 | -27.441 | 0.729 | 591235.965 | 0.396 | -1352235.686 |
| 4.461061568097368 | 0.952 | -30.337 | 0.729 | 599103.529 | 0.395 | -1372452.152 |
| 4.464203160750958 | 0.952 | -33.305 | 0.728 | 607070.539 | 0.393 | -1392952.913 |
| 4.467344753404547 | 0.952 | -36.347 | 0.728 | 615138.187 | 0.391 | -1413741.725 |
| 4.470486346058137 | 0.952 | -39.465 | 0.727 | 623307.679 | 0.389 | -1434822.394 |
| 4.473627938711726 | 0.952 | -42.659 | 0.727 | 631580.231 | 0.388 | -1456198.771 |
| 4.476769531365316 | 0.952 | -45.932 | 0.726 | 639957.076 | 0.386 | -1477874.754 |
| 4.479911124018905 | 0.951 | -49.284 | 0.726 | 648439.46 | 0.384 | -1499854.292 |
| 4.483052716672495 | 0.951 | -52.718 | 0.725 | 657028.643 | 0.383 | -1522141.381 |
| 4.486194309326085 | 0.951 | -56.235 | 0.725 | 665725.899 | 0.381 | -1544740.066 |
| 4.489335901979674 | 0.951 | -59.835 | 0.724 | 674532.517 | 0.38 | -1567654.442 |
| 4.492477494633264 | 0.951 | -63.522 | 0.724 | 683449.8 | 0.378 | -1590888.656 |
| 4.495619087286854 | 0.951 | -67.296 | 0.723 | 692479.066 | 0.376 | -1614446.905 |
| 4.498760679940443 | 0.951 | -71.158 | 0.723 | 701621.647 | 0.375 | -1638333.438 |
| 4.501902272594033 | 0.951 | -75.111 | 0.722 | 710878.891 | 0.373 | -1662552.556 |
| 4.505043865247622 | 0.951 | -79.156 | 0.722 | 720252.161 | 0.372 | -1687108.613 |
| 4.508185457901212 | 0.951 | -83.295 | 0.721 | 729742.835 | 0.37 | -1712006.017 |
| 4.511327050554801 | 0.951 | -87.53 | 0.721 | 739352.307 | 0.369 | -1737249.229 |
| 4.514468643208391 | 0.951 | -91.862 | 0.721 | 749081.985 | 0.367 | -1762842.765 |
| 4.517610235861981 | 0.951 | -96.292 | 0.72 | 758933.295 | 0.366 | -1788791.198 |
| 4.520751828515571 | 0.951 | -100.823 | 0.72 | 768907.677 | 0.364 | -1815099.156 |
| 4.52389342116916 | 0.951 | -105.457 | 0.719 | 779006.589 | 0.363 | -1841771.321 |
| 4.52703501382275 | 0.95 | -110.195 | 0.719 | 789231.504 | 0.361 | -1868812.438 |
| 4.530176606476339 | 0.95 | -115.039 | 0.719 | 799583.911 | 0.36 | -1896227.304 |
| 4.533318199129928 | 0.95 | -119.991 | 0.718 | 810065.318 | 0.359 | -1924020.779 |
| 4.536459791783518 | 0.95 | -125.053 | 0.718 | 820677.248 | 0.357 | -1952197.78 |
| 4.539601384437108 | 0.95 | -130.227 | 0.717 | 831421.241 | 0.356 | -1980763.285 |
| 4.542742977090698 | 0.95 | -135.514 | 0.717 | 842298.854 | 0.354 | -2009722.331 |
| 4.545884569744287 | 0.95 | -140.918 | 0.717 | 853311.662 | 0.353 | -2039080.019 |
| 4.549026162397876 | 0.95 | -146.439 | 0.716 | 864461.258 | 0.352 | -2068841.51 |
| 4.552167755051466 | 0.95 | -152.08 | 0.716 | 875749.253 | 0.351 | -2099012.028 |
| 4.555309347705056 | 0.95 | -157.843 | 0.716 | 887177.273 | 0.349 | -2129596.861 |
| 4.558450940358646 | 0.95 | -163.73 | 0.715 | 898746.965 | 0.348 | -2160601.361 |
| 4.561592533012235 | 0.95 | -169.743 | 0.715 | 910459.993 | 0.347 | -2192030.946 |
| 4.564734125665825 | 0.95 | -175.884 | 0.715 | 922318.041 | 0.346 | -2223891.097 |
| 4.567875718319415 | 0.95 | -182.156 | 0.714 | 934322.81 | 0.344 | -2256187.363 |
| 4.571017310973004 | 0.95 | -188.561 | 0.714 | 946476.02 | 0.343 | -2288925.361 |
| 4.574158903626594 | 0.95 | -195.1 | 0.714 | 958779.411 | 0.342 | -2322110.775 |
| 4.577300496280183 | 0.95 | -201.778 | 0.713 | 971234.742 | 0.341 | -2355749.357 |
| 4.580442088933772 | 0.95 | -208.595 | 0.713 | 983843.791 | 0.34 | -2389846.93 |
| 4.583583681587362 | 0.95 | -215.554 | 0.713 | 996608.356 | 0.339 | -2424409.385 |
| 4.586725274240952 | 0.95 | -222.657 | 0.713 | 1009530.254 | 0.338 | -2459442.687 |
| 4.589866866894542 | 0.949 | -229.907 | 0.712 | 1022611.324 | 0.337 | -2494952.871 |
| 4.593008459548131 | 0.949 | -237.307 | 0.712 | 1035853.424 | 0.336 | -2530946.044 |
| 4.596150052201721 | 0.949 | -244.859 | 0.712 | 1049258.432 | 0.335 | -2567428.388 |
| 4.59929164485531 | 0.949 | -252.565 | 0.712 | 1062828.247 | 0.334 | -2604406.159 |
| 4.6024332375089 | 0.949 | -260.429 | 0.711 | 1076564.791 | 0.333 | -2641885.687 |
| 4.60557483016249 | 0.949 | -268.452 | 0.711 | 1090470.005 | 0.332 | -2679873.379 |
| 4.608716422816079 | 0.949 | -276.638 | 0.711 | 1104545.85 | 0.331 | -2718375.72 |
| 4.611858015469668 | 0.949 | -284.988 | 0.711 | 1118794.313 | 0.33 | -2757399.27 |
| 4.614999608123258 | 0.949 | -293.507 | 0.71 | 1133217.398 | 0.329 | -2796950.669 |
| 4.618141200776848 | 0.949 | -302.196 | 0.71 | 1147817.134 | 0.329 | -2837036.636 |
| 4.621282793430437 | 0.949 | -311.059 | 0.71 | 1162595.573 | 0.328 | -2877663.972 |
| 4.624424386084027 | 0.949 | -320.098 | 0.71 | 1177554.786 | 0.327 | -2918839.556 |
| 4.627565978737617 | 0.949 | -329.316 | 0.71 | 1192696.869 | 0.326 | -2960570.354 |
| 4.630707571391206 | 0.949 | -338.717 | 0.709 | 1208023.942 | 0.326 | -3002863.409 |
| 4.633849164044795 | 0.949 | -348.303 | 0.709 | 1223538.146 | 0.325 | -3045725.853 |
| 4.636990756698386 | 0.949 | -358.077 | 0.709 | 1239241.646 | 0.324 | -3089164.901 |
| 4.640132349351975 | 0.949 | -368.042 | 0.709 | 1255136.631 | 0.324 | -3133187.853 |
| 4.643273942005564 | 0.949 | -378.202 | 0.709 | 1271225.315 | 0.323 | -3177802.098 |
| 4.646415534659154 | 0.949 | -388.56 | 0.709 | 1287509.935 | 0.322 | -3223015.11 |
| 4.649557127312744 | 0.949 | -399.118 | 0.708 | 1303992.752 | 0.322 | -3268834.455 |
| 4.652698719966334 | 0.949 | -409.881 | 0.708 | 1320676.052 | 0.321 | -3315267.787 |
| 4.655840312619923 | 0.949 | -420.851 | 0.708 | 1337562.146 | 0.321 | -3362322.85 |
| 4.658981905273513 | 0.949 | -432.032 | 0.708 | 1354653.372 | 0.32 | -3410007.482 |
| 4.662123497927102 | 0.949 | -443.427 | 0.708 | 1371952.089 | 0.32 | -3458329.612 |
| 4.665265090580692 | 0.949 | -455.04 | 0.708 | 1389460.687 | 0.319 | -3507297.262 |
| 4.668406683234282 | 0.949 | -466.875 | 0.708 | 1407181.578 | 0.319 | -3556918.552 |
| 4.671548275887871 | 0.949 | -478.934 | 0.708 | 1425117.202 | 0.319 | -3607201.696 |
| 4.674689868541461 | 0.949 | -491.221 | 0.708 | 1443270.025 | 0.318 | -3658155.004 |
| 4.67783146119505 | 0.949 | -503.74 | 0.708 | 1461642.541 | 0.318 | -3709786.887 |
| 4.68097305384864 | 0.949 | -516.495 | 0.707 | 1480237.268 | 0.318 | -3762105.851 |
| 4.68411464650223 | 0.949 | -529.49 | 0.707 | 1499056.755 | 0.317 | -3815120.506 |
| 4.687256239155819 | 0.949 | -542.728 | 0.707 | 1518103.576 | 0.317 | -3868839.562 |
| 4.690397831809409 | 0.949 | -556.213 | 0.707 | 1537380.334 | 0.317 | -3923271.832 |
| 4.693539424462998 | 0.949 | -569.95 | 0.707 | 1556889.659 | 0.317 | -3978426.23 |
| 4.696681017116588 | 0.949 | -583.941 | 0.707 | 1576634.212 | 0.317 | -4034311.778 |
| 4.699822609770177 | 0.949 | -598.192 | 0.707 | 1596616.681 | 0.316 | -4090937.602 |
| 4.702964202423767 | 0.949 | -612.706 | 0.707 | 1616839.782 | 0.316 | -4148312.937 |
| 4.706105795077356 | 0.949 | -627.487 | 0.707 | 1637306.262 | 0.316 | -4206447.123 |
| 4.709247387730946 | 0.949 | -642.54 | 0.707 | 1658018.897 | 0.316 | -4265349.612 |
| 4.712388980384535 | 0.949 | -657.869 | 0.707 | 1678980.493 | 0.316 | -4325029.966 |
| 4.715530573038126 | 0.949 | -673.478 | 0.707 | 1700193.886 | 0.316 | -4385497.859 |
| 4.718672165691715 | 0.949 | -689.372 | 0.707 | 1721661.944 | 0.316 | -4446763.077 |
| 4.721813758345305 | 0.949 | -705.555 | 0.707 | 1743387.564 | 0.316 | -4508835.522 |
| 4.724955350998894 | 0.949 | -722.031 | 0.707 | 1765373.674 | 0.316 | -4571725.209 |
| 4.728096943652484 | 0.949 | -738.806 | 0.707 | 1787623.235 | 0.317 | -4635442.273 |
| 4.731238536306074 | 0.949 | -755.883 | 0.707 | 1810139.24 | 0.317 | -4699996.966 |
| 4.734380128959663 | 0.949 | -773.268 | 0.707 | 1832924.711 | 0.317 | -4765399.657 |
| 4.737521721613253 | 0.949 | -790.965 | 0.707 | 1855982.707 | 0.317 | -4831660.838 |
| 4.740663314266842 | 0.949 | -808.979 | 0.707 | 1879316.316 | 0.317 | -4898791.123 |
| 4.743804906920432 | 0.949 | -827.315 | 0.707 | 1902928.66 | 0.318 | -4966801.249 |
| 4.74694649957402 | 0.949 | -845.978 | 0.708 | 1926822.897 | 0.318 | -5035702.076 |
| 4.750088092227611 | 0.949 | -864.973 | 0.708 | 1951002.215 | 0.318 | -5105504.594 |
| 4.7532296848812 | 0.949 | -884.306 | 0.708 | 1975469.839 | 0.319 | -5176219.916 |
| 4.75637127753479 | 0.949 | -903.98 | 0.708 | 2000229.027 | 0.319 | -5247859.287 |
| 4.75951287018838 | 0.949 | -924.002 | 0.708 | 2025283.071 | 0.319 | -5320434.08 |
| 4.76265446284197 | 0.949 | -944.377 | 0.708 | 2050635.3 | 0.32 | -5393955.8 |
| 4.765796055495559 | 0.949 | -965.11 | 0.708 | 2076289.079 | 0.32 | -5468436.087 |
| 4.768937648149149 | 0.949 | -986.207 | 0.708 | 2102247.806 | 0.321 | -5543886.712 |
| 4.772079240802738 | 0.949 | -1007.673 | 0.708 | 2128514.917 | 0.321 | -5620319.586 |
| 4.775220833456327 | 0.949 | -1029.515 | 0.708 | 2155093.886 | 0.322 | -5697746.753 |
| 4.778362426109917 | 0.949 | -1051.736 | 0.709 | 2181988.22 | 0.322 | -5776180.4 |
| 4.781504018763507 | 0.949 | -1074.344 | 0.709 | 2209201.468 | 0.323 | -5855632.851 |
| 4.784645611417097 | 0.949 | -1097.344 | 0.709 | 2236737.213 | 0.324 | -5936116.574 |
| 4.787787204070686 | 0.949 | -1120.743 | 0.709 | 2264599.079 | 0.324 | -6017644.18 |
| 4.790928796724275 | 0.949 | -1144.545 | 0.709 | 2292790.725 | 0.325 | -6100228.424 |
| 4.794070389377865 | 0.949 | -1168.758 | 0.709 | 2321315.853 | 0.326 | -6183882.208 |
| 4.797211982031455 | 0.949 | -1193.387 | 0.71 | 2350178.2 | 0.326 | -6268618.584 |
| 4.800353574685045 | 0.949 | -1218.439 | 0.71 | 2379381.546 | 0.327 | -6354450.75 |
| 4.803495167338634 | 0.949 | -1243.919 | 0.71 | 2408929.709 | 0.328 | -6441392.059 |
| 4.806636759992224 | 0.949 | -1269.836 | 0.71 | 2438826.549 | 0.329 | -6529456.014 |
| 4.809778352645814 | 0.949 | -1296.194 | 0.71 | 2469075.965 | 0.329 | -6618656.275 |
| 4.812919945299403 | 0.949 | -1323 | 0.711 | 2499681.899 | 0.33 | -6709006.656 |
| 4.816061537952993 | 0.949 | -1350.262 | 0.711 | 2530648.334 | 0.331 | -6800521.13 |
| 4.819203130606582 | 0.949 | -1377.986 | 0.711 | 2561979.294 | 0.332 | -6893213.83 |
| 4.822344723260172 | 0.949 | -1406.179 | 0.711 | 2593678.846 | 0.333 | -6987099.05 |
| 4.825486315913761 | 0.949 | -1434.847 | 0.712 | 2625751.102 | 0.334 | -7082191.246 |
| 4.828627908567351 | 0.949 | -1463.999 | 0.712 | 2658200.214 | 0.335 | -7178505.041 |
| 4.83176950122094 | 0.949 | -1493.64 | 0.712 | 2691030.38 | 0.336 | -7276055.223 |
| 4.83491109387453 | 0.949 | -1523.779 | 0.712 | 2724245.841 | 0.337 | -7374856.747 |
| 4.83805268652812 | 0.95 | -1554.422 | 0.713 | 2757850.884 | 0.338 | -7474924.741 |
| 4.841194279181709 | 0.95 | -1585.578 | 0.713 | 2791849.84 | 0.339 | -7576274.504 |
| 4.844335871835299 | 0.95 | -1617.253 | 0.713 | 2826247.086 | 0.34 | -7678921.506 |
| 4.847477464488889 | 0.95 | -1649.455 | 0.713 | 2861047.043 | 0.341 | -7782881.398 |
| 4.850619057142478 | 0.95 | -1682.192 | 0.714 | 2896254.182 | 0.342 | -7888170.003 |
| 4.853760649796068 | 0.95 | -1715.472 | 0.714 | 2931873.018 | 0.343 | -7994803.327 |
| 4.856902242449657 | 0.95 | -1749.303 | 0.714 | 2967908.115 | 0.344 | -8102797.556 |
| 4.860043835103247 | 0.95 | -1783.692 | 0.715 | 3004364.084 | 0.346 | -8212169.058 |
| 4.863185427756837 | 0.95 | -1818.649 | 0.715 | 3041245.584 | 0.347 | -8322934.389 |
| 4.866327020410426 | 0.95 | -1854.18 | 0.715 | 3078557.323 | 0.348 | -8435110.289 |
| 4.869468613064015 | 0.95 | -1890.295 | 0.716 | 3116304.059 | 0.349 | -8548713.69 |
| 4.872610205717605 | 0.95 | -1927.003 | 0.716 | 3154490.599 | 0.351 | -8663761.713 |
| 4.875751798371195 | 0.95 | -1964.311 | 0.716 | 3193121.8 | 0.352 | -8780271.672 |
| 4.878893391024784 | 0.95 | -2002.228 | 0.717 | 3232202.571 | 0.353 | -8898261.078 |
| 4.882034983678374 | 0.95 | -2040.763 | 0.717 | 3271737.87 | 0.354 | -9017747.637 |
| 4.885176576331964 | 0.95 | -2079.926 | 0.717 | 3311732.709 | 0.356 | -9138749.257 |
| 4.888318168985553 | 0.95 | -2119.725 | 0.718 | 3352192.151 | 0.357 | -9261284.044 |
| 4.891459761639143 | 0.95 | -2160.169 | 0.718 | 3393121.311 | 0.359 | -9385370.311 |
| 4.894601354292733 | 0.95 | -2201.268 | 0.719 | 3434525.36 | 0.36 | -9511026.574 |
| 4.897742946946322 | 0.95 | -2243.03 | 0.719 | 3476409.519 | 0.361 | -9638271.558 |
| 4.900884539599912 | 0.951 | -2285.467 | 0.719 | 3518779.067 | 0.363 | -9767124.198 |
| 4.904026132253501 | 0.951 | -2328.586 | 0.72 | 3561639.334 | 0.364 | -9897603.641 |
| 4.907167724907091 | 0.951 | -2372.398 | 0.72 | 3604995.71 | 0.366 | -10029729.248 |
| 4.91030931756068 | 0.951 | -2416.914 | 0.721 | 3648853.636 | 0.367 | -10163520.598 |
| 4.91345091021427 | 0.951 | -2462.142 | 0.721 | 3693218.613 | 0.369 | -10298997.488 |
| 4.91659250286786 | 0.951 | -2508.094 | 0.721 | 3738096.198 | 0.37 | -10436179.937 |
| 4.91973409552145 | 0.951 | -2554.778 | 0.722 | 3783492.004 | 0.372 | -10575088.187 |
| 4.922875688175039 | 0.951 | -2602.207 | 0.722 | 3829411.705 | 0.373 | -10715742.705 |
| 4.926017280828628 | 0.951 | -2650.39 | 0.723 | 3875861.032 | 0.375 | -10858164.189 |
| 4.929158873482218 | 0.951 | -2699.338 | 0.723 | 3922845.775 | 0.376 | -11002373.565 |
| 4.932300466135808 | 0.951 | -2749.062 | 0.724 | 3970371.784 | 0.378 | -11148391.994 |
| 4.935442058789397 | 0.951 | -2799.573 | 0.724 | 4018444.97 | 0.38 | -11296240.871 |
| 4.938583651442987 | 0.951 | -2850.882 | 0.725 | 4067071.305 | 0.381 | -11445941.83 |
| 4.941725244096576 | 0.951 | -2903 | 0.725 | 4116256.822 | 0.383 | -11597516.745 |
| 4.944866836750166 | 0.951 | -2955.939 | 0.726 | 4166007.616 | 0.384 | -11750987.734 |
| 4.948008429403755 | 0.952 | -3009.71 | 0.726 | 4216329.847 | 0.386 | -11906377.16 |
| 4.951150022057345 | 0.952 | -3064.325 | 0.727 | 4267229.735 | 0.388 | -12063707.633 |
| 4.954291614710935 | 0.952 | -3119.796 | 0.727 | 4318713.567 | 0.389 | -12223002.015 |
| 4.957433207364524 | 0.952 | -3176.134 | 0.728 | 4370787.692 | 0.391 | -12384283.421 |
| 4.960574800018114 | 0.952 | -3233.353 | 0.728 | 4423458.528 | 0.393 | -12547575.221 |
| 4.963716392671704 | 0.952 | -3291.464 | 0.729 | 4476732.554 | 0.395 | -12712901.045 |
| 4.966857985325293 | 0.952 | -3350.479 | 0.729 | 4530616.32 | 0.396 | -12880284.783 |
| 4.969999577978883 | 0.952 | -3410.412 | 0.73 | 4585116.441 | 0.398 | -13049750.59 |
| 4.973141170632472 | 0.952 | -3471.275 | 0.73 | 4640239.6 | 0.4 | -13221322.887 |
| 4.976282763286062 | 0.952 | -3533.081 | 0.731 | 4695992.548 | 0.402 | -13395026.364 |
| 4.979424355939651 | 0.952 | -3595.843 | 0.731 | 4752382.107 | 0.403 | -13570885.985 |
| 4.982565948593241 | 0.952 | -3659.575 | 0.732 | 4809415.168 | 0.405 | -13748926.988 |
| 4.985707541246831 | 0.953 | -3724.289 | 0.732 | 4867098.691 | 0.407 | -13929174.887 |
| 4.98884913390042 | 0.953 | -3790 | 0.733 | 4925439.709 | 0.409 | -14111655.481 |
| 4.99199072655401 | 0.953 | -3856.721 | 0.734 | 4984445.326 | 0.411 | -14296394.848 |
| 4.9951323192076 | 0.953 | -3924.466 | 0.734 | 5044122.719 | 0.412 | -14483419.356 |
| 4.99827391186119 | 0.953 | -3993.25 | 0.735 | 5104479.138 | 0.414 | -14672755.662 |
| 5.00141550451478 | 0.953 | -4063.086 | 0.735 | 5165521.907 | 0.416 | -14864430.714 |
| 5.004557097168369 | 0.953 | -4133.99 | 0.736 | 5227258.425 | 0.418 | -15058471.756 |
| 5.007698689821958 | 0.953 | -4205.975 | 0.736 | 5289696.166 | 0.42 | -15254906.332 |
| 5.010840282475548 | 0.953 | -4279.057 | 0.737 | 5352842.68 | 0.422 | -15453762.286 |
| 5.013981875129137 | 0.953 | -4353.25 | 0.738 | 5416705.594 | 0.424 | -15655067.769 |
| 5.017123467782727 | 0.953 | -4428.571 | 0.738 | 5481292.613 | 0.425 | -15858851.236 |
| 5.020265060436317 | 0.954 | -4505.034 | 0.739 | 5546611.519 | 0.427 | -16065141.456 |
| 5.023406653089906 | 0.954 | -4582.654 | 0.739 | 5612670.176 | 0.429 | -16273967.513 |
| 5.026548245743496 | 0.954 | -4661.449 | 0.74 | 5679476.524 | 0.431 | -16485358.806 |
| 5.029689838397085 | 0.954 | -4741.433 | 0.741 | 5747038.586 | 0.433 | -16699345.055 |
| 5.032831431050674 | 0.954 | -4822.623 | 0.741 | 5815364.466 | 0.435 | -16915956.305 |
| 5.035973023704264 | 0.954 | -4905.036 | 0.742 | 5884462.349 | 0.437 | -17135222.929 |
| 5.039114616357854 | 0.954 | -4988.687 | 0.743 | 5954340.506 | 0.439 | -17357175.629 |
| 5.042256209011444 | 0.954 | -5073.595 | 0.743 | 6025007.288 | 0.441 | -17581845.441 |
| 5.045397801665033 | 0.954 | -5159.775 | 0.744 | 6096471.133 | 0.443 | -17809263.739 |
| 5.048539394318622 | 0.954 | -5247.245 | 0.745 | 6168740.562 | 0.445 | -18039462.239 |
| 5.051680986972213 | 0.955 | -5336.022 | 0.745 | 6241824.186 | 0.447 | -18272472.999 |
| 5.054822579625802 | 0.955 | -5426.125 | 0.746 | 6315730.698 | 0.449 | -18508328.427 |
| 5.057964172279392 | 0.955 | -5517.57 | 0.747 | 6390468.883 | 0.451 | -18747061.281 |
| 5.061105764932981 | 0.955 | -5610.377 | 0.747 | 6466047.613 | 0.453 | -18988704.673 |
| 5.064247357586571 | 0.955 | -5704.563 | 0.748 | 6542475.848 | 0.455 | -19233292.077 |
| 5.067388950240161 | 0.955 | -5800.147 | 0.749 | 6619762.641 | 0.457 | -19480857.327 |
| 5.07053054289375 | 0.955 | -5897.148 | 0.749 | 6697917.135 | 0.459 | -19731434.621 |
| 5.07367213554734 | 0.955 | -5995.584 | 0.75 | 6776948.564 | 0.461 | -19985058.53 |
| 5.07681372820093 | 0.955 | -6095.475 | 0.751 | 6856866.256 | 0.463 | -20241763.998 |
| 5.079955320854519 | 0.955 | -6196.841 | 0.751 | 6937679.634 | 0.465 | -20501586.343 |
| 5.083096913508108 | 0.956 | -6299.701 | 0.752 | 7019398.212 | 0.467 | -20764561.266 |
| 5.086238506161698 | 0.956 | -6404.075 | 0.753 | 7102031.604 | 0.469 | -21030724.855 |
| 5.089380098815288 | 0.956 | -6509.983 | 0.753 | 7185589.518 | 0.471 | -21300113.582 |
| 5.092521691468877 | 0.956 | -6617.446 | 0.754 | 7270081.759 | 0.473 | -21572764.316 |
| 5.095663284122466 | 0.956 | -6726.484 | 0.755 | 7355518.231 | 0.475 | -21848714.319 |
| 5.098804876776057 | 0.956 | -6837.119 | 0.756 | 7441908.939 | 0.477 | -22128001.256 |
| 5.101946469429646 | 0.956 | -6949.371 | 0.756 | 7529263.984 | 0.479 | -22410663.196 |
| 5.105088062083236 | 0.956 | -7063.262 | 0.757 | 7617593.572 | 0.481 | -22696738.617 |
| 5.108229654736825 | 0.956 | -7178.814 | 0.758 | 7706908.01 | 0.484 | -22986266.408 |
| 5.111371247390415 | 0.957 | -7296.048 | 0.759 | 7797217.707 | 0.486 | -23279285.877 |
| 5.114512840044005 | 0.957 | -7414.988 | 0.759 | 7888533.177 | 0.488 | -23575836.753 |
| 5.117654432697594 | 0.957 | -7535.654 | 0.76 | 7980865.039 | 0.49 | -23875959.189 |
| 5.120796025351184 | 0.957 | -7658.071 | 0.761 | 8074224.018 | 0.492 | -24179693.769 |
| 5.123937618004773 | 0.957 | -7782.262 | 0.762 | 8168620.944 | 0.494 | -24487081.511 |
| 5.127079210658363 | 0.957 | -7908.248 | 0.762 | 8264066.758 | 0.496 | -24798163.871 |
| 5.130220803311953 | 0.957 | -8036.056 | 0.763 | 8360572.509 | 0.498 | -25112982.746 |
| 5.133362395965542 | 0.957 | -8165.707 | 0.764 | 8458149.355 | 0.5 | -25431580.483 |
| 5.136503988619131 | 0.958 | -8297.226 | 0.765 | 8556808.565 | 0.502 | -25753999.879 |
| 5.13964558127272 | 0.958 | -8430.639 | 0.765 | 8656561.523 | 0.505 | -26080284.189 |
| 5.142787173926311 | 0.958 | -8565.968 | 0.766 | 8757419.721 | 0.507 | -26410477.125 |
| 5.1459287665799 | 0.958 | -8703.241 | 0.767 | 8859394.77 | 0.509 | -26744622.869 |
| 5.14907035923349 | 0.958 | -8842.482 | 0.768 | 8962498.395 | 0.511 | -27082766.069 |
| 5.15221195188708 | 0.958 | -8983.716 | 0.769 | 9066742.435 | 0.513 | -27424951.849 |
| 5.15535354454067 | 0.958 | -9126.97 | 0.769 | 9172138.849 | 0.515 | -27771225.815 |
| 5.158495137194259 | 0.958 | -9272.27 | 0.77 | 9278699.714 | 0.517 | -28121634.053 |
| 5.161636729847848 | 0.959 | -9419.642 | 0.771 | 9386437.225 | 0.519 | -28476223.141 |
| 5.164778322501438 | 0.959 | -9569.114 | 0.772 | 9495363.701 | 0.522 | -28835040.148 |
| 5.167919915155028 | 0.959 | -9720.713 | 0.773 | 9605491.58 | 0.524 | -29198132.646 |
| 5.171061507808617 | 0.959 | -9874.467 | 0.773 | 9716833.424 | 0.526 | -29565548.707 |
| 5.174203100462206 | 0.959 | -10030.402 | 0.774 | 9829401.919 | 0.528 | -29937336.914 |
| 5.177344693115796 | 0.959 | -10188.548 | 0.775 | 9943209.877 | 0.53 | -30313546.361 |
| 5.180486285769386 | 0.959 | -10348.933 | 0.776 | 10058270.236 | 0.532 | -30694226.666 |
| 5.183627878422976 | 0.959 | -10511.586 | 0.777 | 10174596.061 | 0.534 | -31079427.965 |
| 5.186769471076565 | 0.96 | -10676.536 | 0.777 | 10292200.546 | 0.536 | -31469200.927 |
| 5.189911063730155 | 0.96 | -10843.813 | 0.778 | 10411097.017 | 0.539 | -31863596.756 |
| 5.193052656383744 | 0.96 | -11013.447 | 0.779 | 10531298.929 | 0.541 | -32262667.193 |
| 5.196194249037334 | 0.96 | -11185.468 | 0.78 | 10652819.871 | 0.543 | -32666464.525 |
| 5.199335841690924 | 0.96 | -11359.907 | 0.781 | 10775673.564 | 0.545 | -33075041.592 |
| 5.202477434344513 | 0.96 | -11536.794 | 0.782 | 10899873.865 | 0.547 | -33488451.787 |
| 5.205619026998103 | 0.96 | -11716.162 | 0.782 | 11025434.767 | 0.549 | -33906749.066 |
| 5.208760619651692 | 0.961 | -11898.041 | 0.783 | 11152370.401 | 0.551 | -34329987.95 |
| 5.211902212305282 | 0.961 | -12082.465 | 0.784 | 11280695.036 | 0.554 | -34758223.536 |
| 5.215043804958871 | 0.961 | -12269.465 | 0.785 | 11410423.082 | 0.556 | -35191511.496 |
| 5.218185397612461 | 0.961 | -12459.075 | 0.786 | 11541569.089 | 0.558 | -35629908.088 |
| 5.221326990266051 | 0.961 | -12651.327 | 0.787 | 11674147.749 | 0.56 | -36073470.158 |
| 5.22446858291964 | 0.961 | -12846.256 | 0.787 | 11808173.901 | 0.562 | -36522255.148 |
| 5.22761017557323 | 0.961 | -13043.895 | 0.788 | 11943662.527 | 0.564 | -36976321.103 |
| 5.23075176822682 | 0.962 | -13244.279 | 0.789 | 12080628.755 | 0.567 | -37435726.673 |
| 5.23389336088041 | 0.962 | -13447.443 | 0.79 | 12219087.863 | 0.569 | -37900531.122 |
| 5.237034953533999 | 0.962 | -13653.422 | 0.791 | 12359055.276 | 0.571 | -38370794.333 |
| 5.240176546187588 | 0.962 | -13862.251 | 0.792 | 12500546.572 | 0.573 | -38846576.815 |
| 5.243318138841178 | 0.962 | -14073.968 | 0.793 | 12643577.48 | 0.575 | -39327939.707 |
| 5.246459731494767 | 0.962 | -14288.608 | 0.793 | 12788163.881 | 0.577 | -39814944.787 |
| 5.249601324148357 | 0.962 | -14506.208 | 0.794 | 12934321.814 | 0.579 | -40307654.477 |
| 5.252742916801947 | 0.963 | -14726.806 | 0.795 | 13082067.472 | 0.582 | -40806131.847 |
| 5.255884509455536 | 0.963 | -14950.439 | 0.796 | 13231417.206 | 0.584 | -41310440.626 |
| 5.259026102109125 | 0.963 | -15177.146 | 0.797 | 13382387.527 | 0.586 | -41820645.204 |
| 5.262167694762715 | 0.963 | -15406.966 | 0.798 | 13534995.106 | 0.588 | -42336810.641 |
| 5.265309287416305 | 0.963 | -15639.937 | 0.799 | 13689256.776 | 0.59 | -42859002.674 |
| 5.268450880069895 | 0.963 | -15876.1 | 0.8 | 13845189.534 | 0.592 | -43387287.72 |
| 5.271592472723484 | 0.963 | -16115.493 | 0.8 | 14002810.543 | 0.594 | -43921732.887 |
| 5.274734065377074 | 0.964 | -16358.159 | 0.801 | 14162137.131 | 0.597 | -44462405.979 |
| 5.277875658030664 | 0.964 | -16604.137 | 0.802 | 14323186.794 | 0.599 | -45009375.502 |
| 5.281017250684253 | 0.964 | -16853.469 | 0.803 | 14485977.199 | 0.601 | -45562710.671 |
| 5.284158843337843 | 0.964 | -17106.198 | 0.804 | 14650526.184 | 0.603 | -46122481.417 |
| 5.287300435991432 | 0.964 | -17362.365 | 0.805 | 14816851.759 | 0.605 | -46688758.397 |
| 5.290442028645022 | 0.964 | -17622.013 | 0.806 | 14984972.109 | 0.607 | -47261612.994 |
| 5.293583621298612 | 0.964 | -17885.187 | 0.807 | 15154905.594 | 0.609 | -47841117.333 |
| 5.296725213952201 | 0.965 | -18151.929 | 0.808 | 15326670.754 | 0.611 | -48427344.28 |
| 5.299866806605791 | 0.965 | -18422.284 | 0.808 | 15500286.305 | 0.614 | -49020367.455 |
| 5.30300839925938 | 0.965 | -18696.298 | 0.809 | 15675771.147 | 0.616 | -49620261.235 |
| 5.30614999191297 | 0.965 | -18974.015 | 0.81 | 15853144.359 | 0.618 | -50227100.765 |
| 5.30929158456656 | 0.965 | -19255.481 | 0.811 | 16032425.206 | 0.62 | -50840961.964 |
| 5.312433177220149 | 0.965 | -19540.744 | 0.812 | 16213633.14 | 0.622 | -51461921.53 |
| 5.315574769873739 | 0.965 | -19829.849 | 0.813 | 16396787.798 | 0.624 | -52090056.953 |
| 5.318716362527328 | 0.966 | -20122.845 | 0.814 | 16581909.008 | 0.626 | -52725446.518 |
| 5.321857955180918 | 0.966 | -20419.78 | 0.815 | 16769016.788 | 0.628 | -53368169.312 |
| 5.324999547834508 | 0.966 | -20720.701 | 0.816 | 16958131.348 | 0.631 | -54018305.237 |
| 5.328141140488097 | 0.966 | -21025.659 | 0.817 | 17149273.095 | 0.633 | -54675935.014 |
| 5.331282733141686 | 0.966 | -21334.704 | 0.817 | 17342462.63 | 0.635 | -55341140.191 |
| 5.334424325795276 | 0.966 | -21647.884 | 0.818 | 17537720.751 | 0.637 | -56014003.151 |
| 5.337565918448866 | 0.967 | -21965.253 | 0.819 | 17735068.457 | 0.639 | -56694607.122 |
| 5.340707511102456 | 0.967 | -22286.859 | 0.82 | 17934526.95 | 0.641 | -57383036.183 |
| 5.343849103756045 | 0.967 | -22612.757 | 0.821 | 18136117.633 | 0.643 | -58079375.271 |
| 5.346990696409634 | 0.967 | -22942.999 | 0.822 | 18339862.115 | 0.645 | -58783710.196 |
| 5.350132289063224 | 0.967 | -23277.637 | 0.823 | 18545782.213 | 0.647 | -59496127.639 |
| 5.353273881716814 | 0.967 | -23616.725 | 0.824 | 18753899.95 | 0.649 | -60216715.169 |
| 5.356415474370403 | 0.967 | -23960.319 | 0.825 | 18964237.563 | 0.652 | -60945561.249 |
| 5.359557067023993 | 0.968 | -24308.472 | 0.826 | 19176817.501 | 0.654 | -61682755.24 |
| 5.362698659677583 | 0.968 | -24661.242 | 0.827 | 19391662.425 | 0.656 | -62428387.419 |
| 5.365840252331172 | 0.968 | -25018.683 | 0.828 | 19608795.216 | 0.658 | -63182548.977 |
| 5.368981844984762 | 0.968 | -25380.854 | 0.828 | 19828238.972 | 0.66 | -63945332.036 |
| 5.372123437638351 | 0.968 | -25747.811 | 0.829 | 20050017.01 | 0.662 | -64716829.654 |
| 5.375265030291941 | 0.968 | -26119.613 | 0.83 | 20274152.873 | 0.664 | -65497135.836 |
| 5.378406622945531 | 0.969 | -26496.318 | 0.831 | 20500670.325 | 0.666 | -66286345.541 |
| 5.38154821559912 | 0.969 | -26877.987 | 0.832 | 20729593.358 | 0.668 | -67084554.69 |
| 5.38468980825271 | 0.969 | -27264.68 | 0.833 | 20960946.191 | 0.67 | -67891860.181 |
| 5.387831400906299 | 0.969 | -27656.456 | 0.834 | 21194753.277 | 0.672 | -68708359.892 |
| 5.39097299355989 | 0.969 | -28053.379 | 0.835 | 21431039.298 | 0.674 | -69534152.692 |
| 5.394114586213479 | 0.969 | -28455.51 | 0.836 | 21669829.171 | 0.676 | -70369338.454 |
| 5.397256178867068 | 0.97 | -28862.911 | 0.837 | 21911148.053 | 0.678 | -71214018.06 |
| 5.400397771520657 | 0.97 | -29275.648 | 0.838 | 22155021.336 | 0.68 | -72068293.412 |
| 5.403539364174247 | 0.97 | -29693.784 | 0.839 | 22401474.655 | 0.682 | -72932267.442 |
| 5.406680956827837 | 0.97 | -30117.384 | 0.839 | 22650533.888 | 0.684 | -73806044.122 |
| 5.409822549481426 | 0.97 | -30546.515 | 0.84 | 22902225.159 | 0.686 | -74689728.475 |
| 5.412964142135016 | 0.97 | -30981.241 | 0.841 | 23156574.837 | 0.688 | -75583426.583 |
| 5.416105734788605 | 0.97 | -31421.632 | 0.842 | 23413609.544 | 0.691 | -76487245.595 |
| 5.419247327442195 | 0.971 | -31867.755 | 0.843 | 23673356.153 | 0.693 | -77401293.743 |
| 5.422388920095785 | 0.971 | -32319.678 | 0.844 | 23935841.789 | 0.695 | -78325680.348 |
| 5.425530512749375 | 0.971 | -32777.472 | 0.845 | 24201093.837 | 0.697 | -79260515.831 |
| 5.428672105402964 | 0.971 | -33241.207 | 0.846 | 24469139.938 | 0.699 | -80205911.723 |
| 5.431813698056554 | 0.971 | -33710.953 | 0.847 | 24740007.995 | 0.701 | -81161980.678 |
| 5.434955290710143 | 0.971 | -34186.783 | 0.848 | 25013726.176 | 0.703 | -82128836.48 |
| 5.438096883363733 | 0.972 | -34668.769 | 0.849 | 25290322.913 | 0.705 | -83106594.055 |
| 5.441238476017322 | 0.972 | -35156.985 | 0.85 | 25569826.905 | 0.707 | -84095369.485 |
| 5.444380068670912 | 0.972 | -35651.505 | 0.85 | 25852267.125 | 0.709 | -85095280.013 |
| 5.447521661324502 | 0.972 | -36152.404 | 0.851 | 26137672.816 | 0.711 | -86106444.059 |
| 5.450663253978091 | 0.972 | -36659.759 | 0.852 | 26426073.498 | 0.712 | -87128981.228 |
| 5.453804846631681 | 0.972 | -37173.645 | 0.853 | 26717498.967 | 0.714 | -88163012.322 |
| 5.456946439285271 | 0.973 | -37694.141 | 0.854 | 27011979.301 | 0.716 | -89208659.352 |
| 5.46008803193886 | 0.973 | -38221.325 | 0.855 | 27309544.859 | 0.718 | -90266045.549 |
| 5.46322962459245 | 0.973 | -38755.277 | 0.856 | 27610226.288 | 0.72 | -91335295.375 |
| 5.466371217246039 | 0.973 | -39296.076 | 0.857 | 27914054.52 | 0.722 | -92416534.534 |
| 5.46951280989963 | 0.973 | -39843.805 | 0.858 | 28221060.778 | 0.724 | -93509889.986 |
| 5.472654402553218 | 0.973 | -40398.544 | 0.859 | 28531276.579 | 0.726 | -94615489.956 |
| 5.475795995206808 | 0.974 | -40960.376 | 0.86 | 28844733.735 | 0.728 | -95733463.948 |
| 5.478937587860398 | 0.974 | -41529.386 | 0.861 | 29161464.354 | 0.73 | -96863942.754 |
| 5.482079180513987 | 0.974 | -42105.659 | 0.861 | 29481500.848 | 0.732 | -98007058.472 |
| 5.485220773167577 | 0.974 | -42689.279 | 0.862 | 29804875.93 | 0.734 | -99162944.509 |
| 5.488362365821166 | 0.974 | -43280.333 | 0.863 | 30131622.62 | 0.736 | -100331735.603 |
| 5.491503958474756 | 0.974 | -43878.91 | 0.864 | 30461774.246 | 0.738 | -101513567.829 |
| 5.494645551128346 | 0.975 | -44485.097 | 0.865 | 30795364.449 | 0.74 | -102708578.614 |
| 5.497787143781935 | 0.975 | -45098.984 | 0.866 | 31132427.182 | 0.742 | -103916906.747 |
| 5.500928736435525 | 0.975 | -45720.661 | 0.867 | 31472996.717 | 0.744 | -105138692.397 |
| 5.504070329089115 | 0.975 | -46350.219 | 0.868 | 31817107.644 | 0.745 | -106374077.121 |
| 5.507211921742704 | 0.975 | -46987.752 | 0.869 | 32164794.877 | 0.747 | -107623203.877 |
| 5.510353514396294 | 0.975 | -47633.353 | 0.87 | 32516093.654 | 0.749 | -108886217.04 |
| 5.513495107049883 | 0.975 | -48287.115 | 0.871 | 32871039.543 | 0.751 | -110163262.415 |
| 5.516636699703473 | 0.976 | -48949.134 | 0.871 | 33229668.442 | 0.753 | -111454487.246 |
| 5.519778292357062 | 0.976 | -49619.507 | 0.872 | 33592016.582 | 0.755 | -112760040.234 |
| 5.522919885010652 | 0.976 | -50298.332 | 0.873 | 33958120.533 | 0.757 | -114080071.549 |
| 5.526061477664242 | 0.976 | -50985.706 | 0.874 | 34328017.204 | 0.759 | -115414732.844 |
| 5.529203070317831 | 0.976 | -51681.73 | 0.875 | 34701743.847 | 0.76 | -116764177.265 |
| 5.532344662971421 | 0.976 | -52386.504 | 0.876 | 35079338.059 | 0.762 | -118128559.473 |
| 5.535486255625011 | 0.977 | -53100.13 | 0.877 | 35460837.787 | 0.764 | -119508035.649 |
| 5.5386278482786 | 0.977 | -53822.711 | 0.878 | 35846281.33 | 0.766 | -120902763.513 |
| 5.54176944093219 | 0.977 | -54554.351 | 0.879 | 36235707.342 | 0.768 | -122312902.339 |
| 5.544911033585779 | 0.977 | -55295.154 | 0.88 | 36629154.833 | 0.77 | -123738612.966 |
| 5.54805262623937 | 0.977 | -56045.228 | 0.88 | 37026663.178 | 0.771 | -125180057.816 |
| 5.551194218892959 | 0.977 | -56804.68 | 0.881 | 37428272.113 | 0.773 | -126637400.904 |
| 5.554335811546548 | 0.978 | -57573.618 | 0.882 | 37834021.744 | 0.775 | -128110807.859 |
| 5.557477404200137 | 0.978 | -58352.152 | 0.883 | 38243952.547 | 0.777 | -129600445.931 |
| 5.560618996853727 | 0.978 | -59140.392 | 0.884 | 38658105.371 | 0.779 | -131106484.015 |
| 5.563760589507317 | 0.978 | -59938.452 | 0.885 | 39076521.444 | 0.781 | -132629092.658 |
| 5.566902182160906 | 0.978 | -60746.444 | 0.886 | 39499242.373 | 0.782 | -134168444.08 |
| 5.570043774814496 | 0.978 | -61564.482 | 0.887 | 39926310.15 | 0.784 | -135724712.184 |
| 5.573185367468086 | 0.979 | -62392.683 | 0.887 | 40357767.154 | 0.786 | -137298072.578 |
| 5.576326960121675 | 0.979 | -63231.163 | 0.888 | 40793656.155 | 0.788 | -138888702.586 |
| 5.579468552775264 | 0.979 | -64080.04 | 0.889 | 41234020.315 | 0.789 | -140496781.263 |
| 5.582610145428854 | 0.979 | -64939.435 | 0.89 | 41678903.196 | 0.791 | -142122489.416 |
| 5.585751738082444 | 0.979 | -65809.467 | 0.891 | 42128348.758 | 0.793 | -143766009.614 |
| 5.588893330736034 | 0.979 | -66690.259 | 0.892 | 42582401.369 | 0.795 | -145427526.209 |
| 5.592034923389623 | 0.979 | -67581.934 | 0.893 | 43041105.801 | 0.796 | -147107225.349 |
| 5.595176516043213 | 0.98 | -68484.617 | 0.894 | 43504507.241 | 0.798 | -148805294.998 |
| 5.598318108696803 | 0.98 | -69398.433 | 0.894 | 43972651.287 | 0.8 | -150521924.947 |
| 5.601459701350392 | 0.98 | -70323.511 | 0.895 | 44445583.958 | 0.802 | -152257306.837 |
| 5.604601294003982 | 0.98 | -71259.978 | 0.896 | 44923351.695 | 0.803 | -154011634.173 |
| 5.607742886657571 | 0.98 | -72207.965 | 0.897 | 45406001.365 | 0.805 | -155785102.338 |
| 5.610884479311161 | 0.98 | -73167.602 | 0.898 | 45893580.263 | 0.807 | -157577908.617 |
| 5.61402607196475 | 0.981 | -74139.024 | 0.899 | 46386136.117 | 0.809 | -159390252.208 |
| 5.61716766461834 | 0.981 | -75122.363 | 0.9 | 46883717.095 | 0.81 | -161222334.244 |
| 5.62030925727193 | 0.981 | -76117.757 | 0.9 | 47386371.802 | 0.812 | -163074357.807 |
| 5.623450849925519 | 0.981 | -77125.34 | 0.901 | 47894149.29 | 0.814 | -164946527.948 |
| 5.626592442579109 | 0.981 | -78145.253 | 0.902 | 48407099.058 | 0.815 | -166839051.704 |
| 5.629734035232698 | 0.981 | -79177.635 | 0.903 | 48925271.056 | 0.817 | -168752138.117 |
| 5.632875627886288 | 0.982 | -80222.627 | 0.904 | 49448715.694 | 0.819 | -170685998.251 |
| 5.636017220539878 | 0.982 | -81280.373 | 0.905 | 49977483.837 | 0.82 | -172640845.211 |
| 5.639158813193467 | 0.982 | -82351.016 | 0.905 | 50511626.817 | 0.822 | -174616894.163 |
| 5.642300405847057 | 0.982 | -83434.704 | 0.906 | 51051196.434 | 0.824 | -176614362.348 |
| 5.645441998500646 | 0.982 | -84531.582 | 0.907 | 51596244.959 | 0.825 | -178633469.107 |
| 5.648583591154236 | 0.982 | -85641.801 | 0.908 | 52146825.139 | 0.827 | -180674435.896 |
| 5.651725183807825 | 0.982 | -86765.51 | 0.909 | 52702990.2 | 0.828 | -182737486.306 |
| 5.654866776461415 | 0.983 | -87902.862 | 0.91 | 53264793.855 | 0.83 | -184822846.083 |
| 5.658008369115005 | 0.983 | -89054.011 | 0.91 | 53832290.303 | 0.832 | -186930743.146 |
| 5.661149961768594 | 0.983 | -90219.112 | 0.911 | 54405534.235 | 0.833 | -189061407.61 |
| 5.664291554422184 | 0.983 | -91398.322 | 0.912 | 54984580.842 | 0.835 | -191215071.802 |
| 5.667433147075774 | 0.983 | -92591.8 | 0.913 | 55569485.813 | 0.837 | -193391970.281 |
| 5.670574739729363 | 0.983 | -93799.705 | 0.914 | 56160305.342 | 0.838 | -195592339.863 |
| 5.673716332382953 | 0.983 | -95022.201 | 0.914 | 56757096.135 | 0.84 | -197816419.635 |
| 5.676857925036542 | 0.984 | -96259.45 | 0.915 | 57359915.41 | 0.841 | -200064450.982 |
| 5.679999517690132 | 0.984 | -97511.618 | 0.916 | 57968820.905 | 0.843 | -202336677.6 |
| 5.683141110343721 | 0.984 | -98778.872 | 0.917 | 58583870.878 | 0.844 | -204633345.525 |
| 5.686282702997311 | 0.984 | -100061.38 | 0.918 | 59205124.117 | 0.846 | -206954703.147 |
| 5.689424295650901 | 0.984 | -101359.314 | 0.918 | 59832639.94 | 0.848 | -209301001.236 |
| 5.69256588830449 | 0.984 | -102672.846 | 0.919 | 60466478.202 | 0.849 | -211672492.962 |
| 5.69570748095808 | 0.985 | -104002.149 | 0.92 | 61106699.298 | 0.851 | -214069433.916 |
| 5.69884907361167 | 0.985 | -105347.401 | 0.921 | 61753364.17 | 0.852 | -216492082.13 |
| 5.701990666265259 | 0.985 | -106708.777 | 0.922 | 62406534.309 | 0.854 | -218940698.104 |
| 5.705132258918849 | 0.985 | -108086.459 | 0.922 | 63066271.759 | 0.855 | -221415544.824 |
| 5.708273851572438 | 0.985 | -109480.627 | 0.923 | 63732639.128 | 0.857 | -223916887.783 |
| 5.711415444226028 | 0.985 | -110891.466 | 0.924 | 64405699.583 | 0.858 | -226444995.01 |
| 5.714557036879618 | 0.985 | -112319.159 | 0.925 | 65085516.863 | 0.86 | -229000137.086 |
| 5.717698629533207 | 0.986 | -113763.895 | 0.925 | 65772155.28 | 0.861 | -231582587.17 |
| 5.720840222186797 | 0.986 | -115225.862 | 0.926 | 66465679.725 | 0.863 | -234192621.02 |
| 5.723981814840386 | 0.986 | -116705.252 | 0.927 | 67166155.672 | 0.864 | -236830517.02 |
| 5.727123407493976 | 0.986 | -118202.257 | 0.928 | 67873649.185 | 0.866 | -239496556.2 |
| 5.730265000147565 | 0.986 | -119717.072 | 0.928 | 68588226.919 | 0.867 | -242191022.261 |
| 5.733406592801155 | 0.986 | -121249.895 | 0.929 | 69309956.13 | 0.869 | -244914201.597 |
| 5.736548185454744 | 0.986 | -122800.925 | 0.93 | 70038904.676 | 0.87 | -247666383.325 |
| 5.739689778108334 | 0.987 | -124370.362 | 0.931 | 70775141.024 | 0.871 | -250447859.299 |
| 5.742831370761924 | 0.987 | -125958.409 | 0.931 | 71518734.255 | 0.873 | -253258924.146 |
| 5.745972963415514 | 0.987 | -127565.273 | 0.932 | 72269754.069 | 0.874 | -256099875.28 |
| 5.749114556069103 | 0.987 | -129191.159 | 0.933 | 73028270.791 | 0.876 | -258971012.936 |
| 5.752256148722693 | 0.987 | -130836.279 | 0.934 | 73794355.375 | 0.877 | -261872640.187 |
| 5.755397741376282 | 0.987 | -132500.842 | 0.934 | 74568079.408 | 0.878 | -264805062.978 |
| 5.758539334029872 | 0.987 | -134185.064 | 0.935 | 75349515.121 | 0.88 | -267768590.141 |
| 5.761680926683462 | 0.988 | -135889.16 | 0.936 | 76138735.387 | 0.881 | -270763533.431 |
| 5.764822519337051 | 0.988 | -137613.348 | 0.937 | 76935813.731 | 0.883 | -273790207.544 |
| 5.767964111990641 | 0.988 | -139357.848 | 0.937 | 77740824.337 | 0.884 | -276848930.149 |
| 5.77110570464423 | 0.988 | -141122.883 | 0.938 | 78553842.047 | 0.885 | -279940021.909 |
| 5.77424729729782 | 0.988 | -142908.679 | 0.939 | 79374942.373 | 0.887 | -283063806.512 |
| 5.77738888995141 | 0.988 | -144715.462 | 0.939 | 80204201.5 | 0.888 | -286220610.695 |
| 5.780530482605 | 0.988 | -146543.462 | 0.94 | 81041696.291 | 0.889 | -289410764.273 |
| 5.783672075258588 | 0.988 | -148392.91 | 0.941 | 81887504.295 | 0.891 | -292634600.163 |
| 5.786813667912178 | 0.989 | -150264.041 | 0.942 | 82741703.75 | 0.892 | -295892454.418 |
| 5.789955260565768 | 0.989 | -152157.092 | 0.942 | 83604373.591 | 0.893 | -299184666.245 |
| 5.793096853219358 | 0.989 | -154072.301 | 0.943 | 84475593.453 | 0.895 | -302511578.041 |
| 5.796238445872947 | 0.989 | -156009.91 | 0.944 | 85355443.681 | 0.896 | -305873535.418 |
| 5.799380038526537 | 0.989 | -157970.163 | 0.944 | 86244005.333 | 0.897 | -309270887.233 |
| 5.802521631180126 | 0.989 | -159953.306 | 0.945 | 87141360.186 | 0.899 | -312703985.612 |
| 5.805663223833715 | 0.989 | -161959.587 | 0.946 | 88047590.744 | 0.9 | -316173185.984 |
| 5.808804816487306 | 0.99 | -163989.259 | 0.946 | 88962780.243 | 0.901 | -319678847.109 |
| 5.811946409140895 | 0.99 | -166042.575 | 0.947 | 89887012.654 | 0.902 | -323221331.105 |
| 5.815088001794485 | 0.99 | -168119.792 | 0.948 | 90820372.694 | 0.904 | -326801003.48 |
| 5.818229594448074 | 0.99 | -170221.168 | 0.948 | 91762945.833 | 0.905 | -330418233.159 |
| 5.821371187101663 | 0.99 | -172346.966 | 0.949 | 92714818.292 | 0.906 | -334073392.519 |
| 5.824512779755254 | 0.99 | -174497.449 | 0.95 | 93676077.059 | 0.908 | -337766857.413 |
| 5.827654372408843 | 0.99 | -176672.885 | 0.95 | 94646809.89 | 0.909 | -341499007.205 |
| 5.830795965062433 | 0.99 | -178873.543 | 0.951 | 95627105.317 | 0.91 | -345270224.799 |
| 5.833937557716022 | 0.991 | -181099.696 | 0.952 | 96617052.652 | 0.911 | -349080896.671 |
| 5.837079150369612 | 0.991 | -183351.618 | 0.952 | 97616741.999 | 0.912 | -352931412.9 |
| 5.840220743023201 | 0.991 | -185629.588 | 0.953 | 98626264.254 | 0.914 | -356822167.198 |
| 5.843362335676791 | 0.991 | -187933.886 | 0.954 | 99645711.116 | 0.915 | -360753556.945 |
| 5.846503928330381 | 0.991 | -190264.796 | 0.954 | 100675175.094 | 0.916 | -364725983.216 |
| 5.84964552098397 | 0.991 | -192622.604 | 0.955 | 101714749.51 | 0.917 | -368739850.821 |
| 5.85278711363756 | 0.991 | -195007.599 | 0.955 | 102764528.508 | 0.918 | -372795568.329 |
| 5.85592870629115 | 0.991 | -197420.073 | 0.956 | 103824607.061 | 0.919 | -376893548.107 |
| 5.85907029894474 | 0.991 | -199860.322 | 0.957 | 104895080.979 | 0.921 | -381034206.35 |
| 5.862211891598329 | 0.992 | -202328.643 | 0.957 | 105976046.913 | 0.922 | -385217963.117 |
| 5.865353484251918 | 0.992 | -204825.337 | 0.958 | 107067602.363 | 0.923 | -389445242.361 |
| 5.868495076905508 | 0.992 | -207350.708 | 0.959 | 108169845.688 | 0.924 | -393716471.968 |
| 5.871636669559098 | 0.992 | -209905.064 | 0.959 | 109282876.107 | 0.925 | -398032083.785 |
| 5.874778262212687 | 0.992 | -212488.714 | 0.96 | 110406793.714 | 0.926 | -402392513.66 |
| 5.877919854866277 | 0.992 | -215101.971 | 0.96 | 111541699.477 | 0.927 | -406798201.473 |
| 5.881061447519866 | 0.992 | -217745.151 | 0.961 | 112687695.253 | 0.929 | -411249591.175 |
| 5.884203040173456 | 0.992 | -220418.575 | 0.962 | 113844883.787 | 0.93 | -415747130.818 |
| 5.887344632827046 | 0.993 | -223122.564 | 0.962 | 115013368.728 | 0.931 | -420291272.596 |
| 5.890486225480635 | 0.993 | -225857.444 | 0.963 | 116193254.631 | 0.932 | -424882472.877 |
| 5.893627818134224 | 0.993 | -228623.545 | 0.963 | 117384646.965 | 0.933 | -429521192.243 |
| 5.896769410787814 | 0.993 | -231421.198 | 0.964 | 118587652.122 | 0.934 | -434207895.52 |
| 5.899911003441404 | 0.993 | -234250.74 | 0.964 | 119802377.424 | 0.935 | -438943051.825 |
| 5.903052596094994 | 0.993 | -237112.508 | 0.965 | 121028931.131 | 0.936 | -443727134.591 |
| 5.906194188748583 | 0.993 | -240006.846 | 0.966 | 122267422.448 | 0.937 | -448560621.616 |
| 5.909335781402172 | 0.993 | -242934.099 | 0.966 | 123517961.532 | 0.938 | -453443995.091 |
| 5.912477374055762 | 0.993 | -245894.616 | 0.967 | 124780659.502 | 0.939 | -458377741.645 |
| 5.915618966709352 | 0.994 | -248888.75 | 0.967 | 126055628.447 | 0.94 | -463362352.379 |
| 5.918760559362942 | 0.994 | -251916.856 | 0.968 | 127342981.43 | 0.941 | -468398322.908 |
| 5.921902152016531 | 0.994 | -254979.294 | 0.968 | 128642832.502 | 0.942 | -473486153.398 |
| 5.92504374467012 | 0.994 | -258076.428 | 0.969 | 129955296.705 | 0.943 | -478626348.603 |
| 5.92818533732371 | 0.994 | -261208.623 | 0.969 | 131280490.082 | 0.944 | -483819417.91 |
| 5.9313269299773 | 0.994 | -264376.25 | 0.97 | 132618529.685 | 0.945 | -489065875.374 |
| 5.93446852263089 | 0.994 | -267579.683 | 0.97 | 133969533.586 | 0.946 | -494366239.762 |
| 5.93761011528448 | 0.994 | -270819.3 | 0.971 | 135333620.879 | 0.947 | -499721034.59 |
| 5.940751707938068 | 0.994 | -274095.482 | 0.971 | 136710911.697 | 0.948 | -505130788.166 |
| 5.943893300591658 | 0.994 | -277408.613 | 0.972 | 138101527.21 | 0.949 | -510596033.631 |
| 5.947034893245248 | 0.995 | -280759.083 | 0.972 | 139505589.645 | 0.95 | -516117309 |
| 5.950176485898837 | 0.995 | -284147.285 | 0.973 | 140923222.285 | 0.951 | -521695157.206 |
| 5.953318078552427 | 0.995 | -287573.614 | 0.973 | 142354549.482 | 0.952 | -527330126.137 |
| 5.956459671206017 | 0.995 | -291038.471 | 0.974 | 143799696.667 | 0.953 | -533022768.685 |
| 5.959601263859606 | 0.995 | -294542.261 | 0.974 | 145258790.356 | 0.953 | -538773642.784 |
| 5.962742856513196 | 0.995 | -298085.392 | 0.975 | 146731958.16 | 0.954 | -544583311.455 |
| 5.965884449166785 | 0.995 | -301668.275 | 0.975 | 148219328.793 | 0.955 | -550452342.85 |
| 5.969026041820375 | 0.995 | -305291.328 | 0.976 | 149721032.082 | 0.956 | -556381310.296 |
| 5.972167634473964 | 0.995 | -308954.97 | 0.976 | 151237198.978 | 0.957 | -562370792.339 |
| 5.975309227127554 | 0.995 | -312659.626 | 0.977 | 152767961.56 | 0.958 | -568421372.786 |
| 5.978450819781144 | 0.995 | -316405.725 | 0.977 | 154313453.049 | 0.959 | -574533640.755 |
| 5.981592412434733 | 0.996 | -320193.699 | 0.978 | 155873807.815 | 0.959 | -580708190.717 |
| 5.984734005088323 | 0.996 | -324023.985 | 0.978 | 157449161.387 | 0.96 | -586945622.542 |
| 5.987875597741913 | 0.996 | -327897.025 | 0.979 | 159039650.462 | 0.961 | -593246541.545 |
| 5.991017190395502 | 0.996 | -331813.263 | 0.979 | 160645412.916 | 0.962 | -599611558.534 |
| 5.994158783049092 | 0.996 | -335773.151 | 0.979 | 162266587.81 | 0.963 | -606041289.855 |
| 5.997300375702681 | 0.996 | -339777.141 | 0.98 | 163903315.403 | 0.964 | -612536357.441 |
| 6.000441968356271 | 0.996 | -343825.693 | 0.98 | 165555737.161 | 0.964 | -619097388.857 |
| 6.003583561009861 | 0.996 | -347919.27 | 0.981 | 167223995.767 | 0.965 | -625725017.35 |
| 6.00672515366345 | 0.996 | -352058.34 | 0.981 | 168908235.128 | 0.966 | -632419881.897 |
| 6.00986674631704 | 0.996 | -356243.373 | 0.982 | 170608600.39 | 0.967 | -639182627.254 |
| 6.01300833897063 | 0.996 | -360474.848 | 0.982 | 172325237.943 | 0.967 | -646013904.002 |
| 6.01614993162422 | 0.997 | -364753.245 | 0.982 | 174058295.435 | 0.968 | -652914368.602 |
| 6.019291524277808 | 0.997 | -369079.05 | 0.983 | 175807921.779 | 0.969 | -659884683.44 |
| 6.022433116931398 | 0.997 | -373452.754 | 0.983 | 177574267.165 | 0.97 | -666925516.881 |
| 6.025574709584988 | 0.997 | -377874.853 | 0.984 | 179357483.071 | 0.97 | -674037543.315 |
| 6.028716302238577 | 0.997 | -382345.846 | 0.984 | 181157722.271 | 0.971 | -681221443.213 |
| 6.031857894892167 | 0.997 | -386866.238 | 0.984 | 182975138.848 | 0.972 | -688477903.176 |
| 6.034999487545757 | 0.997 | -391436.539 | 0.985 | 184809888.203 | 0.972 | -695807615.987 |
| 6.038141080199346 | 0.997 | -396057.264 | 0.985 | 186662127.065 | 0.973 | -703211280.663 |
| 6.041282672852935 | 0.997 | -400728.933 | 0.986 | 188532013.505 | 0.974 | -710689602.51 |
| 6.044424265506525 | 0.997 | -405452.071 | 0.986 | 190419706.943 | 0.975 | -718243293.173 |
| 6.047565858160115 | 0.997 | -410227.206 | 0.986 | 192325368.16 | 0.975 | -725873070.69 |
| 6.050707450813704 | 0.997 | -415054.875 | 0.987 | 194249159.311 | 0.976 | -733579659.549 |
| 6.053849043467294 | 0.997 | -419935.616 | 0.987 | 196191243.933 | 0.976 | -741363790.74 |
| 6.056990636120884 | 0.997 | -424869.975 | 0.987 | 198151786.957 | 0.977 | -749226201.808 |
| 6.060132228774473 | 0.998 | -429858.503 | 0.988 | 200130954.721 | 0.978 | -757167636.912 |
| 6.063273821428063 | 0.998 | -434901.755 | 0.988 | 202128914.981 | 0.978 | -765188846.88 |
| 6.066415414081653 | 0.998 | -440000.292 | 0.988 | 204145836.918 | 0.979 | -773290589.262 |
| 6.069557006735242 | 0.998 | -445154.68 | 0.989 | 206181891.157 | 0.98 | -781473628.391 |
| 6.072698599388831 | 0.998 | -450365.492 | 0.989 | 208237249.77 | 0.98 | -789738735.435 |
| 6.07584019204242 | 0.998 | -455633.303 | 0.989 | 210312086.296 | 0.981 | -798086688.46 |
| 6.078981784696011 | 0.998 | -460958.698 | 0.99 | 212406575.747 | 0.981 | -806518272.485 |
| 6.082123377349601 | 0.998 | -466342.265 | 0.99 | 214520894.62 | 0.982 | -815034279.538 |
| 6.08526497000319 | 0.998 | -471784.597 | 0.99 | 216655220.913 | 0.982 | -823635508.719 |
| 6.08840656265678 | 0.998 | -477286.293 | 0.991 | 218809734.134 | 0.983 | -832322766.259 |
| 6.09154815531037 | 0.998 | -482847.96 | 0.991 | 220984615.312 | 0.984 | -841096865.577 |
| 6.094689747963959 | 0.998 | -488470.208 | 0.991 | 223180047.012 | 0.984 | -849958627.342 |
| 6.097831340617549 | 0.998 | -494153.654 | 0.991 | 225396213.346 | 0.985 | -858908879.533 |
| 6.100972933271138 | 0.998 | -499898.921 | 0.992 | 227633299.983 | 0.985 | -867948457.5 |
| 6.104114525924728 | 0.998 | -505706.637 | 0.992 | 229891494.168 | 0.986 | -877078204.029 |
| 6.107256118578317 | 0.998 | -511577.438 | 0.992 | 232170984.726 | 0.986 | -886298969.398 |
| 6.110397711231907 | 0.999 | -517511.963 | 0.993 | 234471962.081 | 0.987 | -895611611.446 |
| 6.113539303885497 | 0.999 | -523510.86 | 0.993 | 236794618.267 | 0.987 | -905016995.63 |
| 6.116680896539086 | 0.999 | -529574.78 | 0.993 | 239139146.939 | 0.988 | -914515995.094 |
| 6.119822489192675 | 0.999 | -535704.385 | 0.993 | 241505743.388 | 0.988 | -924109490.732 |
| 6.122964081846265 | 0.999 | -541900.337 | 0.994 | 243894604.554 | 0.988 | -933798371.247 |
| 6.126105674499855 | 0.999 | -548163.31 | 0.994 | 246305929.038 | 0.989 | -943583533.225 |
| 6.129247267153445 | 0.999 | -554493.981 | 0.994 | 248739917.114 | 0.989 | -953465881.194 |
| 6.132388859807034 | 0.999 | -560893.034 | 0.994 | 251196770.747 | 0.99 | -963446327.693 |
| 6.135530452460624 | 0.999 | -567361.16 | 0.995 | 253676693.602 | 0.99 | -973525793.338 |
| 6.138672045114213 | 0.999 | -573899.057 | 0.995 | 256179891.057 | 0.991 | -983705206.888 |
| 6.141813637767803 | 0.999 | -580507.427 | 0.995 | 258706570.223 | 0.991 | -993985505.315 |
| 6.144955230421393 | 0.999 | -587186.983 | 0.995 | 261256939.948 | 0.991 | -1004367633.872 |
| 6.148096823074982 | 0.999 | -593938.44 | 0.995 | 263831210.839 | 0.992 | -1014852546.159 |
| 6.151238415728571 | 0.999 | -600762.524 | 0.996 | 266429595.273 | 0.992 | -1025441204.194 |
| 6.154380008382161 | 0.999 | -607659.964 | 0.996 | 269052307.411 | 0.993 | -1036134578.484 |
| 6.157521601035751 | 0.999 | -614631.498 | 0.996 | 271699563.209 | 0.993 | -1046933648.094 |
| 6.16066319368934 | 0.999 | -621677.871 | 0.996 | 274371580.44 | 0.993 | -1057839400.718 |
| 6.16380478634293 | 0.999 | -628799.834 | 0.996 | 277068578.7 | 0.994 | -1068852832.751 |
| 6.16694637899652 | 0.999 | -635998.146 | 0.997 | 279790779.427 | 0.994 | -1079974949.36 |
| 6.170087971650109 | 0.999 | -643273.573 | 0.997 | 282538405.915 | 0.994 | -1091206764.557 |
| 6.173229564303698 | 0.999 | -650626.888 | 0.997 | 285311683.328 | 0.995 | -1102549301.273 |
| 6.176371156957289 | 0.999 | -658058.87 | 0.997 | 288110838.715 | 0.995 | -1114003591.431 |
| 6.179512749610878 | 0.999 | -665570.307 | 0.997 | 290936101.026 | 0.995 | -1125570676.02 |
| 6.182654342264468 | 0.999 | -673161.993 | 0.997 | 293787701.123 | 0.995 | -1137251605.171 |
| 6.185795934918057 | 1 | -680834.732 | 0.998 | 296665871.8 | 0.996 | -1149047438.23 |
| 6.188937527571647 | 1 | -688589.333 | 0.998 | 299570847.796 | 0.996 | -1160959243.837 |
| 6.192079120225237 | 1 | -696426.613 | 0.998 | 302502865.811 | 0.996 | -1172988100 |
| 6.195220712878826 | 1 | -704347.396 | 0.998 | 305462164.518 | 0.997 | -1185135094.174 |
| 6.198362305532415 | 1 | -712352.516 | 0.998 | 308448984.585 | 0.997 | -1197401323.338 |
| 6.201503898186005 | 1 | -720442.813 | 0.998 | 311463568.684 | 0.997 | -1209787894.073 |
| 6.204645490839594 | 1 | -728619.135 | 0.998 | 314506161.513 | 0.997 | -1222295922.643 |
| 6.207787083493184 | 1 | -736882.337 | 0.999 | 317577009.806 | 0.997 | -1234926535.071 |
| 6.210928676146774 | 1 | -745233.285 | 0.999 | 320676362.352 | 0.998 | -1247680867.223 |
| 6.214070268800364 | 1 | -753672.85 | 0.999 | 323804470.012 | 0.998 | -1260560064.886 |
| 6.217211861453953 | 1 | -762201.913 | 0.999 | 326961585.734 | 0.998 | -1273565283.85 |
| 6.220353454107543 | 1 | -770821.361 | 0.999 | 330147964.569 | 0.998 | -1286697689.992 |
| 6.223495046761133 | 1 | -779532.091 | 0.999 | 333363863.688 | 0.998 | -1299958459.356 |
| 6.226636639414722 | 1 | -788335.008 | 0.999 | 336609542.397 | 0.999 | -1313348778.239 |
| 6.229778232068312 | 1 | -797231.025 | 0.999 | 339885262.158 | 0.999 | -1326869843.271 |
| 6.232919824721901 | 1 | -806221.064 | 0.999 | 343191286.601 | 0.999 | -1340522861.506 |
| 6.236061417375491 | 1 | -815306.056 | 0.999 | 346527881.544 | 0.999 | -1354309050.499 |
| 6.23920301002908 | 1 | -824486.939 | 1 | 349895315.009 | 0.999 | -1368229638.399 |
| 6.24234460268267 | 1 | -833764.661 | 1 | 353293857.239 | 0.999 | -1382285864.033 |
| 6.24548619533626 | 1 | -843140.177 | 1 | 356723780.716 | 0.999 | -1396478976.992 |
| 6.24862778798985 | 1 | -852614.454 | 1 | 360185360.178 | 0.999 | -1410810237.721 |
| 6.251769380643438 | 1 | -862188.464 | 1 | 363678872.638 | 1 | -1425280917.605 |
| 6.254910973297028 | 1 | -871863.192 | 1 | 367204597.398 | 1 | -1439892299.061 |
| 6.258052565950618 | 1 | -881639.629 | 1 | 370762816.071 | 1 | -1454645675.627 |
| 6.261194158604208 | 1 | -891518.776 | 1 | 374353812.598 | 1 | -1469542352.052 |
| 6.264335751257797 | 1 | -901501.644 | 1 | 377977873.265 | 1 | -1484583644.387 |
| 6.267477343911387 | 1 | -911589.253 | 1 | 381635286.719 | 1 | -1499770880.079 |
| 6.270618936564976 | 1 | -921782.631 | 1 | 385326343.994 | 1 | -1515105398.061 |
| 6.273760529218566 | 1 | -932082.817 | 1 | 389051338.521 | 1 | -1530588548.848 |
| 6.276902121872155 | 1 | -942490.86 | 1 | 392810566.152 | 1 | -1546221694.629 |
| 6.280043714525745 | 1 | -953007.816 | 1 | 396604325.176 | 1 | -1562006209.362 |
| 6.283185307179335 | 1 | -963634.753 | 1 | 400432916.34 | 1 | -1577943478.873 |